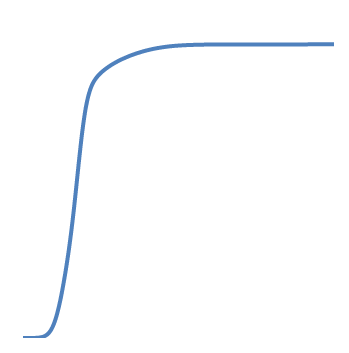
| Category | Series 0 |
|---|---|
| -2.6286 | 0 |
| -2.62704 | 0 |
| -2.62549 | 0 |
| -2.62393 | 0 |
| -2.62238 | 0 |
| -2.62082 | 0 |
| -2.61926 | 0 |
| -2.61771 | 0 |
| -2.61615 | 0 |
| -2.6146 | 0 |
| -2.61304 | 0 |
| -2.61148 | 0 |
| -2.60993 | 0 |
| -2.60837 | 0 |
| -2.60681 | 0 |
| -2.60526 | 0 |
| -2.6037 | 0 |
| -2.60215 | 0 |
| -2.60059 | 0 |
| -2.59903 | 0 |
| -2.59748 | 0 |
| -2.59592 | 0 |
| -2.59437 | 0 |
| -2.59281 | 0 |
| -2.59125 | 0 |
| -2.5897 | 0 |
| -2.58814 | 0 |
| -2.58658 | 0 |
| -2.58503 | 0 |
| -2.58347 | 0 |
| -2.58192 | 0 |
| -2.58036 | 0 |
| -2.5788 | 0 |
| -2.57725 | 0 |
| -2.57569 | 0 |
| -2.57414 | 0 |
| -2.57258 | 0 |
| -2.57102 | 0 |
| -2.56947 | 0 |
| -2.56791 | 0 |
| -2.56635 | 0 |
| -2.5648 | 0 |
| -2.56324 | 0 |
| -2.56169 | 0 |
| -2.56013 | 0 |
| -2.55857 | 0 |
| -2.55702 | 0 |
| -2.55546 | 0 |
| -2.55391 | 0 |
| -2.55235 | 0 |
| -2.55079 | 0 |
| -2.54924 | 0 |
| -2.54768 | 0 |
| -2.54612 | 0 |
| -2.54457 | 0 |
| -2.54301 | 0 |
| -2.54146 | 0 |
| -2.5399 | 0 |
| -2.53834 | 0 |
| -2.53679 | 0 |
| -2.53523 | 0 |
| -2.53368 | 0 |
| -2.53212 | 0 |
| -2.53056 | 0 |
| -2.52901 | 0 |
| -2.52745 | 0 |
| -2.52589 | 0 |
| -2.52434 | 0 |
| -2.52278 | 0 |
| -2.52123 | 0 |
| -2.51967 | 0 |
| -2.51811 | 0 |
| -2.51656 | 0 |
| -2.515 | 0 |
| -2.51345 | 0 |
| -2.51189 | 0 |
| -2.51033 | 0 |
| -2.50878 | 0 |
| -2.50722 | 0 |
| -2.50566 | 0 |
| -2.50411 | 0 |
| -2.50255 | 0 |
| -2.501 | 0 |
| -2.49944 | 0 |
| -2.49788 | 0 |
| -2.49633 | 0 |
| -2.49477 | 0 |
| -2.49322 | 0 |
| -2.49166 | 0 |
| -2.4901 | 0 |
| -2.48855 | 0 |
| -2.48699 | 0 |
| -2.48543 | 0 |
| -2.48388 | 0 |
| -2.48232 | 0 |
| -2.48077 | 0 |
| -2.47921 | 0 |
| -2.47765 | 0 |
| -2.4761 | 0 |
| -2.47454 | 0 |
| -2.47299 | 0 |
| -2.47143 | 0 |
| -2.46987 | 0 |
| -2.46832 | 0 |
| -2.46676 | 0 |
| -2.4652 | 0 |
| -2.46365 | 0 |
| -2.46209 | 0 |
| -2.46054 | 0 |
| -2.45898 | 0 |
| -2.45742 | 0 |
| -2.45587 | 0 |
| -2.45431 | 0 |
| -2.45276 | 0 |
| -2.4512 | 0 |
| -2.44964 | 0 |
| -2.44809 | 0 |
| -2.44653 | 0 |
| -2.44497 | 0 |
| -2.44342 | 0 |
| -2.44186 | 0 |
| -2.44031 | 0 |
| -2.43875 | 0 |
| -2.43719 | 0 |
| -2.43564 | 0 |
| -2.43408 | 0 |
| -2.43253 | 0 |
| -2.43097 | 0 |
| -2.42941 | 0 |
| -2.42786 | 0 |
| -2.4263 | 0 |
| -2.42474 | 0 |
| -2.42319 | 0 |
| -2.42163 | 0 |
| -2.42008 | 0 |
| -2.41852 | 0 |
| -2.41696 | 0 |
| -2.41541 | 0 |
| -2.41385 | 0 |
| -2.4123 | 0 |
| -2.41074 | 0 |
| -2.40918 | 0 |
| -2.40763 | 0 |
| -2.40607 | 0 |
| -2.40451 | 0 |
| -2.40296 | 0 |
| -2.4014 | 0 |
| -2.39985 | 0 |
| -2.39829 | 0 |
| -2.39673 | 0 |
| -2.39518 | 0 |
| -2.39362 | 0 |
| -2.39207 | 0 |
| -2.39051 | 0 |
| -2.38895 | 0 |
| -2.3874 | 0 |
| -2.38584 | 0 |
| -2.38428 | 0 |
| -2.38273 | 0 |
| -2.38117 | 0 |
| -2.37962 | 0 |
| -2.37806 | 0 |
| -2.3765 | 0 |
| -2.37495 | 0 |
| -2.37339 | 0 |
| -2.37184 | 0 |
| -2.37028 | 0 |
| -2.36872 | 0 |
| -2.36717 | 0 |
| -2.36561 | 0 |
| -2.36405 | 0 |
| -2.3625 | 0 |
| -2.36094 | 0 |
| -2.35939 | 0 |
| -2.35783 | 0 |
| -2.35627 | 0 |
| -2.35472 | 0 |
| -2.35316 | 0 |
| -2.35161 | 0 |
| -2.35005 | 0 |
| -2.34849 | 0 |
| -2.34694 | 0 |
| -2.34538 | 0 |
| -2.34382 | 0 |
| -2.34227 | 0 |
| -2.34071 | 0 |
| -2.33916 | 0 |
| -2.3376 | 0 |
| -2.33604 | 0 |
| -2.33449 | 0 |
| -2.33293 | 0 |
| -2.33138 | 0 |
| -2.32982 | 0 |
| -2.32826 | 0 |
| -2.32671 | 0 |
| -2.32515 | 0 |
| -2.32359 | 0 |
| -2.32204 | 0 |
| -2.32048 | 0 |
| -2.31893 | 0 |
| -2.31737 | 0 |
| -2.31581 | 0 |
| -2.31426 | 0 |
| -2.3127 | 0 |
| -2.31115 | 0 |
| -2.30959 | 0 |
| -2.30803 | 0 |
| -2.30648 | 0 |
| -2.30492 | 0 |
| -2.30336 | 0 |
| -2.30181 | 0 |
| -2.30025 | 0 |
| -2.2987 | 0 |
| -2.29714 | 0 |
| -2.29558 | 0 |
| -2.29403 | 0 |
| -2.29247 | 0 |
| -2.29092 | 0 |
| -2.28936 | 0 |
| -2.2878 | 0 |
| -2.28625 | 0 |
| -2.28469 | 0 |
| -2.28313 | 0 |
| -2.28158 | 0 |
| -2.28002 | 0 |
| -2.27847 | 0 |
| -2.27691 | 0 |
| -2.27535 | 0 |
| -2.2738 | 0 |
| -2.27224 | 0 |
| -2.27069 | 0 |
| -2.26913 | 0 |
| -2.26757 | 0 |
| -2.26602 | 0 |
| -2.26446 | 0 |
| -2.2629 | 0 |
| -2.26135 | 0 |
| -2.25979 | 0 |
| -2.25824 | 0 |
| -2.25668 | 0 |
| -2.25512 | 0 |
| -2.25357 | 0 |
| -2.25201 | 0 |
| -2.25046 | 0 |
| -2.2489 | 0 |
| -2.24734 | 0 |
| -2.24579 | 0 |
| -2.24423 | 0 |
| -2.24267 | 0 |
| -2.24112 | 0 |
| -2.23956 | 0 |
| -2.23801 | 0 |
| -2.23645 | 0 |
| -2.23489 | 0 |
| -2.23334 | 0 |
| -2.23178 | 0 |
| -2.23022 | 0 |
| -2.22867 | 0 |
| -2.22711 | 0 |
| -2.22556 | 0 |
| -2.224 | 0 |
| -2.22244 | 0 |
| -2.22089 | 0 |
| -2.21933 | 0 |
| -2.21778 | 0 |
| -2.21622 | 0 |
| -2.21466 | 0 |
| -2.21311 | 0 |
| -2.21155 | 0 |
| -2.20999 | 0 |
| -2.20844 | 0 |
| -2.20688 | 0 |
| -2.20533 | 0 |
| -2.20377 | 0 |
| -2.20221 | 0 |
| -2.20066 | 0 |
| -2.1991 | 0 |
| -2.19755 | 0 |
| -2.19599 | 0 |
| -2.19443 | 0 |
| -2.19288 | 0 |
| -2.19132 | 0 |
| -2.18976 | 0 |
| -2.18821 | 0 |
| -2.18665 | 0 |
| -2.1851 | 0 |
| -2.18354 | 0 |
| -2.18198 | 0 |
| -2.18043 | 0 |
| -2.17887 | 0 |
| -2.17732 | 0 |
| -2.17576 | 0 |
| -2.1742 | 0 |
| -2.17265 | 0 |
| -2.17109 | 0 |
| -2.16953 | 0 |
| -2.16798 | 0 |
| -2.16642 | 0 |
| -2.16487 | 0 |
| -2.16331 | 0 |
| -2.16175 | 0 |
| -2.1602 | 0 |
| -2.15864 | 0 |
| -2.15709 | 0 |
| -2.15553 | 0 |
| -2.15397 | 0 |
| -2.15242 | 0 |
| -2.15086 | 0 |
| -2.1493 | 0 |
| -2.14775 | 0 |
| -2.14619 | 0 |
| -2.14464 | 0 |
| -2.14308 | 0 |
| -2.14152 | 0 |
| -2.13997 | 0 |
| -2.13841 | 0 |
| -2.13686 | 0 |
| -2.1353 | 0 |
| -2.13374 | 0 |
| -2.13219 | 0 |
| -2.13063 | 0 |
| -2.12907 | 0 |
| -2.12752 | 0 |
| -2.12596 | 0 |
| -2.12441 | 0 |
| -2.12285 | 0 |
| -2.12129 | 0 |
| -2.11974 | 0 |
| -2.11818 | 0 |
| -2.11663 | 0 |
| -2.11507 | 0 |
| -2.11351 | 0 |
| -2.11196 | 0 |
| -2.1104 | 0 |
| -2.10884 | 0 |
| -2.10729 | 0 |
| -2.10573 | 0 |
| -2.10418 | 0 |
| -2.10262 | 0 |
| -2.10106 | 0 |
| -2.09951 | 0 |
| -2.09795 | 0 |
| -2.0964 | 0 |
| -2.09484 | 0 |
| -2.09328 | 0 |
| -2.09173 | 0 |
| -2.09017 | 0 |
| -2.08861 | 0 |
| -2.08706 | 0 |
| -2.0855 | 0 |
| -2.08395 | 0 |
| -2.08239 | 0 |
| -2.08083 | 0 |
| -2.07928 | 0 |
| -2.07772 | 0 |
| -2.07617 | 0 |
| -2.07461 | 0 |
| -2.07305 | 0 |
| -2.0715 | 0 |
| -2.06994 | 0 |
| -2.06838 | 0 |
| -2.06683 | 0 |
| -2.06527 | 0 |
| -2.06372 | 0 |
| -2.06216 | 0 |
| -2.0606 | 0 |
| -2.05905 | 0 |
| -2.05749 | 0 |
| -2.05594 | 0 |
| -2.05438 | 0 |
| -2.05282 | 0 |
| -2.05127 | 0 |
| -2.04971 | 0 |
| -2.04815 | 0 |
| -2.0466 | 0 |
| -2.04504 | 0 |
| -2.04349 | 0 |
| -2.04193 | 0 |
| -2.04037 | 0 |
| -2.03882 | 0 |
| -2.03726 | 0 |
| -2.03571 | 0 |
| -2.03415 | 0 |
| -2.03259 | 0 |
| -2.03104 | 0 |
| -2.02948 | 0 |
| -2.02792 | 0 |
| -2.02637 | 0 |
| -2.02481 | 0 |
| -2.02326 | 0 |
| -2.0217 | 0 |
| -2.02014 | 0 |
| -2.01859 | 0 |
| -2.01703 | 0.001 |
| -2.01548 | 0.001 |
| -2.01392 | 0.001 |
| -2.01236 | 0.001 |
| -2.01081 | 0.001 |
| -2.00925 | 0.001 |
| -2.00769 | 0.001 |
| -2.00614 | 0.001 |
| -2.00458 | 0.001 |
| -2.00303 | 0.001 |
| -2.00147 | 0.001 |
| -1.99991 | 0.001 |
| -1.99836 | 0.001 |
| -1.9968 | 0.001 |
| -1.99525 | 0.001 |
| -1.99369 | 0.001 |
| -1.99213 | 0.001 |
| -1.99058 | 0.001 |
| -1.98902 | 0.001 |
| -1.98746 | 0.001 |
| -1.98591 | 0.001 |
| -1.98435 | 0.001 |
| -1.9828 | 0.001 |
| -1.98124 | 0.001 |
| -1.97968 | 0.001 |
| -1.97813 | 0.001 |
| -1.97657 | 0.001 |
| -1.97502 | 0.001 |
| -1.97346 | 0.001 |
| -1.9719 | 0.001 |
| -1.97035 | 0.001 |
| -1.96879 | 0.001 |
| -1.96723 | 0.001 |
| -1.96568 | 0.001 |
| -1.96412 | 0.001 |
| -1.96257 | 0.001 |
| -1.96101 | 0.001 |
| -1.95945 | 0.001 |
| -1.9579 | 0.001 |
| -1.95634 | 0.001 |
| -1.95479 | 0.001 |
| -1.95323 | 0.001 |
| -1.95167 | 0.001 |
| -1.95012 | 0.001 |
| -1.94856 | 0.001 |
| -1.947 | 0.001 |
| -1.94545 | 0.001 |
| -1.94389 | 0.001 |
| -1.94234 | 0.001 |
| -1.94078 | 0.001 |
| -1.93922 | 0.001 |
| -1.93767 | 0.001 |
| -1.93611 | 0.001 |
| -1.93456 | 0.001 |
| -1.933 | 0.001 |
| -1.93144 | 0.001 |
| -1.92989 | 0.001 |
| -1.92833 | 0.001 |
| -1.92677 | 0.001 |
| -1.92522 | 0.001 |
| -1.92366 | 0.001 |
| -1.92211 | 0.001 |
| -1.92055 | 0.001 |
| -1.91899 | 0.001 |
| -1.91744 | 0.001 |
| -1.91588 | 0.001 |
| -1.91433 | 0.001 |
| -1.91277 | 0.001 |
| -1.91121 | 0.001 |
| -1.90966 | 0.001 |
| -1.9081 | 0.001 |
| -1.90654 | 0.001 |
| -1.90499 | 0.001 |
| -1.90343 | 0.001 |
| -1.90188 | 0.001 |
| -1.90032 | 0.001 |
| -1.89876 | 0.001 |
| -1.89721 | 0.001 |
| -1.89565 | 0.001 |
| -1.8941 | 0.001 |
| -1.89254 | 0.001 |
| -1.89098 | 0.001 |
| -1.88943 | 0.001 |
| -1.88787 | 0.001 |
| -1.88631 | 0.001 |
| -1.88476 | 0.001 |
| -1.8832 | 0.001 |
| -1.88165 | 0.001 |
| -1.88009 | 0.001 |
| -1.87853 | 0.001 |
| -1.87698 | 0.001 |
| -1.87542 | 0.001 |
| -1.87387 | 0.001 |
| -1.87231 | 0.001 |
| -1.87075 | 0.001 |
| -1.8692 | 0.001 |
| -1.86764 | 0.001 |
| -1.86608 | 0.001 |
| -1.86453 | 0.001 |
| -1.86297 | 0.001 |
| -1.86142 | 0.001 |
| -1.85986 | 0.001 |
| -1.8583 | 0.001 |
| -1.85675 | 0.001 |
| -1.85519 | 0.001 |
| -1.85364 | 0.002 |
| -1.85208 | 0.002 |
| -1.85052 | 0.002 |
| -1.84897 | 0.002 |
| -1.84741 | 0.002 |
| -1.84585 | 0.002 |
| -1.8443 | 0.002 |
| -1.84274 | 0.002 |
| -1.84119 | 0.002 |
| -1.83963 | 0.002 |
| -1.83807 | 0.002 |
| -1.83652 | 0.002 |
| -1.83496 | 0.002 |
| -1.83341 | 0.002 |
| -1.83185 | 0.002 |
| -1.83029 | 0.002 |
| -1.82874 | 0.002 |
| -1.82718 | 0.002 |
| -1.82562 | 0.002 |
| -1.82407 | 0.002 |
| -1.82251 | 0.002 |
| -1.82096 | 0.002 |
| -1.8194 | 0.002 |
| -1.81784 | 0.002 |
| -1.81629 | 0.002 |
| -1.81473 | 0.002 |
| -1.81317 | 0.002 |
| -1.81162 | 0.002 |
| -1.81006 | 0.002 |
| -1.80851 | 0.002 |
| -1.80695 | 0.002 |
| -1.80539 | 0.002 |
| -1.80384 | 0.002 |
| -1.80228 | 0.002 |
| -1.80073 | 0.002 |
| -1.79917 | 0.002 |
| -1.79761 | 0.002 |
| -1.79606 | 0.002 |
| -1.7945 | 0.002 |
| -1.79294 | 0.002 |
| -1.79139 | 0.002 |
| -1.78983 | 0.002 |
| -1.78828 | 0.002 |
| -1.78672 | 0.002 |
| -1.78516 | 0.002 |
| -1.78361 | 0.002 |
| -1.78205 | 0.002 |
| -1.7805 | 0.002 |
| -1.77894 | 0.002 |
| -1.77738 | 0.002 |
| -1.77583 | 0.002 |
| -1.77427 | 0.002 |
| -1.77271 | 0.002 |
| -1.77116 | 0.003 |
| -1.7696 | 0.003 |
| -1.76805 | 0.003 |
| -1.76649 | 0.003 |
| -1.76493 | 0.003 |
| -1.76338 | 0.003 |
| -1.76182 | 0.003 |
| -1.76027 | 0.003 |
| -1.75871 | 0.003 |
| -1.75715 | 0.003 |
| -1.7556 | 0.003 |
| -1.75404 | 0.003 |
| -1.75248 | 0.003 |
| -1.75093 | 0.003 |
| -1.74937 | 0.003 |
| -1.74782 | 0.003 |
| -1.74626 | 0.003 |
| -1.7447 | 0.003 |
| -1.74315 | 0.003 |
| -1.74159 | 0.003 |
| -1.74004 | 0.003 |
| -1.73848 | 0.003 |
| -1.73692 | 0.003 |
| -1.73537 | 0.003 |
| -1.73381 | 0.003 |
| -1.73225 | 0.003 |
| -1.7307 | 0.003 |
| -1.72914 | 0.003 |
| -1.72759 | 0.003 |
| -1.72603 | 0.003 |
| -1.72447 | 0.003 |
| -1.72292 | 0.003 |
| -1.72136 | 0.003 |
| -1.71981 | 0.003 |
| -1.71825 | 0.003 |
| -1.71669 | 0.003 |
| -1.71514 | 0.004 |
| -1.71358 | 0.004 |
| -1.71202 | 0.004 |
| -1.71047 | 0.004 |
| -1.70891 | 0.004 |
| -1.70736 | 0.004 |
| -1.7058 | 0.004 |
| -1.70424 | 0.004 |
| -1.70269 | 0.004 |
| -1.70113 | 0.004 |
| -1.69958 | 0.004 |
| -1.69802 | 0.004 |
| -1.69646 | 0.004 |
| -1.69491 | 0.004 |
| -1.69335 | 0.004 |
| -1.69179 | 0.004 |
| -1.69024 | 0.004 |
| -1.68868 | 0.004 |
| -1.68713 | 0.004 |
| -1.68557 | 0.004 |
| -1.68401 | 0.004 |
| -1.68246 | 0.004 |
| -1.6809 | 0.004 |
| -1.67935 | 0.004 |
| -1.67779 | 0.004 |
| -1.67623 | 0.004 |
| -1.67468 | 0.004 |
| -1.67312 | 0.004 |
| -1.67156 | 0.004 |
| -1.67001 | 0.004 |
| -1.66845 | 0.005 |
| -1.6669 | 0.005 |
| -1.66534 | 0.005 |
| -1.66378 | 0.005 |
| -1.66223 | 0.005 |
| -1.66067 | 0.005 |
| -1.65912 | 0.005 |
| -1.65756 | 0.005 |
| -1.656 | 0.005 |
| -1.65445 | 0.005 |
| -1.65289 | 0.005 |
| -1.65133 | 0.005 |
| -1.64978 | 0.005 |
| -1.64822 | 0.005 |
| -1.64667 | 0.005 |
| -1.64511 | 0.005 |
| -1.64355 | 0.005 |
| -1.642 | 0.005 |
| -1.64044 | 0.005 |
| -1.63889 | 0.005 |
| -1.63733 | 0.005 |
| -1.63577 | 0.005 |
| -1.63422 | 0.005 |
| -1.63266 | 0.006 |
| -1.6311 | 0.006 |
| -1.62955 | 0.006 |
| -1.62799 | 0.006 |
| -1.62644 | 0.006 |
| -1.62488 | 0.006 |
| -1.62332 | 0.006 |
| -1.62177 | 0.006 |
| -1.62021 | 0.006 |
| -1.61866 | 0.006 |
| -1.6171 | 0.006 |
| -1.61554 | 0.006 |
| -1.61399 | 0.006 |
| -1.61243 | 0.006 |
| -1.61087 | 0.006 |
| -1.60932 | 0.006 |
| -1.60776 | 0.006 |
| -1.60621 | 0.006 |
| -1.60465 | 0.006 |
| -1.60309 | 0.007 |
| -1.60154 | 0.007 |
| -1.59998 | 0.007 |
| -1.59843 | 0.007 |
| -1.59687 | 0.007 |
| -1.59531 | 0.007 |
| -1.59376 | 0.007 |
| -1.5922 | 0.007 |
| -1.59064 | 0.007 |
| -1.58909 | 0.007 |
| -1.58753 | 0.007 |
| -1.58598 | 0.007 |
| -1.58442 | 0.007 |
| -1.58286 | 0.007 |
| -1.58131 | 0.007 |
| -1.57975 | 0.007 |
| -1.5782 | 0.007 |
| -1.57664 | 0.007 |
| -1.57508 | 0.008 |
| -1.57353 | 0.008 |
| -1.57197 | 0.008 |
| -1.57041 | 0.008 |
| -1.56886 | 0.008 |
| -1.5673 | 0.008 |
| -1.56575 | 0.008 |
| -1.56419 | 0.008 |
| -1.56263 | 0.008 |
| -1.56108 | 0.008 |
| -1.55952 | 0.008 |
| -1.55797 | 0.008 |
| -1.55641 | 0.008 |
| -1.55485 | 0.008 |
| -1.5533 | 0.008 |
| -1.55174 | 0.009 |
| -1.55018 | 0.009 |
| -1.54863 | 0.009 |
| -1.54707 | 0.009 |
| -1.54552 | 0.009 |
| -1.54396 | 0.009 |
| -1.5424 | 0.009 |
| -1.54085 | 0.009 |
| -1.53929 | 0.009 |
| -1.53774 | 0.009 |
| -1.53618 | 0.009 |
| -1.53462 | 0.009 |
| -1.53307 | 0.009 |
| -1.53151 | 0.009 |
| -1.52995 | 0.01 |
| -1.5284 | 0.01 |
| -1.52684 | 0.01 |
| -1.52529 | 0.01 |
| -1.52373 | 0.01 |
| -1.52217 | 0.01 |
| -1.52062 | 0.01 |
| -1.51906 | 0.01 |
| -1.51751 | 0.01 |
| -1.51595 | 0.01 |
| -1.51439 | 0.01 |
| -1.51284 | 0.01 |
| -1.51128 | 0.011 |
| -1.50972 | 0.011 |
| -1.50817 | 0.011 |
| -1.50661 | 0.011 |
| -1.50506 | 0.011 |
| -1.5035 | 0.011 |
| -1.50194 | 0.011 |
| -1.50039 | 0.011 |
| -1.49883 | 0.011 |
| -1.49728 | 0.011 |
| -1.49572 | 0.011 |
| -1.49416 | 0.011 |
| -1.49261 | 0.011 |
| -1.49105 | 0.012 |
| -1.48949 | 0.012 |
| -1.48794 | 0.012 |
| -1.48638 | 0.012 |
| -1.48483 | 0.012 |
| -1.48327 | 0.012 |
| -1.48171 | 0.012 |
| -1.48016 | 0.012 |
| -1.4786 | 0.012 |
| -1.47705 | 0.012 |
| -1.47549 | 0.012 |
| -1.47393 | 0.013 |
| -1.47238 | 0.013 |
| -1.47082 | 0.013 |
| -1.46926 | 0.013 |
| -1.46771 | 0.013 |
| -1.46615 | 0.013 |
| -1.4646 | 0.013 |
| -1.46304 | 0.013 |
| -1.46148 | 0.013 |
| -1.45993 | 0.014 |
| -1.45837 | 0.014 |
| -1.45682 | 0.014 |
| -1.45526 | 0.014 |
| -1.4537 | 0.014 |
| -1.45215 | 0.014 |
| -1.45059 | 0.014 |
| -1.44903 | 0.014 |
| -1.44748 | 0.014 |
| -1.44592 | 0.014 |
| -1.44437 | 0.015 |
| -1.44281 | 0.015 |
| -1.44125 | 0.015 |
| -1.4397 | 0.015 |
| -1.43814 | 0.015 |
| -1.43659 | 0.015 |
| -1.43503 | 0.015 |
| -1.43347 | 0.015 |
| -1.43192 | 0.015 |
| -1.43036 | 0.016 |
| -1.4288 | 0.016 |
| -1.42725 | 0.016 |
| -1.42569 | 0.016 |
| -1.42414 | 0.016 |
| -1.42258 | 0.016 |
| -1.42102 | 0.016 |
| -1.41947 | 0.016 |
| -1.41791 | 0.017 |
| -1.41636 | 0.017 |
| -1.4148 | 0.017 |
| -1.41324 | 0.017 |
| -1.41169 | 0.017 |
| -1.41013 | 0.017 |
| -1.40857 | 0.017 |
| -1.40702 | 0.017 |
| -1.40546 | 0.018 |
| -1.40391 | 0.018 |
| -1.40235 | 0.018 |
| -1.40079 | 0.018 |
| -1.39924 | 0.018 |
| -1.39768 | 0.018 |
| -1.39613 | 0.018 |
| -1.39457 | 0.019 |
| -1.39301 | 0.019 |
| -1.39146 | 0.019 |
| -1.3899 | 0.019 |
| -1.38834 | 0.019 |
| -1.38679 | 0.019 |
| -1.38523 | 0.019 |
| -1.38368 | 0.02 |
| -1.38212 | 0.02 |
| -1.38056 | 0.02 |
| -1.37901 | 0.02 |
| -1.37745 | 0.02 |
| -1.37589 | 0.02 |
| -1.37434 | 0.02 |
| -1.37278 | 0.02 |
| -1.37123 | 0.021 |
| -1.36967 | 0.021 |
| -1.36811 | 0.021 |
| -1.36656 | 0.021 |
| -1.365 | 0.021 |
| -1.36345 | 0.021 |
| -1.36189 | 0.022 |
| -1.36033 | 0.022 |
| -1.35878 | 0.022 |
| -1.35722 | 0.022 |
| -1.35566 | 0.022 |
| -1.35411 | 0.022 |
| -1.35255 | 0.022 |
| -1.351 | 0.023 |
| -1.34944 | 0.023 |
| -1.34788 | 0.023 |
| -1.34633 | 0.023 |
| -1.34477 | 0.023 |
| -1.34322 | 0.023 |
| -1.34166 | 0.024 |
| -1.3401 | 0.024 |
| -1.33855 | 0.024 |
| -1.33699 | 0.024 |
| -1.33543 | 0.024 |
| -1.33388 | 0.024 |
| -1.33232 | 0.025 |
| -1.33077 | 0.025 |
| -1.32921 | 0.025 |
| -1.32765 | 0.025 |
| -1.3261 | 0.025 |
| -1.32454 | 0.025 |
| -1.32299 | 0.026 |
| -1.32143 | 0.026 |
| -1.31987 | 0.026 |
| -1.31832 | 0.026 |
| -1.31676 | 0.026 |
| -1.3152 | 0.026 |
| -1.31365 | 0.027 |
| -1.31209 | 0.027 |
| -1.31054 | 0.027 |
| -1.30898 | 0.027 |
| -1.30742 | 0.027 |
| -1.30587 | 0.028 |
| -1.30431 | 0.028 |
| -1.30276 | 0.028 |
| -1.3012 | 0.028 |
| -1.29964 | 0.028 |
| -1.29809 | 0.029 |
| -1.29653 | 0.029 |
| -1.29497 | 0.029 |
| -1.29342 | 0.029 |
| -1.29186 | 0.029 |
| -1.29031 | 0.03 |
| -1.28875 | 0.03 |
| -1.28719 | 0.03 |
| -1.28564 | 0.03 |
| -1.28408 | 0.03 |
| -1.28253 | 0.031 |
| -1.28097 | 0.031 |
| -1.27941 | 0.031 |
| -1.27786 | 0.031 |
| -1.2763 | 0.032 |
| -1.27474 | 0.032 |
| -1.27319 | 0.032 |
| -1.27163 | 0.032 |
| -1.27008 | 0.032 |
| -1.26852 | 0.033 |
| -1.26696 | 0.033 |
| -1.26541 | 0.033 |
| -1.26385 | 0.033 |
| -1.2623 | 0.033 |
| -1.26074 | 0.034 |
| -1.25918 | 0.034 |
| -1.25763 | 0.034 |
| -1.25607 | 0.034 |
| -1.25451 | 0.034 |
| -1.25296 | 0.035 |
| -1.2514 | 0.035 |
| -1.24985 | 0.035 |
| -1.24829 | 0.035 |
| -1.24673 | 0.036 |
| -1.24518 | 0.036 |
| -1.24362 | 0.036 |
| -1.24207 | 0.036 |
| -1.24051 | 0.037 |
| -1.23895 | 0.037 |
| -1.2374 | 0.037 |
| -1.23584 | 0.037 |
| -1.23428 | 0.037 |
| -1.23273 | 0.038 |
| -1.23117 | 0.038 |
| -1.22962 | 0.038 |
| -1.22806 | 0.038 |
| -1.2265 | 0.039 |
| -1.22495 | 0.039 |
| -1.22339 | 0.039 |
| -1.22184 | 0.039 |
| -1.22028 | 0.04 |
| -1.21872 | 0.04 |
| -1.21717 | 0.04 |
| -1.21561 | 0.04 |
| -1.21405 | 0.041 |
| -1.2125 | 0.041 |
| -1.21094 | 0.041 |
| -1.20939 | 0.041 |
| -1.20783 | 0.042 |
| -1.20627 | 0.042 |
| -1.20472 | 0.042 |
| -1.20316 | 0.043 |
| -1.20161 | 0.043 |
| -1.20005 | 0.043 |
| -1.19849 | 0.043 |
| -1.19694 | 0.044 |
| -1.19538 | 0.044 |
| -1.19382 | 0.044 |
| -1.19227 | 0.044 |
| -1.19071 | 0.045 |
| -1.18916 | 0.045 |
| -1.1876 | 0.045 |
| -1.18604 | 0.046 |
| -1.18449 | 0.046 |
| -1.18293 | 0.046 |
| -1.18138 | 0.046 |
| -1.17982 | 0.047 |
| -1.17826 | 0.047 |
| -1.17671 | 0.047 |
| -1.17515 | 0.048 |
| -1.17359 | 0.048 |
| -1.17204 | 0.048 |
| -1.17048 | 0.048 |
| -1.16893 | 0.049 |
| -1.16737 | 0.049 |
| -1.16581 | 0.049 |
| -1.16426 | 0.05 |
| -1.1627 | 0.05 |
| -1.16115 | 0.05 |
| -1.15959 | 0.05 |
| -1.15803 | 0.051 |
| -1.15648 | 0.051 |
| -1.15492 | 0.051 |
| -1.15336 | 0.052 |
| -1.15181 | 0.052 |
| -1.15025 | 0.052 |
| -1.1487 | 0.053 |
| -1.14714 | 0.053 |
| -1.14558 | 0.053 |
| -1.14403 | 0.054 |
| -1.14247 | 0.054 |
| -1.14092 | 0.054 |
| -1.13936 | 0.055 |
| -1.1378 | 0.055 |
| -1.13625 | 0.055 |
| -1.13469 | 0.056 |
| -1.13313 | 0.056 |
| -1.13158 | 0.056 |
| -1.13002 | 0.057 |
| -1.12847 | 0.057 |
| -1.12691 | 0.057 |
| -1.12535 | 0.058 |
| -1.1238 | 0.058 |
| -1.12224 | 0.058 |
| -1.12069 | 0.058 |
| -1.11913 | 0.059 |
| -1.11757 | 0.059 |
| -1.11602 | 0.059 |
| -1.11446 | 0.06 |
| -1.1129 | 0.06 |
| -1.11135 | 0.06 |
| -1.10979 | 0.061 |
| -1.10824 | 0.061 |
| -1.10668 | 0.061 |
| -1.10512 | 0.062 |
| -1.10357 | 0.062 |
| -1.10201 | 0.062 |
| -1.10046 | 0.063 |
| -1.0989 | 0.063 |
| -1.09734 | 0.064 |
| -1.09579 | 0.064 |
| -1.09423 | 0.064 |
| -1.09267 | 0.065 |
| -1.09112 | 0.065 |
| -1.08956 | 0.065 |
| -1.08801 | 0.066 |
| -1.08645 | 0.066 |
| -1.08489 | 0.066 |
| -1.08334 | 0.067 |
| -1.08178 | 0.067 |
| -1.08023 | 0.067 |
| -1.07867 | 0.068 |
| -1.07711 | 0.068 |
| -1.07556 | 0.069 |
| -1.074 | 0.069 |
| -1.07244 | 0.069 |
| -1.07089 | 0.07 |
| -1.06933 | 0.07 |
| -1.06778 | 0.07 |
| -1.06622 | 0.071 |
| -1.06466 | 0.071 |
| -1.06311 | 0.072 |
| -1.06155 | 0.072 |
| -1.06 | 0.072 |
| -1.05844 | 0.073 |
| -1.05688 | 0.073 |
| -1.05533 | 0.073 |
| -1.05377 | 0.074 |
| -1.05221 | 0.074 |
| -1.05066 | 0.075 |
| -1.0491 | 0.075 |
| -1.04755 | 0.075 |
| -1.04599 | 0.076 |
| -1.04443 | 0.076 |
| -1.04288 | 0.077 |
| -1.04132 | 0.077 |
| -1.03977 | 0.077 |
| -1.03821 | 0.078 |
| -1.03665 | 0.078 |
| -1.0351 | 0.078 |
| -1.03354 | 0.079 |
| -1.03198 | 0.079 |
| -1.03043 | 0.08 |
| -1.02887 | 0.08 |
| -1.02732 | 0.08 |
| -1.02576 | 0.081 |
| -1.0242 | 0.081 |
| -1.02265 | 0.082 |
| -1.02109 | 0.082 |
| -1.01954 | 0.082 |
| -1.01798 | 0.083 |
| -1.01642 | 0.083 |
| -1.01487 | 0.084 |
| -1.01331 | 0.084 |
| -1.01175 | 0.085 |
| -1.0102 | 0.085 |
| -1.00864 | 0.085 |
| -1.00709 | 0.086 |
| -1.00553 | 0.086 |
| -1.00397 | 0.087 |
| -1.00242 | 0.087 |
| -1.00086 | 0.088 |
| -0.99931 | 0.088 |
| -0.99775 | 0.088 |
| -0.99619 | 0.089 |
| -0.99464 | 0.089 |
| -0.99308 | 0.09 |
| -0.99152 | 0.09 |
| -0.98997 | 0.091 |
| -0.98841 | 0.091 |
| -0.98686 | 0.092 |
| -0.9853 | 0.092 |
| -0.98374 | 0.092 |
| -0.98219 | 0.093 |
| -0.98063 | 0.093 |
| -0.97908 | 0.094 |
| -0.97752 | 0.094 |
| -0.97596 | 0.095 |
| -0.97441 | 0.095 |
| -0.97285 | 0.096 |
| -0.97129 | 0.096 |
| -0.96974 | 0.097 |
| -0.96818 | 0.097 |
| -0.96663 | 0.098 |
| -0.96507 | 0.098 |
| -0.96351 | 0.099 |
| -0.96196 | 0.099 |
| -0.9604 | 0.099 |
| -0.95885 | 0.1 |
| -0.95729 | 0.1 |
| -0.95573 | 0.101 |
| -0.95418 | 0.101 |
| -0.95262 | 0.102 |
| -0.95106 | 0.102 |
| -0.94951 | 0.103 |
| -0.94795 | 0.103 |
| -0.9464 | 0.104 |
| -0.94484 | 0.104 |
| -0.94328 | 0.105 |
| -0.94173 | 0.105 |
| -0.94017 | 0.106 |
| -0.93861 | 0.106 |
| -0.93706 | 0.107 |
| -0.9355 | 0.107 |
| -0.93395 | 0.108 |
| -0.93239 | 0.108 |
| -0.93083 | 0.109 |
| -0.92928 | 0.109 |
| -0.92772 | 0.109 |
| -0.92617 | 0.11 |
| -0.92461 | 0.11 |
| -0.92305 | 0.111 |
| -0.9215 | 0.111 |
| -0.91994 | 0.112 |
| -0.91838 | 0.112 |
| -0.91683 | 0.113 |
| -0.91527 | 0.113 |
| -0.91372 | 0.114 |
| -0.91216 | 0.114 |
| -0.9106 | 0.115 |
| -0.90905 | 0.115 |
| -0.90749 | 0.116 |
| -0.90594 | 0.116 |
| -0.90438 | 0.117 |
| -0.90282 | 0.117 |
| -0.90127 | 0.118 |
| -0.89971 | 0.118 |
| -0.89815 | 0.119 |
| -0.8966 | 0.119 |
| -0.89504 | 0.12 |
| -0.89349 | 0.12 |
| -0.89193 | 0.121 |
| -0.89037 | 0.122 |
| -0.88882 | 0.122 |
| -0.88726 | 0.123 |
| -0.88571 | 0.123 |
| -0.88415 | 0.124 |
| -0.88259 | 0.124 |
| -0.88104 | 0.125 |
| -0.87948 | 0.125 |
| -0.87792 | 0.126 |
| -0.87637 | 0.126 |
| -0.87481 | 0.127 |
| -0.87326 | 0.127 |
| -0.8717 | 0.128 |
| -0.87014 | 0.128 |
| -0.86859 | 0.129 |
| -0.86703 | 0.129 |
| -0.86548 | 0.13 |
| -0.86392 | 0.13 |
| -0.86236 | 0.131 |
| -0.86081 | 0.131 |
| -0.85925 | 0.132 |
| -0.85769 | 0.133 |
| -0.85614 | 0.133 |
| -0.85458 | 0.134 |
| -0.85303 | 0.134 |
| -0.85147 | 0.135 |
| -0.84991 | 0.135 |
| -0.84836 | 0.136 |
| -0.8468 | 0.136 |
| -0.84525 | 0.137 |
| -0.84369 | 0.138 |
| -0.84213 | 0.138 |
| -0.84058 | 0.139 |
| -0.83902 | 0.139 |
| -0.83746 | 0.14 |
| -0.83591 | 0.14 |
| -0.83435 | 0.141 |
| -0.8328 | 0.142 |
| -0.83124 | 0.142 |
| -0.82968 | 0.143 |
| -0.82813 | 0.143 |
| -0.82657 | 0.144 |
| -0.82502 | 0.144 |
| -0.82346 | 0.145 |
| -0.8219 | 0.145 |
| -0.82035 | 0.146 |
| -0.81879 | 0.147 |
| -0.81723 | 0.147 |
| -0.81568 | 0.148 |
| -0.81412 | 0.148 |
| -0.81257 | 0.149 |
| -0.81101 | 0.149 |
| -0.80945 | 0.15 |
| -0.8079 | 0.151 |
| -0.80634 | 0.151 |
| -0.80479 | 0.152 |
| -0.80323 | 0.152 |
| -0.80167 | 0.153 |
| -0.80012 | 0.154 |
| -0.79856 | 0.154 |
| -0.797 | 0.155 |
| -0.79545 | 0.155 |
| -0.79389 | 0.156 |
| -0.79234 | 0.157 |
| -0.79078 | 0.157 |
| -0.78922 | 0.158 |
| -0.78767 | 0.158 |
| -0.78611 | 0.159 |
| -0.78456 | 0.16 |
| -0.783 | 0.16 |
| -0.78144 | 0.161 |
| -0.77989 | 0.161 |
| -0.77833 | 0.162 |
| -0.77677 | 0.162 |
| -0.77522 | 0.163 |
| -0.77366 | 0.164 |
| -0.77211 | 0.164 |
| -0.77055 | 0.165 |
| -0.76899 | 0.166 |
| -0.76744 | 0.166 |
| -0.76588 | 0.167 |
| -0.76433 | 0.167 |
| -0.76277 | 0.168 |
| -0.76121 | 0.169 |
| -0.75966 | 0.169 |
| -0.7581 | 0.17 |
| -0.75654 | 0.171 |
| -0.75499 | 0.171 |
| -0.75343 | 0.172 |
| -0.75188 | 0.172 |
| -0.75032 | 0.173 |
| -0.74876 | 0.174 |
| -0.74721 | 0.174 |
| -0.74565 | 0.175 |
| -0.7441 | 0.176 |
| -0.74254 | 0.176 |
| -0.74098 | 0.177 |
| -0.73943 | 0.177 |
| -0.73787 | 0.178 |
| -0.73631 | 0.179 |
| -0.73476 | 0.179 |
| -0.7332 | 0.18 |
| -0.73165 | 0.181 |
| -0.73009 | 0.181 |
| -0.72853 | 0.182 |
| -0.72698 | 0.182 |
| -0.72542 | 0.183 |
| -0.72387 | 0.184 |
| -0.72231 | 0.184 |
| -0.72075 | 0.185 |
| -0.7192 | 0.186 |
| -0.71764 | 0.186 |
| -0.71608 | 0.187 |
| -0.71453 | 0.188 |
| -0.71297 | 0.188 |
| -0.71142 | 0.189 |
| -0.70986 | 0.189 |
| -0.7083 | 0.19 |
| -0.70675 | 0.191 |
| -0.70519 | 0.191 |
| -0.70364 | 0.192 |
| -0.70208 | 0.193 |
| -0.70052 | 0.193 |
| -0.69897 | 0.194 |
| -0.69741 | 0.195 |
| -0.69585 | 0.195 |
| -0.6943 | 0.196 |
| -0.69274 | 0.196 |
| -0.69119 | 0.197 |
| -0.68963 | 0.198 |
| -0.68807 | 0.198 |
| -0.68652 | 0.199 |
| -0.68496 | 0.2 |
| -0.68341 | 0.201 |
| -0.68185 | 0.201 |
| -0.68029 | 0.202 |
| -0.67874 | 0.202 |
| -0.67718 | 0.203 |
| -0.67562 | 0.204 |
| -0.67407 | 0.204 |
| -0.67251 | 0.205 |
| -0.67096 | 0.206 |
| -0.6694 | 0.206 |
| -0.66784 | 0.207 |
| -0.66629 | 0.208 |
| -0.66473 | 0.208 |
| -0.66318 | 0.209 |
| -0.66162 | 0.21 |
| -0.66006 | 0.21 |
| -0.65851 | 0.211 |
| -0.65695 | 0.212 |
| -0.65539 | 0.212 |
| -0.65384 | 0.213 |
| -0.65228 | 0.214 |
| -0.65073 | 0.214 |
| -0.64917 | 0.215 |
| -0.64761 | 0.216 |
| -0.64606 | 0.216 |
| -0.6445 | 0.217 |
| -0.64295 | 0.218 |
| -0.64139 | 0.218 |
| -0.63983 | 0.219 |
| -0.63828 | 0.22 |
| -0.63672 | 0.22 |
| -0.63516 | 0.221 |
| -0.63361 | 0.222 |
| -0.63205 | 0.223 |
| -0.6305 | 0.223 |
| -0.62894 | 0.224 |
| -0.62738 | 0.225 |
| -0.62583 | 0.225 |
| -0.62427 | 0.226 |
| -0.62272 | 0.227 |
| -0.62116 | 0.227 |
| -0.6196 | 0.228 |
| -0.61805 | 0.229 |
| -0.61649 | 0.229 |
| -0.61493 | 0.23 |
| -0.61338 | 0.231 |
| -0.61182 | 0.231 |
| -0.61027 | 0.232 |
| -0.60871 | 0.233 |
| -0.60715 | 0.234 |
| -0.6056 | 0.234 |
| -0.60404 | 0.235 |
| -0.60249 | 0.236 |
| -0.60093 | 0.236 |
| -0.59937 | 0.237 |
| -0.59782 | 0.238 |
| -0.59626 | 0.239 |
| -0.5947 | 0.239 |
| -0.59315 | 0.24 |
| -0.59159 | 0.241 |
| -0.59004 | 0.241 |
| -0.58848 | 0.242 |
| -0.58692 | 0.243 |
| -0.58537 | 0.243 |
| -0.58381 | 0.244 |
| -0.58226 | 0.245 |
| -0.5807 | 0.246 |
| -0.57914 | 0.246 |
| -0.57759 | 0.247 |
| -0.57603 | 0.248 |
| -0.57447 | 0.248 |
| -0.57292 | 0.249 |
| -0.57136 | 0.25 |
| -0.56981 | 0.251 |
| -0.56825 | 0.251 |
| -0.56669 | 0.252 |
| -0.56514 | 0.253 |
| -0.56358 | 0.253 |
| -0.56203 | 0.254 |
| -0.56047 | 0.255 |
| -0.55891 | 0.256 |
| -0.55736 | 0.256 |
| -0.5558 | 0.257 |
| -0.55424 | 0.258 |
| -0.55269 | 0.259 |
| -0.55113 | 0.259 |
| -0.54958 | 0.26 |
| -0.54802 | 0.261 |
| -0.54646 | 0.262 |
| -0.54491 | 0.262 |
| -0.54335 | 0.263 |
| -0.5418 | 0.264 |
| -0.54024 | 0.265 |
| -0.53868 | 0.265 |
| -0.53713 | 0.266 |
| -0.53557 | 0.267 |
| -0.53401 | 0.267 |
| -0.53246 | 0.268 |
| -0.5309 | 0.269 |
| -0.52935 | 0.27 |
| -0.52779 | 0.271 |
| -0.52623 | 0.271 |
| -0.52468 | 0.272 |
| -0.52312 | 0.273 |
| -0.52156 | 0.274 |
| -0.52001 | 0.274 |
| -0.51845 | 0.275 |
| -0.5169 | 0.276 |
| -0.51534 | 0.277 |
| -0.51378 | 0.277 |
| -0.51223 | 0.278 |
| -0.51067 | 0.279 |
| -0.50912 | 0.28 |
| -0.50756 | 0.28 |
| -0.506 | 0.281 |
| -0.50445 | 0.282 |
| -0.50289 | 0.283 |
| -0.50133 | 0.284 |
| -0.49978 | 0.284 |
| -0.49822 | 0.285 |
| -0.49667 | 0.286 |
| -0.49511 | 0.287 |
| -0.49355 | 0.287 |
| -0.492 | 0.288 |
| -0.49044 | 0.289 |
| -0.48889 | 0.29 |
| -0.48733 | 0.291 |
| -0.48577 | 0.292 |
| -0.48422 | 0.292 |
| -0.48266 | 0.293 |
| -0.4811 | 0.294 |
| -0.47955 | 0.294 |
| -0.47799 | 0.295 |
| -0.47644 | 0.296 |
| -0.47488 | 0.297 |
| -0.47332 | 0.298 |
| -0.47177 | 0.298 |
| -0.47021 | 0.299 |
| -0.46866 | 0.3 |
| -0.4671 | 0.301 |
| -0.46554 | 0.302 |
| -0.46399 | 0.302 |
| -0.46243 | 0.303 |
| -0.46087 | 0.304 |
| -0.45932 | 0.305 |
| -0.45776 | 0.306 |
| -0.45621 | 0.307 |
| -0.45465 | 0.307 |
| -0.45309 | 0.308 |
| -0.45154 | 0.309 |
| -0.44998 | 0.31 |
| -0.44843 | 0.311 |
| -0.44687 | 0.311 |
| -0.44531 | 0.312 |
| -0.44376 | 0.313 |
| -0.4422 | 0.314 |
| -0.44064 | 0.315 |
| -0.43909 | 0.316 |
| -0.43753 | 0.317 |
| -0.43598 | 0.317 |
| -0.43442 | 0.318 |
| -0.43286 | 0.319 |
| -0.43131 | 0.32 |
| -0.42975 | 0.321 |
| -0.4282 | 0.322 |
| -0.42664 | 0.322 |
| -0.42508 | 0.323 |
| -0.42353 | 0.324 |
| -0.42197 | 0.325 |
| -0.42041 | 0.326 |
| -0.41886 | 0.327 |
| -0.4173 | 0.327 |
| -0.41575 | 0.328 |
| -0.41419 | 0.329 |
| -0.41263 | 0.33 |
| -0.41108 | 0.331 |
| -0.40952 | 0.332 |
| -0.40797 | 0.333 |
| -0.40641 | 0.334 |
| -0.40485 | 0.334 |
| -0.4033 | 0.335 |
| -0.40174 | 0.336 |
| -0.40018 | 0.337 |
| -0.39863 | 0.338 |
| -0.39707 | 0.339 |
| -0.39552 | 0.339 |
| -0.39396 | 0.34 |
| -0.3924 | 0.341 |
| -0.39085 | 0.342 |
| -0.38929 | 0.343 |
| -0.38774 | 0.344 |
| -0.38618 | 0.345 |
| -0.38462 | 0.346 |
| -0.38307 | 0.346 |
| -0.38151 | 0.347 |
| -0.37995 | 0.348 |
| -0.3784 | 0.349 |
| -0.37684 | 0.35 |
| -0.37529 | 0.351 |
| -0.37373 | 0.352 |
| -0.37217 | 0.353 |
| -0.37062 | 0.354 |
| -0.36906 | 0.354 |
| -0.36751 | 0.355 |
| -0.36595 | 0.356 |
| -0.36439 | 0.357 |
| -0.36284 | 0.358 |
| -0.36128 | 0.359 |
| -0.35972 | 0.36 |
| -0.35817 | 0.361 |
| -0.35661 | 0.362 |
| -0.35506 | 0.362 |
| -0.3535 | 0.363 |
| -0.35194 | 0.364 |
| -0.35039 | 0.365 |
| -0.34883 | 0.366 |
| -0.34728 | 0.367 |
| -0.34572 | 0.368 |
| -0.34416 | 0.369 |
| -0.34261 | 0.37 |
| -0.34105 | 0.371 |
| -0.33949 | 0.372 |
| -0.33794 | 0.372 |
| -0.33638 | 0.373 |
| -0.33483 | 0.374 |
| -0.33327 | 0.375 |
| -0.33171 | 0.376 |
| -0.33016 | 0.377 |
| -0.3286 | 0.378 |
| -0.32705 | 0.379 |
| -0.32549 | 0.38 |
| -0.32393 | 0.381 |
| -0.32238 | 0.382 |
| -0.32082 | 0.383 |
| -0.31926 | 0.383 |
| -0.31771 | 0.384 |
| -0.31615 | 0.385 |
| -0.3146 | 0.386 |
| -0.31304 | 0.387 |
| -0.31148 | 0.388 |
| -0.30993 | 0.389 |
| -0.30837 | 0.39 |
| -0.30682 | 0.391 |
| -0.30526 | 0.392 |
| -0.3037 | 0.393 |
| -0.30215 | 0.394 |
| -0.30059 | 0.395 |
| -0.29903 | 0.396 |
| -0.29748 | 0.397 |
| -0.29592 | 0.398 |
| -0.29437 | 0.399 |
| -0.29281 | 0.399 |
| -0.29125 | 0.4 |
| -0.2897 | 0.401 |
| -0.28814 | 0.402 |
| -0.28659 | 0.403 |
| -0.28503 | 0.404 |
| -0.28347 | 0.405 |
| -0.28192 | 0.406 |
| -0.28036 | 0.407 |
| -0.2788 | 0.408 |
| -0.27725 | 0.409 |
| -0.27569 | 0.41 |
| -0.27414 | 0.411 |
| -0.27258 | 0.412 |
| -0.27102 | 0.413 |
| -0.26947 | 0.414 |
| -0.26791 | 0.415 |
| -0.26636 | 0.416 |
| -0.2648 | 0.417 |
| -0.26324 | 0.418 |
| -0.26169 | 0.419 |
| -0.26013 | 0.42 |
| -0.25857 | 0.421 |
| -0.25702 | 0.422 |
| -0.25546 | 0.423 |
| -0.25391 | 0.424 |
| -0.25235 | 0.425 |
| -0.25079 | 0.426 |
| -0.24924 | 0.427 |
| -0.24768 | 0.428 |
| -0.24613 | 0.429 |
| -0.24457 | 0.43 |
| -0.24301 | 0.431 |
| -0.24146 | 0.432 |
| -0.2399 | 0.433 |
| -0.23834 | 0.434 |
| -0.23679 | 0.435 |
| -0.23523 | 0.436 |
| -0.23368 | 0.437 |
| -0.23212 | 0.438 |
| -0.23056 | 0.439 |
| -0.22901 | 0.44 |
| -0.22745 | 0.441 |
| -0.2259 | 0.442 |
| -0.22434 | 0.443 |
| -0.22278 | 0.444 |
| -0.22123 | 0.445 |
| -0.21967 | 0.446 |
| -0.21811 | 0.447 |
| -0.21656 | 0.448 |
| -0.215 | 0.449 |
| -0.21345 | 0.45 |
| -0.21189 | 0.451 |
| -0.21033 | 0.452 |
| -0.20878 | 0.453 |
| -0.20722 | 0.454 |
| -0.20567 | 0.455 |
| -0.20411 | 0.456 |
| -0.20255 | 0.457 |
| -0.201 | 0.459 |
| -0.19944 | 0.46 |
| -0.19788 | 0.461 |
| -0.19633 | 0.462 |
| -0.19477 | 0.463 |
| -0.19322 | 0.464 |
| -0.19166 | 0.465 |
| -0.1901 | 0.466 |
| -0.18855 | 0.467 |
| -0.18699 | 0.468 |
| -0.18544 | 0.469 |
| -0.18388 | 0.47 |
| -0.18232 | 0.471 |
| -0.18077 | 0.472 |
| -0.17921 | 0.473 |
| -0.17765 | 0.474 |
| -0.1761 | 0.475 |
| -0.17454 | 0.476 |
| -0.17299 | 0.477 |
| -0.17143 | 0.478 |
| -0.16987 | 0.479 |
| -0.16832 | 0.48 |
| -0.16676 | 0.482 |
| -0.16521 | 0.483 |
| -0.16365 | 0.484 |
| -0.16209 | 0.485 |
| -0.16054 | 0.486 |
| -0.15898 | 0.487 |
| -0.15742 | 0.488 |
| -0.15587 | 0.489 |
| -0.15431 | 0.49 |
| -0.15276 | 0.491 |
| -0.1512 | 0.492 |
| -0.14964 | 0.493 |
| -0.14809 | 0.494 |
| -0.14653 | 0.495 |
| -0.14498 | 0.496 |
| -0.14342 | 0.498 |
| -0.14186 | 0.499 |
| -0.14031 | 0.5 |
| -0.13875 | 0.501 |
| -0.13719 | 0.502 |
| -0.13564 | 0.503 |
| -0.13408 | 0.504 |
| -0.13253 | 0.505 |
| -0.13097 | 0.506 |
| -0.12941 | 0.507 |
| -0.12786 | 0.508 |
| -0.1263 | 0.509 |
| -0.12475 | 0.511 |
| -0.12319 | 0.512 |
| -0.12163 | 0.513 |
| -0.12008 | 0.514 |
| -0.11852 | 0.515 |
| -0.11696 | 0.516 |
| -0.11541 | 0.517 |
| -0.11385 | 0.518 |
| -0.1123 | 0.519 |
| -0.11074 | 0.52 |
| -0.10918 | 0.521 |
| -0.10763 | 0.522 |
| -0.10607 | 0.523 |
| -0.10452 | 0.524 |
| -0.10296 | 0.525 |
| -0.1014 | 0.527 |
| -0.09985 | 0.528 |
| -0.09829 | 0.529 |
| -0.09673 | 0.53 |
| -0.09518 | 0.531 |
| -0.09362 | 0.532 |
| -0.09207 | 0.533 |
| -0.09051 | 0.534 |
| -0.08895 | 0.536 |
| -0.0874 | 0.537 |
| -0.08584 | 0.538 |
| -0.08428 | 0.539 |
| -0.08273 | 0.54 |
| -0.08117 | 0.541 |
| -0.07962 | 0.542 |
| -0.07806 | 0.543 |
| -0.0765 | 0.544 |
| -0.07495 | 0.545 |
| -0.07339 | 0.546 |
| -0.07184 | 0.547 |
| -0.07028 | 0.548 |
| -0.06872 | 0.55 |
| -0.06717 | 0.551 |
| -0.06561 | 0.552 |
| -0.06405 | 0.553 |
| -0.0625 | 0.554 |
| -0.06094 | 0.555 |
| -0.05939 | 0.556 |
| -0.05783 | 0.557 |
| -0.05627 | 0.558 |
| -0.05472 | 0.559 |
| -0.05316 | 0.561 |
| -0.05161 | 0.562 |
| -0.05005 | 0.563 |
| -0.04849 | 0.564 |
| -0.04694 | 0.565 |
| -0.04538 | 0.566 |
| -0.04382 | 0.567 |
| -0.04227 | 0.568 |
| -0.04071 | 0.569 |
| -0.03916 | 0.57 |
| -0.0376 | 0.571 |
| -0.03604 | 0.572 |
| -0.03449 | 0.573 |
| -0.03293 | 0.575 |
| -0.03138 | 0.576 |
| -0.02982 | 0.577 |
| -0.02826 | 0.578 |
| -0.02671 | 0.579 |
| -0.02515 | 0.58 |
| -0.02359 | 0.581 |
| -0.02204 | 0.582 |
| -0.02048 | 0.583 |
| -0.01893 | 0.584 |
| -0.01737 | 0.585 |
| -0.01581 | 0.587 |
| -0.01426 | 0.588 |
| -0.0127 | 0.589 |
| -0.01115 | 0.59 |
| -0.00959 | 0.591 |
| -0.00803 | 0.592 |
| -0.00648 | 0.593 |
| -0.00492 | 0.594 |
| -0.00336 | 0.595 |
| -0.00181 | 0.596 |
| -0.00025 | 0.597 |
| 0.0013 | 0.598 |
| 0.00286 | 0.599 |
| 0.00442 | 0.6 |
| 0.00597 | 0.601 |
| 0.00753 | 0.602 |
| 0.00908 | 0.603 |
| 0.01064 | 0.605 |
| 0.0122 | 0.606 |
| 0.01375 | 0.607 |
| 0.01531 | 0.608 |
| 0.01687 | 0.609 |
| 0.01842 | 0.61 |
| 0.01998 | 0.611 |
| 0.02153 | 0.612 |
| 0.02309 | 0.613 |
| 0.02465 | 0.614 |
| 0.0262 | 0.615 |
| 0.02776 | 0.616 |
| 0.02931 | 0.617 |
| 0.03087 | 0.618 |
| 0.03243 | 0.619 |
| 0.03398 | 0.62 |
| 0.03554 | 0.622 |
| 0.0371 | 0.623 |
| 0.03865 | 0.624 |
| 0.04021 | 0.625 |
| 0.04176 | 0.626 |
| 0.04332 | 0.627 |
| 0.04488 | 0.628 |
| 0.04643 | 0.629 |
| 0.04799 | 0.63 |
| 0.04954 | 0.631 |
| 0.0511 | 0.632 |
| 0.05266 | 0.633 |
| 0.05421 | 0.634 |
| 0.05577 | 0.635 |
| 0.05733 | 0.636 |
| 0.05888 | 0.637 |
| 0.06044 | 0.638 |
| 0.06199 | 0.639 |
| 0.06355 | 0.64 |
| 0.06511 | 0.641 |
| 0.06666 | 0.642 |
| 0.06822 | 0.643 |
| 0.06977 | 0.644 |
| 0.07133 | 0.645 |
| 0.07289 | 0.646 |
| 0.07444 | 0.647 |
| 0.076 | 0.648 |
| 0.07756 | 0.649 |
| 0.07911 | 0.65 |
| 0.08067 | 0.651 |
| 0.08222 | 0.652 |
| 0.08378 | 0.653 |
| 0.08534 | 0.654 |
| 0.08689 | 0.655 |
| 0.08845 | 0.656 |
| 0.09 | 0.657 |
| 0.09156 | 0.658 |
| 0.09312 | 0.659 |
| 0.09467 | 0.66 |
| 0.09623 | 0.661 |
| 0.09779 | 0.662 |
| 0.09934 | 0.663 |
| 0.1009 | 0.664 |
| 0.10245 | 0.665 |
| 0.10401 | 0.666 |
| 0.10557 | 0.667 |
| 0.10712 | 0.668 |
| 0.10868 | 0.669 |
| 0.11023 | 0.67 |
| 0.11179 | 0.671 |
| 0.11335 | 0.672 |
| 0.1149 | 0.673 |
| 0.11646 | 0.674 |
| 0.11802 | 0.675 |
| 0.11957 | 0.676 |
| 0.12113 | 0.677 |
| 0.12268 | 0.678 |
| 0.12424 | 0.679 |
| 0.1258 | 0.68 |
| 0.12735 | 0.681 |
| 0.12891 | 0.682 |
| 0.13046 | 0.683 |
| 0.13202 | 0.684 |
| 0.13358 | 0.685 |
| 0.13513 | 0.686 |
| 0.13669 | 0.687 |
| 0.13825 | 0.688 |
| 0.1398 | 0.689 |
| 0.14136 | 0.69 |
| 0.14291 | 0.691 |
| 0.14447 | 0.691 |
| 0.14603 | 0.692 |
| 0.14758 | 0.693 |
| 0.14914 | 0.694 |
| 0.15069 | 0.695 |
| 0.15225 | 0.696 |
| 0.15381 | 0.697 |
| 0.15536 | 0.698 |
| 0.15692 | 0.699 |
| 0.15848 | 0.7 |
| 0.16003 | 0.7 |
| 0.16159 | 0.701 |
| 0.16314 | 0.702 |
| 0.1647 | 0.703 |
| 0.16626 | 0.704 |
| 0.16781 | 0.705 |
| 0.16937 | 0.706 |
| 0.17092 | 0.707 |
| 0.17248 | 0.707 |
| 0.17404 | 0.708 |
| 0.17559 | 0.709 |
| 0.17715 | 0.71 |
| 0.17871 | 0.711 |
| 0.18026 | 0.712 |
| 0.18182 | 0.713 |
| 0.18337 | 0.714 |
| 0.18493 | 0.714 |
| 0.18649 | 0.715 |
| 0.18804 | 0.716 |
| 0.1896 | 0.717 |
| 0.19115 | 0.718 |
| 0.19271 | 0.719 |
| 0.19427 | 0.72 |
| 0.19582 | 0.721 |
| 0.19738 | 0.721 |
| 0.19894 | 0.722 |
| 0.20049 | 0.723 |
| 0.20205 | 0.724 |
| 0.2036 | 0.725 |
| 0.20516 | 0.726 |
| 0.20672 | 0.726 |
| 0.20827 | 0.727 |
| 0.20983 | 0.728 |
| 0.21138 | 0.729 |
| 0.21294 | 0.73 |
| 0.2145 | 0.731 |
| 0.21605 | 0.731 |
| 0.21761 | 0.732 |
| 0.21917 | 0.733 |
| 0.22072 | 0.734 |
| 0.22228 | 0.735 |
| 0.22383 | 0.735 |
| 0.22539 | 0.736 |
| 0.22695 | 0.737 |
| 0.2285 | 0.738 |
| 0.23006 | 0.738 |
| 0.23161 | 0.739 |
| 0.23317 | 0.74 |
| 0.23473 | 0.741 |
| 0.23628 | 0.742 |
| 0.23784 | 0.743 |
| 0.2394 | 0.743 |
| 0.24095 | 0.744 |
| 0.24251 | 0.745 |
| 0.24406 | 0.746 |
| 0.24562 | 0.746 |
| 0.24718 | 0.747 |
| 0.24873 | 0.748 |
| 0.25029 | 0.749 |
| 0.25184 | 0.749 |
| 0.2534 | 0.75 |
| 0.25496 | 0.751 |
| 0.25651 | 0.752 |
| 0.25807 | 0.753 |
| 0.25963 | 0.753 |
| 0.26118 | 0.754 |
| 0.26274 | 0.755 |
| 0.26429 | 0.756 |
| 0.26585 | 0.756 |
| 0.26741 | 0.757 |
| 0.26896 | 0.758 |
| 0.27052 | 0.758 |
| 0.27207 | 0.759 |
| 0.27363 | 0.76 |
| 0.27519 | 0.761 |
| 0.27674 | 0.761 |
| 0.2783 | 0.762 |
| 0.27986 | 0.763 |
| 0.28141 | 0.764 |
| 0.28297 | 0.764 |
| 0.28452 | 0.765 |
| 0.28608 | 0.766 |
| 0.28764 | 0.767 |
| 0.28919 | 0.767 |
| 0.29075 | 0.768 |
| 0.2923 | 0.769 |
| 0.29386 | 0.769 |
| 0.29542 | 0.77 |
| 0.29697 | 0.771 |
| 0.29853 | 0.771 |
| 0.30009 | 0.772 |
| 0.30164 | 0.773 |
| 0.3032 | 0.773 |
| 0.30475 | 0.774 |
| 0.30631 | 0.775 |
| 0.30787 | 0.775 |
| 0.30942 | 0.776 |
| 0.31098 | 0.777 |
| 0.31253 | 0.778 |
| 0.31409 | 0.778 |
| 0.31565 | 0.779 |
| 0.3172 | 0.779 |
| 0.31876 | 0.78 |
| 0.32032 | 0.781 |
| 0.32187 | 0.781 |
| 0.32343 | 0.782 |
| 0.32498 | 0.783 |
| 0.32654 | 0.783 |
| 0.3281 | 0.784 |
| 0.32965 | 0.784 |
| 0.33121 | 0.785 |
| 0.33277 | 0.786 |
| 0.33432 | 0.786 |
| 0.33588 | 0.787 |
| 0.33743 | 0.787 |
| 0.33899 | 0.788 |
| 0.34055 | 0.789 |
| 0.3421 | 0.789 |
| 0.34366 | 0.79 |
| 0.34521 | 0.79 |
| 0.34677 | 0.791 |
| 0.34833 | 0.792 |
| 0.34988 | 0.792 |
| 0.35144 | 0.793 |
| 0.353 | 0.793 |
| 0.35455 | 0.794 |
| 0.35611 | 0.794 |
| 0.35766 | 0.795 |
| 0.35922 | 0.795 |
| 0.36078 | 0.796 |
| 0.36233 | 0.797 |
| 0.36389 | 0.797 |
| 0.36544 | 0.798 |
| 0.367 | 0.798 |
| 0.36856 | 0.799 |
| 0.37011 | 0.799 |
| 0.37167 | 0.8 |
| 0.37323 | 0.8 |
| 0.37478 | 0.801 |
| 0.37634 | 0.801 |
| 0.37789 | 0.802 |
| 0.37945 | 0.803 |
| 0.38101 | 0.803 |
| 0.38256 | 0.804 |
| 0.38412 | 0.804 |
| 0.38567 | 0.805 |
| 0.38723 | 0.805 |
| 0.38879 | 0.806 |
| 0.39034 | 0.806 |
| 0.3919 | 0.807 |
| 0.39346 | 0.807 |
| 0.39501 | 0.808 |
| 0.39657 | 0.808 |
| 0.39812 | 0.809 |
| 0.39968 | 0.809 |
| 0.40124 | 0.81 |
| 0.40279 | 0.81 |
| 0.40435 | 0.811 |
| 0.4059 | 0.811 |
| 0.40746 | 0.812 |
| 0.40902 | 0.812 |
| 0.41057 | 0.813 |
| 0.41213 | 0.813 |
| 0.41369 | 0.814 |
| 0.41524 | 0.814 |
| 0.4168 | 0.815 |
| 0.41835 | 0.815 |
| 0.41991 | 0.816 |
| 0.42147 | 0.816 |
| 0.42302 | 0.817 |
| 0.42458 | 0.817 |
| 0.42613 | 0.818 |
| 0.42769 | 0.818 |
| 0.42925 | 0.819 |
| 0.4308 | 0.819 |
| 0.43236 | 0.82 |
| 0.43392 | 0.82 |
| 0.43547 | 0.82 |
| 0.43703 | 0.821 |
| 0.43858 | 0.821 |
| 0.44014 | 0.822 |
| 0.4417 | 0.822 |
| 0.44325 | 0.823 |
| 0.44481 | 0.823 |
| 0.44636 | 0.824 |
| 0.44792 | 0.824 |
| 0.44948 | 0.825 |
| 0.45103 | 0.825 |
| 0.45259 | 0.825 |
| 0.45415 | 0.826 |
| 0.4557 | 0.826 |
| 0.45726 | 0.827 |
| 0.45881 | 0.827 |
| 0.46037 | 0.827 |
| 0.46193 | 0.828 |
| 0.46348 | 0.828 |
| 0.46504 | 0.829 |
| 0.46659 | 0.829 |
| 0.46815 | 0.83 |
| 0.46971 | 0.83 |
| 0.47126 | 0.83 |
| 0.47282 | 0.831 |
| 0.47438 | 0.831 |
| 0.47593 | 0.832 |
| 0.47749 | 0.832 |
| 0.47904 | 0.832 |
| 0.4806 | 0.833 |
| 0.48216 | 0.833 |
| 0.48371 | 0.834 |
| 0.48527 | 0.834 |
| 0.48682 | 0.834 |
| 0.48838 | 0.835 |
| 0.48994 | 0.835 |
| 0.49149 | 0.835 |
| 0.49305 | 0.836 |
| 0.49461 | 0.836 |
| 0.49616 | 0.836 |
| 0.49772 | 0.837 |
| 0.49927 | 0.837 |
| 0.50083 | 0.838 |
| 0.50239 | 0.838 |
| 0.50394 | 0.838 |
| 0.5055 | 0.839 |
| 0.50705 | 0.839 |
| 0.50861 | 0.839 |
| 0.51017 | 0.84 |
| 0.51172 | 0.84 |
| 0.51328 | 0.841 |
| 0.51484 | 0.841 |
| 0.51639 | 0.841 |
| 0.51795 | 0.842 |
| 0.5195 | 0.842 |
| 0.52106 | 0.842 |
| 0.52262 | 0.843 |
| 0.52417 | 0.843 |
| 0.52573 | 0.843 |
| 0.52728 | 0.844 |
| 0.52884 | 0.844 |
| 0.5304 | 0.844 |
| 0.53195 | 0.845 |
| 0.53351 | 0.845 |
| 0.53507 | 0.845 |
| 0.53662 | 0.846 |
| 0.53818 | 0.846 |
| 0.53973 | 0.846 |
| 0.54129 | 0.847 |
| 0.54285 | 0.847 |
| 0.5444 | 0.847 |
| 0.54596 | 0.848 |
| 0.54751 | 0.848 |
| 0.54907 | 0.848 |
| 0.55063 | 0.849 |
| 0.55218 | 0.849 |
| 0.55374 | 0.849 |
| 0.5553 | 0.85 |
| 0.55685 | 0.85 |
| 0.55841 | 0.85 |
| 0.55996 | 0.851 |
| 0.56152 | 0.851 |
| 0.56308 | 0.851 |
| 0.56463 | 0.852 |
| 0.56619 | 0.852 |
| 0.56774 | 0.852 |
| 0.5693 | 0.852 |
| 0.57086 | 0.853 |
| 0.57241 | 0.853 |
| 0.57397 | 0.853 |
| 0.57553 | 0.854 |
| 0.57708 | 0.854 |
| 0.57864 | 0.854 |
| 0.58019 | 0.854 |
| 0.58175 | 0.855 |
| 0.58331 | 0.855 |
| 0.58486 | 0.855 |
| 0.58642 | 0.855 |
| 0.58797 | 0.856 |
| 0.58953 | 0.856 |
| 0.59109 | 0.856 |
| 0.59264 | 0.857 |
| 0.5942 | 0.857 |
| 0.59576 | 0.857 |
| 0.59731 | 0.857 |
| 0.59887 | 0.858 |
| 0.60042 | 0.858 |
| 0.60198 | 0.858 |
| 0.60354 | 0.858 |
| 0.60509 | 0.859 |
| 0.60665 | 0.859 |
| 0.6082 | 0.859 |
| 0.60976 | 0.859 |
| 0.61132 | 0.86 |
| 0.61287 | 0.86 |
| 0.61443 | 0.86 |
| 0.61599 | 0.861 |
| 0.61754 | 0.861 |
| 0.6191 | 0.861 |
| 0.62065 | 0.861 |
| 0.62221 | 0.862 |
| 0.62377 | 0.862 |
| 0.62532 | 0.862 |
| 0.62688 | 0.862 |
| 0.62843 | 0.863 |
| 0.62999 | 0.863 |
| 0.63155 | 0.863 |
| 0.6331 | 0.863 |
| 0.63466 | 0.863 |
| 0.63622 | 0.864 |
| 0.63777 | 0.864 |
| 0.63933 | 0.864 |
| 0.64088 | 0.864 |
| 0.64244 | 0.865 |
| 0.644 | 0.865 |
| 0.64555 | 0.865 |
| 0.64711 | 0.865 |
| 0.64866 | 0.866 |
| 0.65022 | 0.866 |
| 0.65178 | 0.866 |
| 0.65333 | 0.866 |
| 0.65489 | 0.866 |
| 0.65645 | 0.867 |
| 0.658 | 0.867 |
| 0.65956 | 0.867 |
| 0.66111 | 0.867 |
| 0.66267 | 0.867 |
| 0.66423 | 0.868 |
| 0.66578 | 0.868 |
| 0.66734 | 0.868 |
| 0.66889 | 0.868 |
| 0.67045 | 0.869 |
| 0.67201 | 0.869 |
| 0.67356 | 0.869 |
| 0.67512 | 0.869 |
| 0.67668 | 0.869 |
| 0.67823 | 0.87 |
| 0.67979 | 0.87 |
| 0.68134 | 0.87 |
| 0.6829 | 0.87 |
| 0.68446 | 0.87 |
| 0.68601 | 0.871 |
| 0.68757 | 0.871 |
| 0.68912 | 0.871 |
| 0.69068 | 0.871 |
| 0.69224 | 0.872 |
| 0.69379 | 0.872 |
| 0.69535 | 0.872 |
| 0.69691 | 0.872 |
| 0.69846 | 0.872 |
| 0.70002 | 0.873 |
| 0.70157 | 0.873 |
| 0.70313 | 0.873 |
| 0.70469 | 0.873 |
| 0.70624 | 0.873 |
| 0.7078 | 0.874 |
| 0.70935 | 0.874 |
| 0.71091 | 0.874 |
| 0.71247 | 0.874 |
| 0.71402 | 0.874 |
| 0.71558 | 0.875 |
| 0.71714 | 0.875 |
| 0.71869 | 0.875 |
| 0.72025 | 0.875 |
| 0.7218 | 0.875 |
| 0.72336 | 0.875 |
| 0.72492 | 0.876 |
| 0.72647 | 0.876 |
| 0.72803 | 0.876 |
| 0.72958 | 0.876 |
| 0.73114 | 0.876 |
| 0.7327 | 0.876 |
| 0.73425 | 0.877 |
| 0.73581 | 0.877 |
| 0.73737 | 0.877 |
| 0.73892 | 0.877 |
| 0.74048 | 0.877 |
| 0.74203 | 0.878 |
| 0.74359 | 0.878 |
| 0.74515 | 0.878 |
| 0.7467 | 0.878 |
| 0.74826 | 0.878 |
| 0.74981 | 0.878 |
| 0.75137 | 0.879 |
| 0.75293 | 0.879 |
| 0.75448 | 0.879 |
| 0.75604 | 0.879 |
| 0.7576 | 0.879 |
| 0.75915 | 0.879 |
| 0.76071 | 0.88 |
| 0.76226 | 0.88 |
| 0.76382 | 0.88 |
| 0.76538 | 0.88 |
| 0.76693 | 0.88 |
| 0.76849 | 0.88 |
| 0.77005 | 0.881 |
| 0.7716 | 0.881 |
| 0.77316 | 0.881 |
| 0.77471 | 0.881 |
| 0.77627 | 0.881 |
| 0.77783 | 0.881 |
| 0.77938 | 0.882 |
| 0.78094 | 0.882 |
| 0.78249 | 0.882 |
| 0.78405 | 0.882 |
| 0.78561 | 0.882 |
| 0.78716 | 0.882 |
| 0.78872 | 0.882 |
| 0.79028 | 0.883 |
| 0.79183 | 0.883 |
| 0.79339 | 0.883 |
| 0.79494 | 0.883 |
| 0.7965 | 0.883 |
| 0.79806 | 0.883 |
| 0.79961 | 0.884 |
| 0.80117 | 0.884 |
| 0.80272 | 0.884 |
| 0.80428 | 0.884 |
| 0.80584 | 0.884 |
| 0.80739 | 0.884 |
| 0.80895 | 0.884 |
| 0.81051 | 0.885 |
| 0.81206 | 0.885 |
| 0.81362 | 0.885 |
| 0.81517 | 0.885 |
| 0.81673 | 0.885 |
| 0.81829 | 0.885 |
| 0.81984 | 0.886 |
| 0.8214 | 0.886 |
| 0.82295 | 0.886 |
| 0.82451 | 0.886 |
| 0.82607 | 0.886 |
| 0.82762 | 0.886 |
| 0.82918 | 0.886 |
| 0.83074 | 0.887 |
| 0.83229 | 0.887 |
| 0.83385 | 0.887 |
| 0.8354 | 0.887 |
| 0.83696 | 0.887 |
| 0.83852 | 0.887 |
| 0.84007 | 0.888 |
| 0.84163 | 0.888 |
| 0.84318 | 0.888 |
| 0.84474 | 0.888 |
| 0.8463 | 0.888 |
| 0.84785 | 0.888 |
| 0.84941 | 0.888 |
| 0.85097 | 0.888 |
| 0.85252 | 0.889 |
| 0.85408 | 0.889 |
| 0.85563 | 0.889 |
| 0.85719 | 0.889 |
| 0.85875 | 0.889 |
| 0.8603 | 0.889 |
| 0.86186 | 0.889 |
| 0.86341 | 0.89 |
| 0.86497 | 0.89 |
| 0.86653 | 0.89 |
| 0.86808 | 0.89 |
| 0.86964 | 0.89 |
| 0.8712 | 0.89 |
| 0.87275 | 0.89 |
| 0.87431 | 0.89 |
| 0.87586 | 0.891 |
| 0.87742 | 0.891 |
| 0.87898 | 0.891 |
| 0.88053 | 0.891 |
| 0.88209 | 0.891 |
| 0.88364 | 0.891 |
| 0.8852 | 0.891 |
| 0.88676 | 0.892 |
| 0.88831 | 0.892 |
| 0.88987 | 0.892 |
| 0.89143 | 0.892 |
| 0.89298 | 0.892 |
| 0.89454 | 0.892 |
| 0.89609 | 0.892 |
| 0.89765 | 0.893 |
| 0.89921 | 0.893 |
| 0.90076 | 0.893 |
| 0.90232 | 0.893 |
| 0.90387 | 0.893 |
| 0.90543 | 0.893 |
| 0.90699 | 0.893 |
| 0.90854 | 0.894 |
| 0.9101 | 0.894 |
| 0.91166 | 0.894 |
| 0.91321 | 0.894 |
| 0.91477 | 0.894 |
| 0.91632 | 0.894 |
| 0.91788 | 0.894 |
| 0.91944 | 0.894 |
| 0.92099 | 0.894 |
| 0.92255 | 0.895 |
| 0.9241 | 0.895 |
| 0.92566 | 0.895 |
| 0.92722 | 0.895 |
| 0.92877 | 0.895 |
| 0.93033 | 0.895 |
| 0.93189 | 0.895 |
| 0.93344 | 0.895 |
| 0.935 | 0.896 |
| 0.93655 | 0.896 |
| 0.93811 | 0.896 |
| 0.93967 | 0.896 |
| 0.94122 | 0.896 |
| 0.94278 | 0.896 |
| 0.94433 | 0.896 |
| 0.94589 | 0.896 |
| 0.94745 | 0.896 |
| 0.949 | 0.897 |
| 0.95056 | 0.897 |
| 0.95212 | 0.897 |
| 0.95367 | 0.897 |
| 0.95523 | 0.897 |
| 0.95678 | 0.897 |
| 0.95834 | 0.897 |
| 0.9599 | 0.897 |
| 0.96145 | 0.898 |
| 0.96301 | 0.898 |
| 0.96456 | 0.898 |
| 0.96612 | 0.898 |
| 0.96768 | 0.898 |
| 0.96923 | 0.898 |
| 0.97079 | 0.898 |
| 0.97235 | 0.898 |
| 0.9739 | 0.898 |
| 0.97546 | 0.899 |
| 0.97701 | 0.899 |
| 0.97857 | 0.899 |
| 0.98013 | 0.899 |
| 0.98168 | 0.899 |
| 0.98324 | 0.899 |
| 0.98479 | 0.899 |
| 0.98635 | 0.899 |
| 0.98791 | 0.9 |
| 0.98946 | 0.9 |
| 0.99102 | 0.9 |
| 0.99258 | 0.9 |
| 0.99413 | 0.9 |
| 0.99569 | 0.9 |
| 0.99724 | 0.9 |
| 0.9988 | 0.9 |
| 1.00036 | 0.9 |
| 1.00191 | 0.9 |
| 1.00347 | 0.901 |
| 1.00502 | 0.901 |
| 1.00658 | 0.901 |
| 1.00814 | 0.901 |
| 1.00969 | 0.901 |
| 1.01125 | 0.901 |
| 1.01281 | 0.901 |
| 1.01436 | 0.901 |
| 1.01592 | 0.901 |
| 1.01747 | 0.902 |
| 1.01903 | 0.902 |
| 1.02059 | 0.902 |
| 1.02214 | 0.902 |
| 1.0237 | 0.902 |
| 1.02525 | 0.902 |
| 1.02681 | 0.902 |
| 1.02837 | 0.902 |
| 1.02992 | 0.902 |
| 1.03148 | 0.902 |
| 1.03304 | 0.903 |
| 1.03459 | 0.903 |
| 1.03615 | 0.903 |
| 1.0377 | 0.903 |
| 1.03926 | 0.903 |
| 1.04082 | 0.903 |
| 1.04237 | 0.903 |
| 1.04393 | 0.903 |
| 1.04548 | 0.903 |
| 1.04704 | 0.904 |
| 1.0486 | 0.904 |
| 1.05015 | 0.904 |
| 1.05171 | 0.904 |
| 1.05327 | 0.904 |
| 1.05482 | 0.904 |
| 1.05638 | 0.904 |
| 1.05793 | 0.904 |
| 1.05949 | 0.904 |
| 1.06105 | 0.904 |
| 1.0626 | 0.905 |
| 1.06416 | 0.905 |
| 1.06571 | 0.905 |
| 1.06727 | 0.905 |
| 1.06883 | 0.905 |
| 1.07038 | 0.905 |
| 1.07194 | 0.905 |
| 1.0735 | 0.905 |
| 1.07505 | 0.905 |
| 1.07661 | 0.905 |
| 1.07816 | 0.906 |
| 1.07972 | 0.906 |
| 1.08128 | 0.906 |
| 1.08283 | 0.906 |
| 1.08439 | 0.906 |
| 1.08594 | 0.906 |
| 1.0875 | 0.906 |
| 1.08906 | 0.906 |
| 1.09061 | 0.906 |
| 1.09217 | 0.906 |
| 1.09373 | 0.907 |
| 1.09528 | 0.907 |
| 1.09684 | 0.907 |
| 1.09839 | 0.907 |
| 1.09995 | 0.907 |
| 1.10151 | 0.907 |
| 1.10306 | 0.907 |
| 1.10462 | 0.907 |
| 1.10617 | 0.907 |
| 1.10773 | 0.907 |
| 1.10929 | 0.908 |
| 1.11084 | 0.908 |
| 1.1124 | 0.908 |
| 1.11396 | 0.908 |
| 1.11551 | 0.908 |
| 1.11707 | 0.908 |
| 1.11862 | 0.908 |
| 1.12018 | 0.908 |
| 1.12174 | 0.908 |
| 1.12329 | 0.908 |
| 1.12485 | 0.908 |
| 1.1264 | 0.909 |
| 1.12796 | 0.909 |
| 1.12952 | 0.909 |
| 1.13107 | 0.909 |
| 1.13263 | 0.909 |
| 1.13419 | 0.909 |
| 1.13574 | 0.909 |
| 1.1373 | 0.909 |
| 1.13885 | 0.909 |
| 1.14041 | 0.909 |
| 1.14197 | 0.91 |
| 1.14352 | 0.91 |
| 1.14508 | 0.91 |
| 1.14663 | 0.91 |
| 1.14819 | 0.91 |
| 1.14975 | 0.91 |
| 1.1513 | 0.91 |
| 1.15286 | 0.91 |
| 1.15442 | 0.91 |
| 1.15597 | 0.91 |
| 1.15753 | 0.91 |
| 1.15908 | 0.911 |
| 1.16064 | 0.911 |
| 1.1622 | 0.911 |
| 1.16375 | 0.911 |
| 1.16531 | 0.911 |
| 1.16686 | 0.911 |
| 1.16842 | 0.911 |
| 1.16998 | 0.911 |
| 1.17153 | 0.911 |
| 1.17309 | 0.911 |
| 1.17465 | 0.912 |
| 1.1762 | 0.912 |
| 1.17776 | 0.912 |
| 1.17931 | 0.912 |
| 1.18087 | 0.912 |
| 1.18243 | 0.912 |
| 1.18398 | 0.912 |
| 1.18554 | 0.912 |
| 1.18709 | 0.912 |
| 1.18865 | 0.912 |
| 1.19021 | 0.912 |
| 1.19176 | 0.912 |
| 1.19332 | 0.913 |
| 1.19488 | 0.913 |
| 1.19643 | 0.913 |
| 1.19799 | 0.913 |
| 1.19954 | 0.913 |
| 1.2011 | 0.913 |
| 1.20266 | 0.913 |
| 1.20421 | 0.913 |
| 1.20577 | 0.913 |
| 1.20733 | 0.913 |
| 1.20888 | 0.913 |
| 1.21044 | 0.914 |
| 1.21199 | 0.914 |
| 1.21355 | 0.914 |
| 1.21511 | 0.914 |
| 1.21666 | 0.914 |
| 1.21822 | 0.914 |
| 1.21977 | 0.914 |
| 1.22133 | 0.914 |
| 1.22289 | 0.914 |
| 1.22444 | 0.914 |
| 1.226 | 0.914 |
| 1.22756 | 0.914 |
| 1.22911 | 0.915 |
| 1.23067 | 0.915 |
| 1.23222 | 0.915 |
| 1.23378 | 0.915 |
| 1.23534 | 0.915 |
| 1.23689 | 0.915 |
| 1.23845 | 0.915 |
| 1.24 | 0.915 |
| 1.24156 | 0.915 |
| 1.24312 | 0.915 |
| 1.24467 | 0.915 |
| 1.24623 | 0.916 |
| 1.24779 | 0.916 |
| 1.24934 | 0.916 |
| 1.2509 | 0.916 |
| 1.25245 | 0.916 |
| 1.25401 | 0.916 |
| 1.25557 | 0.916 |
| 1.25712 | 0.916 |
| 1.25868 | 0.916 |
| 1.26023 | 0.916 |
| 1.26179 | 0.916 |
| 1.26335 | 0.916 |
| 1.2649 | 0.916 |
| 1.26646 | 0.917 |
| 1.26802 | 0.917 |
| 1.26957 | 0.917 |
| 1.27113 | 0.917 |
| 1.27268 | 0.917 |
| 1.27424 | 0.917 |
| 1.2758 | 0.917 |
| 1.27735 | 0.917 |
| 1.27891 | 0.917 |
| 1.28046 | 0.917 |
| 1.28202 | 0.917 |
| 1.28358 | 0.918 |
| 1.28513 | 0.918 |
| 1.28669 | 0.918 |
| 1.28825 | 0.918 |
| 1.2898 | 0.918 |
| 1.29136 | 0.918 |
| 1.29291 | 0.918 |
| 1.29447 | 0.918 |
| 1.29603 | 0.918 |
| 1.29758 | 0.918 |
| 1.29914 | 0.918 |
| 1.30069 | 0.919 |
| 1.30225 | 0.919 |
| 1.30381 | 0.919 |
| 1.30536 | 0.919 |
| 1.30692 | 0.919 |
| 1.30848 | 0.919 |
| 1.31003 | 0.919 |
| 1.31159 | 0.919 |
| 1.31314 | 0.919 |
| 1.3147 | 0.919 |
| 1.31626 | 0.919 |
| 1.31781 | 0.919 |
| 1.31937 | 0.919 |
| 1.32092 | 0.92 |
| 1.32248 | 0.92 |
| 1.32404 | 0.92 |
| 1.32559 | 0.92 |
| 1.32715 | 0.92 |
| 1.32871 | 0.92 |
| 1.33026 | 0.92 |
| 1.33182 | 0.92 |
| 1.33337 | 0.92 |
| 1.33493 | 0.92 |
| 1.33649 | 0.92 |
| 1.33804 | 0.92 |
| 1.3396 | 0.921 |
| 1.34115 | 0.921 |
| 1.34271 | 0.921 |
| 1.34427 | 0.921 |
| 1.34582 | 0.921 |
| 1.34738 | 0.921 |
| 1.34894 | 0.921 |
| 1.35049 | 0.921 |
| 1.35205 | 0.921 |
| 1.3536 | 0.921 |
| 1.35516 | 0.921 |
| 1.35672 | 0.921 |
| 1.35827 | 0.922 |
| 1.35983 | 0.922 |
| 1.36138 | 0.922 |
| 1.36294 | 0.922 |
| 1.3645 | 0.922 |
| 1.36605 | 0.922 |
| 1.36761 | 0.922 |
| 1.36917 | 0.922 |
| 1.37072 | 0.922 |
| 1.37228 | 0.922 |
| 1.37383 | 0.922 |
| 1.37539 | 0.922 |
| 1.37695 | 0.922 |
| 1.3785 | 0.923 |
| 1.38006 | 0.923 |
| 1.38161 | 0.923 |
| 1.38317 | 0.923 |
| 1.38473 | 0.923 |
| 1.38628 | 0.923 |
| 1.38784 | 0.923 |
| 1.3894 | 0.923 |
| 1.39095 | 0.923 |
| 1.39251 | 0.923 |
| 1.39406 | 0.923 |
| 1.39562 | 0.923 |
| 1.39718 | 0.923 |
| 1.39873 | 0.924 |
| 1.40029 | 0.924 |
| 1.40184 | 0.924 |
| 1.4034 | 0.924 |
| 1.40496 | 0.924 |
| 1.40651 | 0.924 |
| 1.40807 | 0.924 |
| 1.40963 | 0.924 |
| 1.41118 | 0.924 |
| 1.41274 | 0.924 |
| 1.41429 | 0.924 |
| 1.41585 | 0.924 |
| 1.41741 | 0.924 |
| 1.41896 | 0.925 |
| 1.42052 | 0.925 |
| 1.42207 | 0.925 |
| 1.42363 | 0.925 |
| 1.42519 | 0.925 |
| 1.42674 | 0.925 |
| 1.4283 | 0.925 |
| 1.42986 | 0.925 |
| 1.43141 | 0.925 |
| 1.43297 | 0.925 |
| 1.43452 | 0.925 |
| 1.43608 | 0.925 |
| 1.43764 | 0.925 |
| 1.43919 | 0.926 |
| 1.44075 | 0.926 |
| 1.4423 | 0.926 |
| 1.44386 | 0.926 |
| 1.44542 | 0.926 |
| 1.44697 | 0.926 |
| 1.44853 | 0.926 |
| 1.45009 | 0.926 |
| 1.45164 | 0.926 |
| 1.4532 | 0.926 |
| 1.45475 | 0.926 |
| 1.45631 | 0.926 |
| 1.45787 | 0.926 |
| 1.45942 | 0.927 |
| 1.46098 | 0.927 |
| 1.46253 | 0.927 |
| 1.46409 | 0.927 |
| 1.46565 | 0.927 |
| 1.4672 | 0.927 |
| 1.46876 | 0.927 |
| 1.47032 | 0.927 |
| 1.47187 | 0.927 |
| 1.47343 | 0.927 |
| 1.47498 | 0.927 |
| 1.47654 | 0.927 |
| 1.4781 | 0.927 |
| 1.47965 | 0.927 |
| 1.48121 | 0.928 |
| 1.48276 | 0.928 |
| 1.48432 | 0.928 |
| 1.48588 | 0.928 |
| 1.48743 | 0.928 |
| 1.48899 | 0.928 |
| 1.49055 | 0.928 |
| 1.4921 | 0.928 |
| 1.49366 | 0.928 |
| 1.49521 | 0.928 |
| 1.49677 | 0.928 |
| 1.49833 | 0.928 |
| 1.49988 | 0.928 |
| 1.50144 | 0.928 |
| 1.50299 | 0.929 |
| 1.50455 | 0.929 |
| 1.50611 | 0.929 |
| 1.50766 | 0.929 |
| 1.50922 | 0.929 |
| 1.51078 | 0.929 |
| 1.51233 | 0.929 |
| 1.51389 | 0.929 |
| 1.51544 | 0.929 |
| 1.517 | 0.929 |
| 1.51856 | 0.929 |
| 1.52011 | 0.929 |
| 1.52167 | 0.929 |
| 1.52322 | 0.93 |
| 1.52478 | 0.93 |
| 1.52634 | 0.93 |
| 1.52789 | 0.93 |
| 1.52945 | 0.93 |
| 1.53101 | 0.93 |
| 1.53256 | 0.93 |
| 1.53412 | 0.93 |
| 1.53567 | 0.93 |
| 1.53723 | 0.93 |
| 1.53879 | 0.93 |
| 1.54034 | 0.93 |
| 1.5419 | 0.93 |
| 1.54345 | 0.93 |
| 1.54501 | 0.93 |
| 1.54657 | 0.931 |
| 1.54812 | 0.931 |
| 1.54968 | 0.931 |
| 1.55124 | 0.931 |
| 1.55279 | 0.931 |
| 1.55435 | 0.931 |
| 1.5559 | 0.931 |
| 1.55746 | 0.931 |
| 1.55902 | 0.931 |
| 1.56057 | 0.931 |
| 1.56213 | 0.931 |
| 1.56368 | 0.931 |
| 1.56524 | 0.931 |
| 1.5668 | 0.932 |
| 1.56835 | 0.932 |
| 1.56991 | 0.932 |
| 1.57147 | 0.932 |
| 1.57302 | 0.932 |
| 1.57458 | 0.932 |
| 1.57613 | 0.932 |
| 1.57769 | 0.932 |
| 1.57925 | 0.932 |
| 1.5808 | 0.932 |
| 1.58236 | 0.932 |
| 1.58391 | 0.932 |
| 1.58547 | 0.932 |
| 1.58703 | 0.932 |
| 1.58858 | 0.932 |
| 1.59014 | 0.933 |
| 1.5917 | 0.933 |
| 1.59325 | 0.933 |
| 1.59481 | 0.933 |
| 1.59636 | 0.933 |
| 1.59792 | 0.933 |
| 1.59948 | 0.933 |
| 1.60103 | 0.933 |
| 1.60259 | 0.933 |
| 1.60414 | 0.933 |
| 1.6057 | 0.933 |
| 1.60726 | 0.933 |
| 1.60881 | 0.933 |
| 1.61037 | 0.933 |
| 1.61193 | 0.933 |
| 1.61348 | 0.934 |
| 1.61504 | 0.934 |
| 1.61659 | 0.934 |
| 1.61815 | 0.934 |
| 1.61971 | 0.934 |
| 1.62126 | 0.934 |
| 1.62282 | 0.934 |
| 1.62438 | 0.934 |
| 1.62593 | 0.934 |
| 1.62749 | 0.934 |
| 1.62904 | 0.934 |
| 1.6306 | 0.934 |
| 1.63216 | 0.934 |
| 1.63371 | 0.934 |
| 1.63527 | 0.934 |
| 1.63682 | 0.934 |
| 1.63838 | 0.935 |
| 1.63994 | 0.935 |
| 1.64149 | 0.935 |
| 1.64305 | 0.935 |
| 1.64461 | 0.935 |
| 1.64616 | 0.935 |
| 1.64772 | 0.935 |
| 1.64927 | 0.935 |
| 1.65083 | 0.935 |
| 1.65239 | 0.935 |
| 1.65394 | 0.935 |
| 1.6555 | 0.935 |
| 1.65705 | 0.935 |
| 1.65861 | 0.935 |
| 1.66017 | 0.935 |
| 1.66172 | 0.936 |
| 1.66328 | 0.936 |
| 1.66484 | 0.936 |
| 1.66639 | 0.936 |
| 1.66795 | 0.936 |
| 1.6695 | 0.936 |
| 1.67106 | 0.936 |
| 1.67262 | 0.936 |
| 1.67417 | 0.936 |
| 1.67573 | 0.936 |
| 1.67728 | 0.936 |
| 1.67884 | 0.936 |
| 1.6804 | 0.936 |
| 1.68195 | 0.936 |
| 1.68351 | 0.936 |
| 1.68507 | 0.936 |
| 1.68662 | 0.937 |
| 1.68818 | 0.937 |
| 1.68973 | 0.937 |
| 1.69129 | 0.937 |
| 1.69285 | 0.937 |
| 1.6944 | 0.937 |
| 1.69596 | 0.937 |
| 1.69751 | 0.937 |
| 1.69907 | 0.937 |
| 1.70063 | 0.937 |
| 1.70218 | 0.937 |
| 1.70374 | 0.937 |
| 1.7053 | 0.937 |
| 1.70685 | 0.937 |
| 1.70841 | 0.937 |
| 1.70996 | 0.938 |
| 1.71152 | 0.938 |
| 1.71308 | 0.938 |
| 1.71463 | 0.938 |
| 1.71619 | 0.938 |
| 1.71774 | 0.938 |
| 1.7193 | 0.938 |
| 1.72086 | 0.938 |
| 1.72241 | 0.938 |
| 1.72397 | 0.938 |
| 1.72553 | 0.938 |
| 1.72708 | 0.938 |
| 1.72864 | 0.938 |
| 1.73019 | 0.938 |
| 1.73175 | 0.938 |
| 1.73331 | 0.939 |
| 1.73486 | 0.939 |
| 1.73642 | 0.939 |
| 1.73797 | 0.939 |
| 1.73953 | 0.939 |
| 1.74109 | 0.939 |
| 1.74264 | 0.939 |
| 1.7442 | 0.939 |
| 1.74576 | 0.939 |
| 1.74731 | 0.939 |
| 1.74887 | 0.939 |
| 1.75042 | 0.939 |
| 1.75198 | 0.939 |
| 1.75354 | 0.939 |
| 1.75509 | 0.939 |
| 1.75665 | 0.939 |
| 1.7582 | 0.939 |
| 1.75976 | 0.94 |
| 1.76132 | 0.94 |
| 1.76287 | 0.94 |
| 1.76443 | 0.94 |
| 1.76599 | 0.94 |
| 1.76754 | 0.94 |
| 1.7691 | 0.94 |
| 1.77065 | 0.94 |
| 1.77221 | 0.94 |
| 1.77377 | 0.94 |
| 1.77532 | 0.94 |
| 1.77688 | 0.94 |
| 1.77843 | 0.94 |
| 1.77999 | 0.94 |
| 1.78155 | 0.94 |
| 1.7831 | 0.94 |
| 1.78466 | 0.941 |
| 1.78622 | 0.941 |
| 1.78777 | 0.941 |
| 1.78933 | 0.941 |
| 1.79088 | 0.941 |
| 1.79244 | 0.941 |
| 1.794 | 0.941 |
| 1.79555 | 0.941 |
| 1.79711 | 0.941 |
| 1.79866 | 0.941 |
| 1.80022 | 0.941 |
| 1.80178 | 0.941 |
| 1.80333 | 0.941 |
| 1.80489 | 0.941 |
| 1.80645 | 0.941 |
| 1.808 | 0.941 |
| 1.80956 | 0.941 |
| 1.81111 | 0.942 |
| 1.81267 | 0.942 |
| 1.81423 | 0.942 |
| 1.81578 | 0.942 |
| 1.81734 | 0.942 |
| 1.81889 | 0.942 |
| 1.82045 | 0.942 |
| 1.82201 | 0.942 |
| 1.82356 | 0.942 |
| 1.82512 | 0.942 |
| 1.82668 | 0.942 |
| 1.82823 | 0.942 |
| 1.82979 | 0.942 |
| 1.83134 | 0.942 |
| 1.8329 | 0.942 |
| 1.83446 | 0.942 |
| 1.83601 | 0.943 |
| 1.83757 | 0.943 |
| 1.83912 | 0.943 |
| 1.84068 | 0.943 |
| 1.84224 | 0.943 |
| 1.84379 | 0.943 |
| 1.84535 | 0.943 |
| 1.84691 | 0.943 |
| 1.84846 | 0.943 |
| 1.85002 | 0.943 |
| 1.85157 | 0.943 |
| 1.85313 | 0.943 |
| 1.85469 | 0.943 |
| 1.85624 | 0.943 |
| 1.8578 | 0.943 |
| 1.85935 | 0.943 |
| 1.86091 | 0.944 |
| 1.86247 | 0.944 |
| 1.86402 | 0.944 |
| 1.86558 | 0.944 |
| 1.86714 | 0.944 |
| 1.86869 | 0.944 |
| 1.87025 | 0.944 |
| 1.8718 | 0.944 |
| 1.87336 | 0.944 |
| 1.87492 | 0.944 |
| 1.87647 | 0.944 |
| 1.87803 | 0.944 |
| 1.87958 | 0.944 |
| 1.88114 | 0.944 |
| 1.8827 | 0.944 |
| 1.88425 | 0.944 |
| 1.88581 | 0.944 |
| 1.88737 | 0.944 |
| 1.88892 | 0.945 |
| 1.89048 | 0.945 |
| 1.89203 | 0.945 |
| 1.89359 | 0.945 |
| 1.89515 | 0.945 |
| 1.8967 | 0.945 |
| 1.89826 | 0.945 |
| 1.89981 | 0.945 |
| 1.90137 | 0.945 |
| 1.90293 | 0.945 |
| 1.90448 | 0.945 |
| 1.90604 | 0.945 |
| 1.9076 | 0.945 |
| 1.90915 | 0.945 |
| 1.91071 | 0.945 |
| 1.91226 | 0.945 |
| 1.91382 | 0.945 |
| 1.91538 | 0.945 |
| 1.91693 | 0.946 |
| 1.91849 | 0.946 |
| 1.92004 | 0.946 |
| 1.9216 | 0.946 |
| 1.92316 | 0.946 |
| 1.92471 | 0.946 |
| 1.92627 | 0.946 |
| 1.92783 | 0.946 |
| 1.92938 | 0.946 |
| 1.93094 | 0.946 |
| 1.93249 | 0.946 |
| 1.93405 | 0.946 |
| 1.93561 | 0.946 |
| 1.93716 | 0.946 |
| 1.93872 | 0.946 |
| 1.94027 | 0.946 |
| 1.94183 | 0.946 |
| 1.94339 | 0.946 |
| 1.94494 | 0.946 |
| 1.9465 | 0.947 |
| 1.94806 | 0.947 |
| 1.94961 | 0.947 |
| 1.95117 | 0.947 |
| 1.95272 | 0.947 |
| 1.95428 | 0.947 |
| 1.95584 | 0.947 |
| 1.95739 | 0.947 |
| 1.95895 | 0.947 |
| 1.9605 | 0.947 |
| 1.96206 | 0.947 |
| 1.96362 | 0.947 |
| 1.96517 | 0.947 |
| 1.96673 | 0.947 |
| 1.96829 | 0.947 |
| 1.96984 | 0.947 |
| 1.9714 | 0.947 |
| 1.97295 | 0.947 |
| 1.97451 | 0.948 |
| 1.97607 | 0.948 |
| 1.97762 | 0.948 |
| 1.97918 | 0.948 |
| 1.98073 | 0.948 |
| 1.98229 | 0.948 |
| 1.98385 | 0.948 |
| 1.9854 | 0.948 |
| 1.98696 | 0.948 |
| 1.98852 | 0.948 |
| 1.99007 | 0.948 |
| 1.99163 | 0.948 |
| 1.99318 | 0.948 |
| 1.99474 | 0.948 |
| 1.9963 | 0.948 |
| 1.99785 | 0.948 |
| 1.99941 | 0.948 |
| 2.00096 | 0.948 |
| 2.00252 | 0.949 |
| 2.00408 | 0.949 |
| 2.00563 | 0.949 |
| 2.00719 | 0.949 |
| 2.00875 | 0.949 |
| 2.0103 | 0.949 |
| 2.01186 | 0.949 |
| 2.01341 | 0.949 |
| 2.01497 | 0.949 |
| 2.01653 | 0.949 |
| 2.01808 | 0.949 |
| 2.01964 | 0.949 |
| 2.02119 | 0.949 |
| 2.02275 | 0.949 |
| 2.02431 | 0.949 |
| 2.02586 | 0.949 |
| 2.02742 | 0.949 |
| 2.02898 | 0.949 |
| 2.03053 | 0.95 |
| 2.03209 | 0.95 |
| 2.03364 | 0.95 |
| 2.0352 | 0.95 |
| 2.03676 | 0.95 |
| 2.03831 | 0.95 |
| 2.03987 | 0.95 |
| 2.04142 | 0.95 |
| 2.04298 | 0.95 |
| 2.04454 | 0.95 |
| 2.04609 | 0.95 |
| 2.04765 | 0.95 |
| 2.04921 | 0.95 |
| 2.05076 | 0.95 |
| 2.05232 | 0.95 |
| 2.05387 | 0.95 |
| 2.05543 | 0.95 |
| 2.05699 | 0.95 |
| 2.05854 | 0.95 |
| 2.0601 | 0.95 |
| 2.06166 | 0.951 |
| 2.06321 | 0.951 |
| 2.06477 | 0.951 |
| 2.06632 | 0.951 |
| 2.06788 | 0.951 |
| 2.06944 | 0.951 |
| 2.07099 | 0.951 |
| 2.07255 | 0.951 |
| 2.0741 | 0.951 |
| 2.07566 | 0.951 |
| 2.07722 | 0.951 |
| 2.07877 | 0.951 |
| 2.08033 | 0.951 |
| 2.08189 | 0.951 |
| 2.08344 | 0.951 |
| 2.085 | 0.951 |
| 2.08655 | 0.951 |
| 2.08811 | 0.951 |
| 2.08967 | 0.951 |
| 2.09122 | 0.951 |
| 2.09278 | 0.951 |
| 2.09433 | 0.952 |
| 2.09589 | 0.952 |
| 2.09745 | 0.952 |
| 2.099 | 0.952 |
| 2.10056 | 0.952 |
| 2.10212 | 0.952 |
| 2.10367 | 0.952 |
| 2.10523 | 0.952 |
| 2.10678 | 0.952 |
| 2.10834 | 0.952 |
| 2.1099 | 0.952 |
| 2.11145 | 0.952 |
| 2.11301 | 0.952 |
| 2.11456 | 0.952 |
| 2.11612 | 0.952 |
| 2.11768 | 0.952 |
| 2.11923 | 0.952 |
| 2.12079 | 0.952 |
| 2.12235 | 0.952 |
| 2.1239 | 0.952 |
| 2.12546 | 0.953 |
| 2.12701 | 0.953 |
| 2.12857 | 0.953 |
| 2.13013 | 0.953 |
| 2.13168 | 0.953 |
| 2.13324 | 0.953 |
| 2.13479 | 0.953 |
| 2.13635 | 0.953 |
| 2.13791 | 0.953 |
| 2.13946 | 0.953 |
| 2.14102 | 0.953 |
| 2.14258 | 0.953 |
| 2.14413 | 0.953 |
| 2.14569 | 0.953 |
| 2.14724 | 0.953 |
| 2.1488 | 0.953 |
| 2.15036 | 0.953 |
| 2.15191 | 0.953 |
| 2.15347 | 0.953 |
| 2.15502 | 0.953 |
| 2.15658 | 0.954 |
| 2.15814 | 0.954 |
| 2.15969 | 0.954 |
| 2.16125 | 0.954 |
| 2.16281 | 0.954 |
| 2.16436 | 0.954 |
| 2.16592 | 0.954 |
| 2.16747 | 0.954 |
| 2.16903 | 0.954 |
| 2.17059 | 0.954 |
| 2.17214 | 0.954 |
| 2.1737 | 0.954 |
| 2.17525 | 0.954 |
| 2.17681 | 0.954 |
| 2.17837 | 0.954 |
| 2.17992 | 0.954 |
| 2.18148 | 0.954 |
| 2.18304 | 0.954 |
| 2.18459 | 0.954 |
| 2.18615 | 0.954 |
| 2.1877 | 0.954 |
| 2.18926 | 0.955 |
| 2.19082 | 0.955 |
| 2.19237 | 0.955 |
| 2.19393 | 0.955 |
| 2.19548 | 0.955 |
| 2.19704 | 0.955 |
| 2.1986 | 0.955 |
| 2.20015 | 0.955 |
| 2.20171 | 0.955 |
| 2.20327 | 0.955 |
| 2.20482 | 0.955 |
| 2.20638 | 0.955 |
| 2.20793 | 0.955 |
| 2.20949 | 0.955 |
| 2.21105 | 0.955 |
| 2.2126 | 0.955 |
| 2.21416 | 0.955 |
| 2.21571 | 0.955 |
| 2.21727 | 0.955 |
| 2.21883 | 0.955 |
| 2.22038 | 0.956 |
| 2.22194 | 0.956 |
| 2.2235 | 0.956 |
| 2.22505 | 0.956 |
| 2.22661 | 0.956 |
| 2.22816 | 0.956 |
| 2.22972 | 0.956 |
| 2.23128 | 0.956 |
| 2.23283 | 0.956 |
| 2.23439 | 0.956 |
| 2.23594 | 0.956 |
| 2.2375 | 0.956 |
| 2.23906 | 0.956 |
| 2.24061 | 0.956 |
| 2.24217 | 0.956 |
| 2.24373 | 0.956 |
| 2.24528 | 0.956 |
| 2.24684 | 0.956 |
| 2.24839 | 0.956 |
| 2.24995 | 0.956 |
| 2.25151 | 0.956 |
| 2.25306 | 0.957 |
| 2.25462 | 0.957 |
| 2.25617 | 0.957 |
| 2.25773 | 0.957 |
| 2.25929 | 0.957 |
| 2.26084 | 0.957 |
| 2.2624 | 0.957 |
| 2.26396 | 0.957 |
| 2.26551 | 0.957 |
| 2.26707 | 0.957 |
| 2.26862 | 0.957 |
| 2.27018 | 0.957 |
| 2.27174 | 0.957 |
| 2.27329 | 0.957 |
| 2.27485 | 0.957 |
| 2.2764 | 0.957 |
| 2.27796 | 0.957 |
| 2.27952 | 0.957 |
| 2.28107 | 0.957 |
| 2.28263 | 0.957 |
| 2.28419 | 0.958 |
| 2.28574 | 0.958 |
| 2.2873 | 0.958 |
| 2.28885 | 0.958 |
| 2.29041 | 0.958 |
| 2.29197 | 0.958 |
| 2.29352 | 0.958 |
| 2.29508 | 0.958 |
| 2.29663 | 0.958 |
| 2.29819 | 0.958 |
| 2.29975 | 0.958 |
| 2.3013 | 0.958 |
| 2.30286 | 0.958 |
| 2.30442 | 0.958 |
| 2.30597 | 0.958 |
| 2.30753 | 0.958 |
| 2.30908 | 0.958 |
| 2.31064 | 0.958 |
| 2.3122 | 0.958 |
| 2.31375 | 0.958 |
| 2.31531 | 0.958 |
| 2.31686 | 0.958 |
| 2.31842 | 0.959 |
| 2.31998 | 0.959 |
| 2.32153 | 0.959 |
| 2.32309 | 0.959 |
| 2.32465 | 0.959 |
| 2.3262 | 0.959 |
| 2.32776 | 0.959 |
| 2.32931 | 0.959 |
| 2.33087 | 0.959 |
| 2.33243 | 0.959 |
| 2.33398 | 0.959 |
| 2.33554 | 0.959 |
| 2.33709 | 0.959 |
| 2.33865 | 0.959 |
| 2.34021 | 0.959 |
| 2.34176 | 0.959 |
| 2.34332 | 0.959 |
| 2.34488 | 0.959 |
| 2.34643 | 0.959 |
| 2.34799 | 0.959 |
| 2.34954 | 0.959 |
| 2.3511 | 0.96 |
| 2.35266 | 0.96 |
| 2.35421 | 0.96 |
| 2.35577 | 0.96 |
| 2.35732 | 0.96 |
| 2.35888 | 0.96 |
| 2.36044 | 0.96 |
| 2.36199 | 0.96 |
| 2.36355 | 0.96 |
| 2.36511 | 0.96 |
| 2.36666 | 0.96 |
| 2.36822 | 0.96 |
| 2.36977 | 0.96 |
| 2.37133 | 0.96 |
| 2.37289 | 0.96 |
| 2.37444 | 0.96 |
| 2.376 | 0.96 |
| 2.37755 | 0.96 |
| 2.37911 | 0.96 |
| 2.38067 | 0.96 |
| 2.38222 | 0.96 |
| 2.38378 | 0.96 |
| 2.38534 | 0.961 |
| 2.38689 | 0.961 |
| 2.38845 | 0.961 |
| 2.39 | 0.961 |
| 2.39156 | 0.961 |
| 2.39312 | 0.961 |
| 2.39467 | 0.961 |
| 2.39623 | 0.961 |
| 2.39778 | 0.961 |
| 2.39934 | 0.961 |
| 2.4009 | 0.961 |
| 2.40245 | 0.961 |
| 2.40401 | 0.961 |
| 2.40557 | 0.961 |
| 2.40712 | 0.961 |
| 2.40868 | 0.961 |
| 2.41023 | 0.961 |
| 2.41179 | 0.961 |
| 2.41335 | 0.961 |
| 2.4149 | 0.961 |
| 2.41646 | 0.961 |
| 2.41801 | 0.961 |
| 2.41957 | 0.962 |
| 2.42113 | 0.962 |
| 2.42268 | 0.962 |
| 2.42424 | 0.962 |
| 2.4258 | 0.962 |
| 2.42735 | 0.962 |
| 2.42891 | 0.962 |
| 2.43046 | 0.962 |
| 2.43202 | 0.962 |
| 2.43358 | 0.962 |
| 2.43513 | 0.962 |
| 2.43669 | 0.962 |
| 2.43824 | 0.962 |
| 2.4398 | 0.962 |
| 2.44136 | 0.962 |
| 2.44291 | 0.962 |
| 2.44447 | 0.962 |
| 2.44603 | 0.962 |
| 2.44758 | 0.962 |
| 2.44914 | 0.962 |
| 2.45069 | 0.962 |
| 2.45225 | 0.962 |
| 2.45381 | 0.962 |
| 2.45536 | 0.963 |
| 2.45692 | 0.963 |
| 2.45847 | 0.963 |
| 2.46003 | 0.963 |
| 2.46159 | 0.963 |
| 2.46314 | 0.963 |
| 2.4647 | 0.963 |
| 2.46626 | 0.963 |
| 2.46781 | 0.963 |
| 2.46937 | 0.963 |
| 2.47092 | 0.963 |
| 2.47248 | 0.963 |
| 2.47404 | 0.963 |
| 2.47559 | 0.963 |
| 2.47715 | 0.963 |
| 2.47871 | 0.963 |
| 2.48026 | 0.963 |
| 2.48182 | 0.963 |
| 2.48337 | 0.963 |
| 2.48493 | 0.963 |
| 2.48649 | 0.963 |
| 2.48804 | 0.963 |
| 2.4896 | 0.963 |
| 2.49115 | 0.963 |
| 2.49271 | 0.963 |
| 2.49427 | 0.964 |
| 2.49582 | 0.964 |
| 2.49738 | 0.964 |
| 2.49894 | 0.964 |
| 2.50049 | 0.964 |
| 2.50205 | 0.964 |
| 2.5036 | 0.964 |
| 2.50516 | 0.964 |
| 2.50672 | 0.964 |
| 2.50827 | 0.964 |
| 2.50983 | 0.964 |
| 2.51138 | 0.964 |
| 2.51294 | 0.964 |
| 2.5145 | 0.964 |
| 2.51605 | 0.964 |
| 2.51761 | 0.964 |
| 2.51917 | 0.964 |
| 2.52072 | 0.964 |
| 2.52228 | 0.964 |
| 2.52383 | 0.964 |
| 2.52539 | 0.964 |
| 2.52695 | 0.964 |
| 2.5285 | 0.964 |
| 2.53006 | 0.965 |
| 2.53161 | 0.965 |
| 2.53317 | 0.965 |
| 2.53473 | 0.965 |
| 2.53628 | 0.965 |
| 2.53784 | 0.965 |
| 2.5394 | 0.965 |
| 2.54095 | 0.965 |
| 2.54251 | 0.965 |
| 2.54406 | 0.965 |
| 2.54562 | 0.965 |
| 2.54718 | 0.965 |
| 2.54873 | 0.965 |
| 2.55029 | 0.965 |
| 2.55184 | 0.965 |
| 2.5534 | 0.965 |
| 2.55496 | 0.965 |
| 2.55651 | 0.965 |
| 2.55807 | 0.965 |
| 2.55963 | 0.965 |
| 2.56118 | 0.965 |
| 2.56274 | 0.965 |
| 2.56429 | 0.965 |
| 2.56585 | 0.965 |
| 2.56741 | 0.965 |
| 2.56896 | 0.965 |
| 2.57052 | 0.965 |
| 2.57207 | 0.966 |
| 2.57363 | 0.966 |
| 2.57519 | 0.966 |
| 2.57674 | 0.966 |
| 2.5783 | 0.966 |
| 2.57986 | 0.966 |
| 2.58141 | 0.966 |
| 2.58297 | 0.966 |
| 2.58452 | 0.966 |
| 2.58608 | 0.966 |
| 2.58764 | 0.966 |
| 2.58919 | 0.966 |
| 2.59075 | 0.966 |
| 2.5923 | 0.966 |
| 2.59386 | 0.966 |
| 2.59542 | 0.966 |
| 2.59697 | 0.966 |
| 2.59853 | 0.966 |
| 2.60009 | 0.966 |
| 2.60164 | 0.966 |
| 2.6032 | 0.966 |
| 2.60475 | 0.966 |
| 2.60631 | 0.966 |
| 2.60787 | 0.966 |
| 2.60942 | 0.966 |
| 2.61098 | 0.967 |
| 2.61253 | 0.967 |
| 2.61409 | 0.967 |
| 2.61565 | 0.967 |
| 2.6172 | 0.967 |
| 2.61876 | 0.967 |
| 2.62032 | 0.967 |
| 2.62187 | 0.967 |
| 2.62343 | 0.967 |
| 2.62498 | 0.967 |
| 2.62654 | 0.967 |
| 2.6281 | 0.967 |
| 2.62965 | 0.967 |
| 2.63121 | 0.967 |
| 2.63276 | 0.967 |
| 2.63432 | 0.967 |
| 2.63588 | 0.967 |
| 2.63743 | 0.967 |
| 2.63899 | 0.967 |
| 2.64055 | 0.967 |
| 2.6421 | 0.967 |
| 2.64366 | 0.967 |
| 2.64521 | 0.967 |
| 2.64677 | 0.967 |
| 2.64833 | 0.968 |
| 2.64988 | 0.968 |
| 2.65144 | 0.968 |
| 2.65299 | 0.968 |
| 2.65455 | 0.968 |
| 2.65611 | 0.968 |
| 2.65766 | 0.968 |
| 2.65922 | 0.968 |
| 2.66078 | 0.968 |
| 2.66233 | 0.968 |
| 2.66389 | 0.968 |
| 2.66544 | 0.968 |
| 2.667 | 0.968 |
| 2.66856 | 0.968 |
| 2.67011 | 0.968 |
| 2.67167 | 0.968 |
| 2.67322 | 0.968 |
| 2.67478 | 0.968 |
| 2.67634 | 0.968 |
| 2.67789 | 0.968 |
| 2.67945 | 0.968 |
| 2.68101 | 0.968 |
| 2.68256 | 0.968 |
| 2.68412 | 0.968 |
| 2.68567 | 0.968 |
| 2.68723 | 0.968 |
| 2.68879 | 0.968 |
| 2.69034 | 0.969 |
| 2.6919 | 0.969 |
| 2.69345 | 0.969 |
| 2.69501 | 0.969 |
| 2.69657 | 0.969 |
| 2.69812 | 0.969 |
| 2.69968 | 0.969 |
| 2.70124 | 0.969 |
| 2.70279 | 0.969 |
| 2.70435 | 0.969 |
| 2.7059 | 0.969 |
| 2.70746 | 0.969 |
| 2.70902 | 0.969 |
| 2.71057 | 0.969 |
| 2.71213 | 0.969 |
| 2.71368 | 0.969 |
| 2.71524 | 0.969 |
| 2.7168 | 0.969 |
| 2.71835 | 0.969 |
| 2.71991 | 0.969 |
| 2.72147 | 0.969 |
| 2.72302 | 0.969 |
| 2.72458 | 0.969 |
| 2.72613 | 0.969 |
| 2.72769 | 0.969 |
| 2.72925 | 0.969 |
| 2.7308 | 0.969 |
| 2.73236 | 0.97 |
| 2.73391 | 0.97 |
| 2.73547 | 0.97 |
| 2.73703 | 0.97 |
| 2.73858 | 0.97 |
| 2.74014 | 0.97 |
| 2.7417 | 0.97 |
| 2.74325 | 0.97 |
| 2.74481 | 0.97 |
| 2.74636 | 0.97 |
| 2.74792 | 0.97 |
| 2.74948 | 0.97 |
| 2.75103 | 0.97 |
| 2.75259 | 0.97 |
| 2.75414 | 0.97 |
| 2.7557 | 0.97 |
| 2.75726 | 0.97 |
| 2.75881 | 0.97 |
| 2.76037 | 0.97 |
| 2.76193 | 0.97 |
| 2.76348 | 0.97 |
| 2.76504 | 0.97 |
| 2.76659 | 0.97 |
| 2.76815 | 0.97 |
| 2.76971 | 0.97 |
| 2.77126 | 0.97 |
| 2.77282 | 0.971 |
| 2.77437 | 0.971 |
| 2.77593 | 0.971 |
| 2.77749 | 0.971 |
| 2.77904 | 0.971 |
| 2.7806 | 0.971 |
| 2.78216 | 0.971 |
| 2.78371 | 0.971 |
| 2.78527 | 0.971 |
| 2.78682 | 0.971 |
| 2.78838 | 0.971 |
| 2.78994 | 0.971 |
| 2.79149 | 0.971 |
| 2.79305 | 0.971 |
| 2.7946 | 0.971 |
| 2.79616 | 0.971 |
| 2.79772 | 0.971 |
| 2.79927 | 0.971 |
| 2.80083 | 0.971 |
| 2.80239 | 0.971 |
| 2.80394 | 0.971 |
| 2.8055 | 0.971 |
| 2.80705 | 0.971 |
| 2.80861 | 0.971 |
| 2.81017 | 0.971 |
| 2.81172 | 0.971 |
| 2.81328 | 0.971 |
| 2.81483 | 0.971 |
| 2.81639 | 0.971 |
| 2.81795 | 0.971 |
| 2.8195 | 0.972 |
| 2.82106 | 0.972 |
| 2.82262 | 0.972 |
| 2.82417 | 0.972 |
| 2.82573 | 0.972 |
| 2.82728 | 0.972 |
| 2.82884 | 0.972 |
| 2.8304 | 0.972 |
| 2.83195 | 0.972 |
| 2.83351 | 0.972 |
| 2.83506 | 0.972 |
| 2.83662 | 0.972 |
| 2.83818 | 0.972 |
| 2.83973 | 0.972 |
| 2.84129 | 0.972 |
| 2.84285 | 0.972 |
| 2.8444 | 0.972 |
| 2.84596 | 0.972 |
| 2.84751 | 0.972 |
| 2.84907 | 0.972 |
| 2.85063 | 0.972 |
| 2.85218 | 0.972 |
| 2.85374 | 0.972 |
| 2.85529 | 0.972 |
| 2.85685 | 0.972 |
| 2.85841 | 0.972 |
| 2.85996 | 0.972 |
| 2.86152 | 0.973 |
| 2.86308 | 0.973 |
| 2.86463 | 0.973 |
| 2.86619 | 0.973 |
| 2.86774 | 0.973 |
| 2.8693 | 0.973 |
| 2.87086 | 0.973 |
| 2.87241 | 0.973 |
| 2.87397 | 0.973 |
| 2.87552 | 0.973 |
| 2.87708 | 0.973 |
| 2.87864 | 0.973 |
| 2.88019 | 0.973 |
| 2.88175 | 0.973 |
| 2.88331 | 0.973 |
| 2.88486 | 0.973 |
| 2.88642 | 0.973 |
| 2.88797 | 0.973 |
| 2.88953 | 0.973 |
| 2.89109 | 0.973 |
| 2.89264 | 0.973 |
| 2.8942 | 0.973 |
| 2.89575 | 0.973 |
| 2.89731 | 0.973 |
| 2.89887 | 0.973 |
| 2.90042 | 0.973 |
| 2.90198 | 0.973 |
| 2.90354 | 0.974 |
| 2.90509 | 0.974 |
| 2.90665 | 0.974 |
| 2.9082 | 0.974 |
| 2.90976 | 0.974 |
| 2.91132 | 0.974 |
| 2.91287 | 0.974 |
| 2.91443 | 0.974 |
| 2.91599 | 0.974 |
| 2.91754 | 0.974 |
| 2.9191 | 0.974 |
| 2.92065 | 0.974 |
| 2.92221 | 0.974 |
| 2.92377 | 0.974 |
| 2.92532 | 0.974 |
| 2.92688 | 0.974 |
| 2.92843 | 0.974 |
| 2.92999 | 0.974 |
| 2.93155 | 0.974 |
| 2.9331 | 0.974 |
| 2.93466 | 0.974 |
| 2.93622 | 0.974 |
| 2.93777 | 0.974 |
| 2.93933 | 0.974 |
| 2.94088 | 0.974 |
| 2.94244 | 0.974 |
| 2.944 | 0.974 |
| 2.94555 | 0.974 |
| 2.94711 | 0.974 |
| 2.94866 | 0.974 |
| 2.95022 | 0.975 |
| 2.95178 | 0.975 |
| 2.95333 | 0.975 |
| 2.95489 | 0.975 |
| 2.95645 | 0.975 |
| 2.958 | 0.975 |
| 2.95956 | 0.975 |
| 2.96111 | 0.975 |
| 2.96267 | 0.975 |
| 2.96423 | 0.975 |
| 2.96578 | 0.975 |
| 2.96734 | 0.975 |
| 2.96889 | 0.975 |
| 2.97045 | 0.975 |
| 2.97201 | 0.975 |
| 2.97356 | 0.975 |
| 2.97512 | 0.975 |
| 2.97668 | 0.975 |
| 2.97823 | 0.975 |
| 2.97979 | 0.975 |
| 2.98134 | 0.975 |
| 2.9829 | 0.975 |
| 2.98446 | 0.975 |
| 2.98601 | 0.975 |
| 2.98757 | 0.975 |
| 2.98912 | 0.975 |
| 2.99068 | 0.975 |
| 2.99224 | 0.975 |
| 2.99379 | 0.975 |
| 2.99535 | 0.975 |
| 2.99691 | 0.976 |
| 2.99846 | 0.976 |
| 3.00002 | 0.976 |
| 3.00157 | 0.976 |
| 3.00313 | 0.976 |
| 3.00469 | 0.976 |
| 3.00624 | 0.976 |
| 3.0078 | 0.976 |
| 3.00935 | 0.976 |
| 3.01091 | 0.976 |
| 3.01247 | 0.976 |
| 3.01402 | 0.976 |
| 3.01558 | 0.976 |
| 3.01714 | 0.976 |
| 3.01869 | 0.976 |
| 3.02025 | 0.976 |
| 3.0218 | 0.976 |
| 3.02336 | 0.976 |
| 3.02492 | 0.976 |
| 3.02647 | 0.976 |
| 3.02803 | 0.976 |
| 3.02958 | 0.976 |
| 3.03114 | 0.976 |
| 3.0327 | 0.976 |
| 3.03425 | 0.976 |
| 3.03581 | 0.976 |
| 3.03737 | 0.976 |
| 3.03892 | 0.976 |
| 3.04048 | 0.976 |
| 3.04203 | 0.976 |
| 3.04359 | 0.976 |
| 3.04515 | 0.977 |
| 3.0467 | 0.977 |
| 3.04826 | 0.977 |
| 3.04981 | 0.977 |
| 3.05137 | 0.977 |
| 3.05293 | 0.977 |
| 3.05448 | 0.977 |
| 3.05604 | 0.977 |
| 3.0576 | 0.977 |
| 3.05915 | 0.977 |
| 3.06071 | 0.977 |
| 3.06226 | 0.977 |
| 3.06382 | 0.977 |
| 3.06538 | 0.977 |
| 3.06693 | 0.977 |
| 3.06849 | 0.977 |
| 3.07004 | 0.977 |
| 3.0716 | 0.977 |
| 3.07316 | 0.977 |
| 3.07471 | 0.977 |
| 3.07627 | 0.977 |
| 3.07783 | 0.977 |
| 3.07938 | 0.977 |
| 3.08094 | 0.977 |
| 3.08249 | 0.977 |
| 3.08405 | 0.977 |
| 3.08561 | 0.977 |
| 3.08716 | 0.977 |
| 3.08872 | 0.977 |
| 3.09027 | 0.977 |
| 3.09183 | 0.977 |
| 3.09339 | 0.977 |
| 3.09494 | 0.978 |
| 3.0965 | 0.978 |
| 3.09806 | 0.978 |
| 3.09961 | 0.978 |
| 3.10117 | 0.978 |
| 3.10272 | 0.978 |
| 3.10428 | 0.978 |
| 3.10584 | 0.978 |
| 3.10739 | 0.978 |
| 3.10895 | 0.978 |
| 3.1105 | 0.978 |
| 3.11206 | 0.978 |
| 3.11362 | 0.978 |
| 3.11517 | 0.978 |
| 3.11673 | 0.978 |
| 3.11829 | 0.978 |
| 3.11984 | 0.978 |
| 3.1214 | 0.978 |
| 3.12295 | 0.978 |
| 3.12451 | 0.978 |
| 3.12607 | 0.978 |
| 3.12762 | 0.978 |
| 3.12918 | 0.978 |
| 3.13073 | 0.978 |
| 3.13229 | 0.978 |
| 3.13385 | 0.978 |
| 3.1354 | 0.978 |
| 3.13696 | 0.978 |
| 3.13852 | 0.978 |
| 3.14007 | 0.978 |
| 3.14163 | 0.978 |
| 3.14318 | 0.978 |
| 3.14474 | 0.978 |
| 3.1463 | 0.979 |
| 3.14785 | 0.979 |
| 3.14941 | 0.979 |
| 3.15096 | 0.979 |
| 3.15252 | 0.979 |
| 3.15408 | 0.979 |
| 3.15563 | 0.979 |
| 3.15719 | 0.979 |
| 3.15875 | 0.979 |
| 3.1603 | 0.979 |
| 3.16186 | 0.979 |
| 3.16341 | 0.979 |
| 3.16497 | 0.979 |
| 3.16653 | 0.979 |
| 3.16808 | 0.979 |
| 3.16964 | 0.979 |
| 3.17119 | 0.979 |
| 3.17275 | 0.979 |
| 3.17431 | 0.979 |
| 3.17586 | 0.979 |
| 3.17742 | 0.979 |
| 3.17898 | 0.979 |
| 3.18053 | 0.979 |
| 3.18209 | 0.979 |
| 3.18364 | 0.979 |
| 3.1852 | 0.979 |
| 3.18676 | 0.979 |
| 3.18831 | 0.979 |
| 3.18987 | 0.979 |
| 3.19142 | 0.979 |
| 3.19298 | 0.979 |
| 3.19454 | 0.979 |
| 3.19609 | 0.979 |
| 3.19765 | 0.979 |
| 3.19921 | 0.979 |
| 3.20076 | 0.979 |
| 3.20232 | 0.98 |
| 3.20387 | 0.98 |
| 3.20543 | 0.98 |
| 3.20699 | 0.98 |
| 3.20854 | 0.98 |
| 3.2101 | 0.98 |
| 3.21165 | 0.98 |
| 3.21321 | 0.98 |
| 3.21477 | 0.98 |
| 3.21632 | 0.98 |
| 3.21788 | 0.98 |
| 3.21944 | 0.98 |
| 3.22099 | 0.98 |
| 3.22255 | 0.98 |
| 3.2241 | 0.98 |
| 3.22566 | 0.98 |
| 3.22722 | 0.98 |
| 3.22877 | 0.98 |
| 3.23033 | 0.98 |
| 3.23188 | 0.98 |
| 3.23344 | 0.98 |
| 3.235 | 0.98 |
| 3.23655 | 0.98 |
| 3.23811 | 0.98 |
| 3.23967 | 0.98 |
| 3.24122 | 0.98 |
| 3.24278 | 0.98 |
| 3.24433 | 0.98 |
| 3.24589 | 0.98 |
| 3.24745 | 0.98 |
| 3.249 | 0.98 |
| 3.25056 | 0.98 |
| 3.25211 | 0.98 |
| 3.25367 | 0.98 |
| 3.25523 | 0.98 |
| 3.25678 | 0.98 |
| 3.25834 | 0.98 |
| 3.2599 | 0.981 |
| 3.26145 | 0.981 |
| 3.26301 | 0.981 |
| 3.26456 | 0.981 |
| 3.26612 | 0.981 |
| 3.26768 | 0.981 |
| 3.26923 | 0.981 |
| 3.27079 | 0.981 |
| 3.27234 | 0.981 |
| 3.2739 | 0.981 |
| 3.27546 | 0.981 |
| 3.27701 | 0.981 |
| 3.27857 | 0.981 |
| 3.28013 | 0.981 |
| 3.28168 | 0.981 |
| 3.28324 | 0.981 |
| 3.28479 | 0.981 |
| 3.28635 | 0.981 |
| 3.28791 | 0.981 |
| 3.28946 | 0.981 |
| 3.29102 | 0.981 |
| 3.29257 | 0.981 |
| 3.29413 | 0.981 |
| 3.29569 | 0.981 |
| 3.29724 | 0.981 |
| 3.2988 | 0.981 |
| 3.30036 | 0.981 |
| 3.30191 | 0.981 |
| 3.30347 | 0.981 |
| 3.30502 | 0.981 |
| 3.30658 | 0.981 |
| 3.30814 | 0.981 |
| 3.30969 | 0.981 |
| 3.31125 | 0.981 |
| 3.3128 | 0.981 |
| 3.31436 | 0.981 |
| 3.31592 | 0.981 |
| 3.31747 | 0.982 |
| 3.31903 | 0.982 |
| 3.32059 | 0.982 |
| 3.32214 | 0.982 |
| 3.3237 | 0.982 |
| 3.32525 | 0.982 |
| 3.32681 | 0.982 |
| 3.32837 | 0.982 |
| 3.32992 | 0.982 |
| 3.33148 | 0.982 |
| 3.33303 | 0.982 |
| 3.33459 | 0.982 |
| 3.33615 | 0.982 |
| 3.3377 | 0.982 |
| 3.33926 | 0.982 |
| 3.34082 | 0.982 |
| 3.34237 | 0.982 |
| 3.34393 | 0.982 |
| 3.34548 | 0.982 |
| 3.34704 | 0.982 |
| 3.3486 | 0.982 |
| 3.35015 | 0.982 |
| 3.35171 | 0.982 |
| 3.35327 | 0.982 |
| 3.35482 | 0.982 |
| 3.35638 | 0.982 |
| 3.35793 | 0.982 |
| 3.35949 | 0.982 |
| 3.36105 | 0.982 |
| 3.3626 | 0.982 |
| 3.36416 | 0.982 |
| 3.36571 | 0.982 |
| 3.36727 | 0.982 |
| 3.36883 | 0.982 |
| 3.37038 | 0.982 |
| 3.37194 | 0.982 |
| 3.3735 | 0.982 |
| 3.37505 | 0.982 |
| 3.37661 | 0.983 |
| 3.37816 | 0.983 |
| 3.37972 | 0.983 |
| 3.38128 | 0.983 |
| 3.38283 | 0.983 |
| 3.38439 | 0.983 |
| 3.38594 | 0.983 |
| 3.3875 | 0.983 |
| 3.38906 | 0.983 |
| 3.39061 | 0.983 |
| 3.39217 | 0.983 |
| 3.39373 | 0.983 |
| 3.39528 | 0.983 |
| 3.39684 | 0.983 |
| 3.39839 | 0.983 |
| 3.39995 | 0.983 |
| 3.40151 | 0.983 |
| 3.40306 | 0.983 |
| 3.40462 | 0.983 |
| 3.40617 | 0.983 |
| 3.40773 | 0.983 |
| 3.40929 | 0.983 |
| 3.41084 | 0.983 |
| 3.4124 | 0.983 |
| 3.41396 | 0.983 |
| 3.41551 | 0.983 |
| 3.41707 | 0.983 |
| 3.41862 | 0.983 |
| 3.42018 | 0.983 |
| 3.42174 | 0.983 |
| 3.42329 | 0.983 |
| 3.42485 | 0.983 |
| 3.4264 | 0.983 |
| 3.42796 | 0.983 |
| 3.42952 | 0.983 |
| 3.43107 | 0.983 |
| 3.43263 | 0.983 |
| 3.43419 | 0.984 |
| 3.43574 | 0.984 |
| 3.4373 | 0.984 |
| 3.43885 | 0.984 |
| 3.44041 | 0.984 |
| 3.44197 | 0.984 |
| 3.44352 | 0.984 |
| 3.44508 | 0.984 |
| 3.44663 | 0.984 |
| 3.44819 | 0.984 |
| 3.44975 | 0.984 |
| 3.4513 | 0.984 |
| 3.45286 | 0.984 |
| 3.45442 | 0.984 |
| 3.45597 | 0.984 |
| 3.45753 | 0.984 |
| 3.45908 | 0.984 |
| 3.46064 | 0.984 |
| 3.4622 | 0.984 |
| 3.46375 | 0.984 |
| 3.46531 | 0.984 |
| 3.46686 | 0.984 |
| 3.46842 | 0.984 |
| 3.46998 | 0.984 |
| 3.47153 | 0.984 |
| 3.47309 | 0.984 |
| 3.47465 | 0.984 |
| 3.4762 | 0.984 |
| 3.47776 | 0.984 |
| 3.47931 | 0.984 |
| 3.48087 | 0.984 |
| 3.48243 | 0.984 |
| 3.48398 | 0.984 |
| 3.48554 | 0.984 |
| 3.48709 | 0.984 |
| 3.48865 | 0.984 |
| 3.49021 | 0.984 |
| 3.49176 | 0.984 |
| 3.49332 | 0.984 |
| 3.49488 | 0.984 |
| 3.49643 | 0.984 |
| 3.49799 | 0.984 |
| 3.49954 | 0.985 |
| 3.5011 | 0.985 |
| 3.50266 | 0.985 |
| 3.50421 | 0.985 |
| 3.50577 | 0.985 |
| 3.50732 | 0.985 |
| 3.50888 | 0.985 |
| 3.51044 | 0.985 |
| 3.51199 | 0.985 |
| 3.51355 | 0.985 |
| 3.51511 | 0.985 |
| 3.51666 | 0.985 |
| 3.51822 | 0.985 |
| 3.51977 | 0.985 |
| 3.52133 | 0.985 |
| 3.52289 | 0.985 |
| 3.52444 | 0.985 |
| 3.526 | 0.985 |
| 3.52755 | 0.985 |
| 3.52911 | 0.985 |
| 3.53067 | 0.985 |
| 3.53222 | 0.985 |
| 3.53378 | 0.985 |
| 3.53534 | 0.985 |
| 3.53689 | 0.985 |
| 3.53845 | 0.985 |
| 3.54 | 0.985 |
| 3.54156 | 0.985 |
| 3.54312 | 0.985 |
| 3.54467 | 0.985 |
| 3.54623 | 0.985 |
| 3.54778 | 0.985 |
| 3.54934 | 0.985 |
| 3.5509 | 0.985 |
| 3.55245 | 0.985 |
| 3.55401 | 0.985 |
| 3.55557 | 0.985 |
| 3.55712 | 0.985 |
| 3.55868 | 0.985 |
| 3.56023 | 0.985 |
| 3.56179 | 0.985 |
| 3.56335 | 0.985 |
| 3.5649 | 0.985 |
| 3.56646 | 0.986 |
| 3.56801 | 0.986 |
| 3.56957 | 0.986 |
| 3.57113 | 0.986 |
| 3.57268 | 0.986 |
| 3.57424 | 0.986 |
| 3.5758 | 0.986 |
| 3.57735 | 0.986 |
| 3.57891 | 0.986 |
| 3.58046 | 0.986 |
| 3.58202 | 0.986 |
| 3.58358 | 0.986 |
| 3.58513 | 0.986 |
| 3.58669 | 0.986 |
| 3.58824 | 0.986 |
| 3.5898 | 0.986 |
| 3.59136 | 0.986 |
| 3.59291 | 0.986 |
| 3.59447 | 0.986 |
| 3.59603 | 0.986 |
| 3.59758 | 0.986 |
| 3.59914 | 0.986 |
| 3.60069 | 0.986 |
| 3.60225 | 0.986 |
| 3.60381 | 0.986 |
| 3.60536 | 0.986 |
| 3.60692 | 0.986 |
| 3.60847 | 0.986 |
| 3.61003 | 0.986 |
| 3.61159 | 0.986 |
| 3.61314 | 0.986 |
| 3.6147 | 0.986 |
| 3.61626 | 0.986 |
| 3.61781 | 0.986 |
| 3.61937 | 0.986 |
| 3.62092 | 0.986 |
| 3.62248 | 0.986 |
| 3.62404 | 0.986 |
| 3.62559 | 0.986 |
| 3.62715 | 0.986 |
| 3.6287 | 0.986 |
| 3.63026 | 0.986 |
| 3.63182 | 0.986 |
| 3.63337 | 0.986 |
| 3.63493 | 0.986 |
| 3.63649 | 0.986 |
| 3.63804 | 0.986 |
| 3.6396 | 0.986 |
| 3.64115 | 0.986 |
| 3.64271 | 0.986 |
| 3.64427 | 0.987 |
| 3.64582 | 0.987 |
| 3.64738 | 0.987 |
| 3.64893 | 0.987 |
| 3.65049 | 0.987 |
| 3.65205 | 0.987 |
| 3.6536 | 0.987 |
| 3.65516 | 0.987 |
| 3.65672 | 0.987 |
| 3.65827 | 0.987 |
| 3.65983 | 0.987 |
| 3.66138 | 0.987 |
| 3.66294 | 0.987 |
| 3.6645 | 0.987 |
| 3.66605 | 0.987 |
| 3.66761 | 0.987 |
| 3.66916 | 0.987 |
| 3.67072 | 0.987 |
| 3.67228 | 0.987 |
| 3.67383 | 0.987 |
| 3.67539 | 0.987 |
| 3.67695 | 0.987 |
| 3.6785 | 0.987 |
| 3.68006 | 0.987 |
| 3.68161 | 0.987 |
| 3.68317 | 0.987 |
| 3.68473 | 0.987 |
| 3.68628 | 0.987 |
| 3.68784 | 0.987 |
| 3.68939 | 0.987 |
| 3.69095 | 0.987 |
| 3.69251 | 0.987 |
| 3.69406 | 0.987 |
| 3.69562 | 0.987 |
| 3.69718 | 0.987 |
| 3.69873 | 0.987 |
| 3.70029 | 0.987 |
| 3.70184 | 0.987 |
| 3.7034 | 0.987 |
| 3.70496 | 0.987 |
| 3.70651 | 0.987 |
| 3.70807 | 0.987 |
| 3.70962 | 0.987 |
| 3.71118 | 0.987 |
| 3.71274 | 0.987 |
| 3.71429 | 0.987 |
| 3.71585 | 0.987 |
| 3.71741 | 0.987 |
| 3.71896 | 0.988 |
| 3.72052 | 0.988 |
| 3.72207 | 0.988 |
| 3.72363 | 0.988 |
| 3.72519 | 0.988 |
| 3.72674 | 0.988 |
| 3.7283 | 0.988 |
| 3.72985 | 0.988 |
| 3.73141 | 0.988 |
| 3.73297 | 0.988 |
| 3.73452 | 0.988 |
| 3.73608 | 0.988 |
| 3.73764 | 0.988 |
| 3.73919 | 0.988 |
| 3.74075 | 0.988 |
| 3.7423 | 0.988 |
| 3.74386 | 0.988 |
| 3.74542 | 0.988 |
| 3.74697 | 0.988 |
| 3.74853 | 0.988 |
| 3.75008 | 0.988 |
| 3.75164 | 0.988 |
| 3.7532 | 0.988 |
| 3.75475 | 0.988 |
| 3.75631 | 0.988 |
| 3.75787 | 0.988 |
| 3.75942 | 0.988 |
| 3.76098 | 0.988 |
| 3.76253 | 0.988 |
| 3.76409 | 0.988 |
| 3.76565 | 0.988 |
| 3.7672 | 0.988 |
| 3.76876 | 0.988 |
| 3.77032 | 0.988 |
| 3.77187 | 0.988 |
| 3.77343 | 0.988 |
| 3.77498 | 0.988 |
| 3.77654 | 0.988 |
| 3.7781 | 0.988 |
| 3.77965 | 0.988 |
| 3.78121 | 0.988 |
| 3.78276 | 0.988 |
| 3.78432 | 0.988 |
| 3.78588 | 0.988 |
| 3.78743 | 0.988 |
| 3.78899 | 0.988 |
| 3.79055 | 0.988 |
| 3.7921 | 0.988 |
| 3.79366 | 0.988 |
| 3.79521 | 0.988 |
| 3.79677 | 0.988 |
| 3.79833 | 0.988 |
| 3.79988 | 0.988 |
| 3.80144 | 0.988 |
| 3.80299 | 0.988 |
| 3.80455 | 0.989 |
| 3.80611 | 0.989 |
| 3.80766 | 0.989 |
| 3.80922 | 0.989 |
| 3.81078 | 0.989 |
| 3.81233 | 0.989 |
| 3.81389 | 0.989 |
| 3.81544 | 0.989 |
| 3.817 | 0.989 |
| 3.81856 | 0.989 |
| 3.82011 | 0.989 |
| 3.82167 | 0.989 |
| 3.82322 | 0.989 |
| 3.82478 | 0.989 |
| 3.82634 | 0.989 |
| 3.82789 | 0.989 |
| 3.82945 | 0.989 |
| 3.83101 | 0.989 |
| 3.83256 | 0.989 |
| 3.83412 | 0.989 |
| 3.83567 | 0.989 |
| 3.83723 | 0.989 |
| 3.83879 | 0.989 |
| 3.84034 | 0.989 |
| 3.8419 | 0.989 |
| 3.84345 | 0.989 |
| 3.84501 | 0.989 |
| 3.84657 | 0.989 |
| 3.84812 | 0.989 |
| 3.84968 | 0.989 |
| 3.85124 | 0.989 |
| 3.85279 | 0.989 |
| 3.85435 | 0.989 |
| 3.8559 | 0.989 |
| 3.85746 | 0.989 |
| 3.85902 | 0.989 |
| 3.86057 | 0.989 |
| 3.86213 | 0.989 |
| 3.86368 | 0.989 |
| 3.86524 | 0.989 |
| 3.8668 | 0.989 |
| 3.86835 | 0.989 |
| 3.86991 | 0.989 |
| 3.87147 | 0.989 |
| 3.87302 | 0.989 |
| 3.87458 | 0.989 |
| 3.87613 | 0.989 |
| 3.87769 | 0.989 |
| 3.87925 | 0.989 |
| 3.8808 | 0.989 |
| 3.88236 | 0.989 |
| 3.88391 | 0.989 |
| 3.88547 | 0.989 |
| 3.88703 | 0.989 |
| 3.88858 | 0.99 |
| 3.89014 | 0.99 |
| 3.8917 | 0.99 |
| 3.89325 | 0.99 |
| 3.89481 | 0.99 |
| 3.89636 | 0.99 |
| 3.89792 | 0.99 |
| 3.89948 | 0.99 |
| 3.90103 | 0.99 |
| 3.90259 | 0.99 |
| 3.90414 | 0.99 |
| 3.9057 | 0.99 |
| 3.90726 | 0.99 |
| 3.90881 | 0.99 |
| 3.91037 | 0.99 |
| 3.91193 | 0.99 |
| 3.91348 | 0.99 |
| 3.91504 | 0.99 |
| 3.91659 | 0.99 |
| 3.91815 | 0.99 |
| 3.91971 | 0.99 |
| 3.92126 | 0.99 |
| 3.92282 | 0.99 |
| 3.92437 | 0.99 |
| 3.92593 | 0.99 |
| 3.92749 | 0.99 |
| 3.92904 | 0.99 |
| 3.9306 | 0.99 |
| 3.93216 | 0.99 |
| 3.93371 | 0.99 |
| 3.93527 | 0.99 |
| 3.93682 | 0.99 |
| 3.93838 | 0.99 |
| 3.93994 | 0.99 |
| 3.94149 | 0.99 |
| 3.94305 | 0.99 |
| 3.9446 | 0.99 |
| 3.94616 | 0.99 |
| 3.94772 | 0.99 |
| 3.94927 | 0.99 |
| 3.95083 | 0.99 |
| 3.95239 | 0.99 |
| 3.95394 | 0.99 |
| 3.9555 | 0.99 |
| 3.95705 | 0.99 |
| 3.95861 | 0.99 |
| 3.96017 | 0.99 |
| 3.96172 | 0.99 |
| 3.96328 | 0.99 |
| 3.96483 | 0.99 |
| 3.96639 | 0.99 |
| 3.96795 | 0.99 |
| 3.9695 | 0.99 |
| 3.97106 | 0.99 |
| 3.97262 | 0.99 |
| 3.97417 | 0.99 |
| 3.97573 | 0.99 |
| 3.97728 | 0.99 |
| 3.97884 | 0.99 |
| 3.9804 | 0.99 |
| 3.98195 | 0.99 |
| 3.98351 | 0.99 |
| 3.98506 | 0.991 |
| 3.98662 | 0.991 |
| 3.98818 | 0.991 |
| 3.98973 | 0.991 |
| 3.99129 | 0.991 |
| 3.99285 | 0.991 |
| 3.9944 | 0.991 |
| 3.99596 | 0.991 |
| 3.99751 | 0.991 |
| 3.99907 | 0.991 |
| 4.00063 | 0.991 |
| 4.00218 | 0.991 |
| 4.00374 | 0.991 |
| 4.00529 | 0.991 |
| 4.00685 | 0.991 |
| 4.00841 | 0.991 |
| 4.00996 | 0.991 |
| 4.01152 | 0.991 |
| 4.01308 | 0.991 |
| 4.01463 | 0.991 |
| 4.01619 | 0.991 |
| 4.01774 | 0.991 |
| 4.0193 | 0.991 |
| 4.02086 | 0.991 |
| 4.02241 | 0.991 |
| 4.02397 | 0.991 |
| 4.02552 | 0.991 |
| 4.02708 | 0.991 |
| 4.02864 | 0.991 |
| 4.03019 | 0.991 |
| 4.03175 | 0.991 |
| 4.03331 | 0.991 |
| 4.03486 | 0.991 |
| 4.03642 | 0.991 |
| 4.03797 | 0.991 |
| 4.03953 | 0.991 |
| 4.04109 | 0.991 |
| 4.04264 | 0.991 |
| 4.0442 | 0.991 |
| 4.04575 | 0.991 |
| 4.04731 | 0.991 |
| 4.04887 | 0.991 |
| 4.05042 | 0.991 |
| 4.05198 | 0.991 |
| 4.05354 | 0.991 |
| 4.05509 | 0.991 |
| 4.05665 | 0.991 |
| 4.0582 | 0.991 |
| 4.05976 | 0.991 |
| 4.06132 | 0.991 |
| 4.06287 | 0.991 |
| 4.06443 | 0.991 |
| 4.06598 | 0.991 |
| 4.06754 | 0.991 |
| 4.0691 | 0.991 |
| 4.07065 | 0.991 |
| 4.07221 | 0.991 |
| 4.07377 | 0.991 |
| 4.07532 | 0.991 |
| 4.07688 | 0.991 |
| 4.07843 | 0.991 |
| 4.07999 | 0.992 |
| 4.08155 | 0.992 |
| 4.0831 | 0.992 |
| 4.08466 | 0.992 |
| 4.08621 | 0.992 |
| 4.08777 | 0.992 |
| 4.08933 | 0.992 |
| 4.09088 | 0.992 |
| 4.09244 | 0.992 |
| 4.094 | 0.992 |
| 4.09555 | 0.992 |
| 4.09711 | 0.992 |
| 4.09866 | 0.992 |
| 4.10022 | 0.992 |
| 4.10178 | 0.992 |
| 4.10333 | 0.992 |
| 4.10489 | 0.992 |
| 4.10644 | 0.992 |
| 4.108 | 0.992 |
| 4.10956 | 0.992 |
| 4.11111 | 0.992 |
| 4.11267 | 0.992 |
| 4.11423 | 0.992 |
| 4.11578 | 0.992 |
| 4.11734 | 0.992 |
| 4.11889 | 0.992 |
| 4.12045 | 0.992 |
| 4.12201 | 0.992 |
| 4.12356 | 0.992 |
| 4.12512 | 0.992 |
| 4.12667 | 0.992 |
| 4.12823 | 0.992 |
| 4.12979 | 0.992 |
| 4.13134 | 0.992 |
| 4.1329 | 0.992 |
| 4.13446 | 0.992 |
| 4.13601 | 0.992 |
| 4.13757 | 0.992 |
| 4.13912 | 0.992 |
| 4.14068 | 0.992 |
| 4.14224 | 0.992 |
| 4.14379 | 0.992 |
| 4.14535 | 0.992 |
| 4.1469 | 0.992 |
| 4.14846 | 0.992 |
| 4.15002 | 0.992 |
| 4.15157 | 0.992 |
| 4.15313 | 0.992 |
| 4.15469 | 0.992 |
| 4.15624 | 0.992 |
| 4.1578 | 0.992 |
| 4.15935 | 0.992 |
| 4.16091 | 0.992 |
| 4.16247 | 0.992 |
| 4.16402 | 0.992 |
| 4.16558 | 0.992 |
| 4.16713 | 0.992 |
| 4.16869 | 0.992 |
| 4.17025 | 0.992 |
| 4.1718 | 0.992 |
| 4.17336 | 0.992 |
| 4.17492 | 0.992 |
| 4.17647 | 0.992 |
| 4.17803 | 0.992 |
| 4.17958 | 0.992 |
| 4.18114 | 0.992 |
| 4.1827 | 0.992 |
| 4.18425 | 0.992 |
| 4.18581 | 0.992 |
| 4.18736 | 0.992 |
| 4.18892 | 0.992 |
| 4.19048 | 0.992 |
| 4.19203 | 0.993 |
| 4.19359 | 0.993 |
| 4.19515 | 0.993 |
| 4.1967 | 0.993 |
| 4.19826 | 0.993 |
| 4.19981 | 0.993 |
| 4.20137 | 0.993 |
| 4.20293 | 0.993 |
| 4.20448 | 0.993 |
| 4.20604 | 0.993 |
| 4.2076 | 0.993 |
| 4.20915 | 0.993 |
| 4.21071 | 0.993 |
| 4.21226 | 0.993 |
| 4.21382 | 0.993 |
| 4.21538 | 0.993 |
| 4.21693 | 0.993 |
| 4.21849 | 0.993 |
| 4.22004 | 0.993 |
| 4.2216 | 0.993 |
| 4.22316 | 0.993 |
| 4.22471 | 0.993 |
| 4.22627 | 0.993 |
| 4.22783 | 0.993 |
| 4.22938 | 0.993 |
| 4.23094 | 0.993 |
| 4.23249 | 0.993 |
| 4.23405 | 0.993 |
| 4.23561 | 0.993 |
| 4.23716 | 0.993 |
| 4.23872 | 0.993 |
| 4.24027 | 0.993 |
| 4.24183 | 0.993 |
| 4.24339 | 0.993 |
| 4.24494 | 0.993 |
| 4.2465 | 0.993 |
| 4.24806 | 0.993 |
| 4.24961 | 0.993 |
| 4.25117 | 0.993 |
| 4.25272 | 0.993 |
| 4.25428 | 0.993 |
| 4.25584 | 0.993 |
| 4.25739 | 0.993 |
| 4.25895 | 0.993 |
| 4.2605 | 0.993 |
| 4.26206 | 0.993 |
| 4.26362 | 0.993 |
| 4.26517 | 0.993 |
| 4.26673 | 0.993 |
| 4.26829 | 0.993 |
| 4.26984 | 0.993 |
| 4.2714 | 0.993 |
| 4.27295 | 0.993 |
| 4.27451 | 0.993 |
| 4.27607 | 0.993 |
| 4.27762 | 0.993 |
| 4.27918 | 0.993 |
| 4.28073 | 0.993 |
| 4.28229 | 0.993 |
| 4.28385 | 0.993 |
| 4.2854 | 0.993 |
| 4.28696 | 0.993 |
| 4.28852 | 0.993 |
| 4.29007 | 0.993 |
| 4.29163 | 0.993 |
| 4.29318 | 0.993 |
| 4.29474 | 0.993 |
| 4.2963 | 0.993 |
| 4.29785 | 0.993 |
| 4.29941 | 0.993 |
| 4.30096 | 0.993 |
| 4.30252 | 0.993 |
| 4.30408 | 0.993 |
| 4.30563 | 0.993 |
| 4.30719 | 0.994 |
| 4.30875 | 0.994 |
| 4.3103 | 0.994 |
| 4.31186 | 0.994 |
| 4.31341 | 0.994 |
| 4.31497 | 0.994 |
| 4.31653 | 0.994 |
| 4.31808 | 0.994 |
| 4.31964 | 0.994 |
| 4.32119 | 0.994 |
| 4.32275 | 0.994 |
| 4.32431 | 0.994 |
| 4.32586 | 0.994 |
| 4.32742 | 0.994 |
| 4.32898 | 0.994 |
| 4.33053 | 0.994 |
| 4.33209 | 0.994 |
| 4.33364 | 0.994 |
| 4.3352 | 0.994 |
| 4.33676 | 0.994 |
| 4.33831 | 0.994 |
| 4.33987 | 0.994 |
| 4.34142 | 0.994 |
| 4.34298 | 0.994 |
| 4.34454 | 0.994 |
| 4.34609 | 0.994 |
| 4.34765 | 0.994 |
| 4.34921 | 0.994 |
| 4.35076 | 0.994 |
| 4.35232 | 0.994 |
| 4.35387 | 0.994 |
| 4.35543 | 0.994 |
| 4.35699 | 0.994 |
| 4.35854 | 0.994 |
| 4.3601 | 0.994 |
| 4.36165 | 0.994 |
| 4.36321 | 0.994 |
| 4.36477 | 0.994 |
| 4.36632 | 0.994 |
| 4.36788 | 0.994 |
| 4.36944 | 0.994 |
| 4.37099 | 0.994 |
| 4.37255 | 0.994 |
| 4.3741 | 0.994 |
| 4.37566 | 0.994 |
| 4.37722 | 0.994 |
| 4.37877 | 0.994 |
| 4.38033 | 0.994 |
| 4.38188 | 0.994 |
| 4.38344 | 0.994 |
| 4.385 | 0.994 |
| 4.38655 | 0.994 |
| 4.38811 | 0.994 |
| 4.38967 | 0.994 |
| 4.39122 | 0.994 |
| 4.39278 | 0.994 |
| 4.39433 | 0.994 |
| 4.39589 | 0.994 |
| 4.39745 | 0.994 |
| 4.399 | 0.994 |
| 4.40056 | 0.994 |
| 4.40211 | 0.994 |
| 4.40367 | 0.994 |
| 4.40523 | 0.994 |
| 4.40678 | 0.994 |
| 4.40834 | 0.994 |
| 4.4099 | 0.994 |
| 4.41145 | 0.994 |
| 4.41301 | 0.994 |
| 4.41456 | 0.994 |
| 4.41612 | 0.994 |
| 4.41768 | 0.994 |
| 4.41923 | 0.994 |
| 4.42079 | 0.994 |
| 4.42234 | 0.994 |
| 4.4239 | 0.994 |
| 4.42546 | 0.994 |
| 4.42701 | 0.994 |
| 4.42857 | 0.994 |
| 4.43013 | 0.994 |
| 4.43168 | 0.994 |
| 4.43324 | 0.994 |
| 4.43479 | 0.994 |
| 4.43635 | 0.994 |
| 4.43791 | 0.994 |
| 4.43946 | 0.994 |
| 4.44102 | 0.994 |
| 4.44257 | 0.994 |
| 4.44413 | 0.994 |
| 4.44569 | 0.994 |
| 4.44724 | 0.994 |
| 4.4488 | 0.994 |
| 4.45036 | 0.994 |
| 4.45191 | 0.995 |
| 4.45347 | 0.995 |
| 4.45502 | 0.995 |
| 4.45658 | 0.995 |
| 4.45814 | 0.995 |
| 4.45969 | 0.995 |
| 4.46125 | 0.995 |
| 4.4628 | 0.995 |
| 4.46436 | 0.995 |
| 4.46592 | 0.995 |
| 4.46747 | 0.995 |
| 4.46903 | 0.995 |
| 4.47059 | 0.995 |
| 4.47214 | 0.995 |
| 4.4737 | 0.995 |
| 4.47525 | 0.995 |
| 4.47681 | 0.995 |
| 4.47837 | 0.995 |
| 4.47992 | 0.995 |
| 4.48148 | 0.995 |
| 4.48303 | 0.995 |
| 4.48459 | 0.995 |
| 4.48615 | 0.995 |
| 4.4877 | 0.995 |
| 4.48926 | 0.995 |
| 4.49082 | 0.995 |
| 4.49237 | 0.995 |
| 4.49393 | 0.995 |
| 4.49548 | 0.995 |
| 4.49704 | 0.995 |
| 4.4986 | 0.995 |
| 4.50015 | 0.995 |
| 4.50171 | 0.995 |
| 4.50326 | 0.995 |
| 4.50482 | 0.995 |
| 4.50638 | 0.995 |
| 4.50793 | 0.995 |
| 4.50949 | 0.995 |
| 4.51105 | 0.995 |
| 4.5126 | 0.995 |
| 4.51416 | 0.995 |
| 4.51571 | 0.995 |
| 4.51727 | 0.995 |
| 4.51883 | 0.995 |
| 4.52038 | 0.995 |
| 4.52194 | 0.995 |
| 4.52349 | 0.995 |
| 4.52505 | 0.995 |
| 4.52661 | 0.995 |
| 4.52816 | 0.995 |
| 4.52972 | 0.995 |
| 4.53128 | 0.995 |
| 4.53283 | 0.995 |
| 4.53439 | 0.995 |
| 4.53594 | 0.995 |
| 4.5375 | 0.995 |
| 4.53906 | 0.995 |
| 4.54061 | 0.995 |
| 4.54217 | 0.995 |
| 4.54372 | 0.995 |
| 4.54528 | 0.995 |
| 4.54684 | 0.995 |
| 4.54839 | 0.995 |
| 4.54995 | 0.995 |
| 4.55151 | 0.995 |
| 4.55306 | 0.995 |
| 4.55462 | 0.995 |
| 4.55617 | 0.995 |
| 4.55773 | 0.995 |
| 4.55929 | 0.995 |
| 4.56084 | 0.995 |
| 4.5624 | 0.995 |
| 4.56395 | 0.995 |
| 4.56551 | 0.995 |
| 4.56707 | 0.995 |
| 4.56862 | 0.995 |
| 4.57018 | 0.995 |
| 4.57174 | 0.995 |
| 4.57329 | 0.995 |
| 4.57485 | 0.995 |
| 4.5764 | 0.995 |
| 4.57796 | 0.995 |
| 4.57952 | 0.995 |
| 4.58107 | 0.995 |
| 4.58263 | 0.995 |
| 4.58418 | 0.995 |
| 4.58574 | 0.995 |
| 4.5873 | 0.995 |
| 4.58885 | 0.995 |
| 4.59041 | 0.995 |
| 4.59197 | 0.995 |
| 4.59352 | 0.995 |
| 4.59508 | 0.995 |
| 4.59663 | 0.995 |
| 4.59819 | 0.995 |
| 4.59975 | 0.995 |
| 4.6013 | 0.995 |
| 4.60286 | 0.995 |
| 4.60441 | 0.995 |
| 4.60597 | 0.995 |
| 4.60753 | 0.995 |
| 4.60908 | 0.995 |
| 4.61064 | 0.995 |
| 4.6122 | 0.995 |
| 4.613749999999999 | 0.995 |
| 4.61531 | 0.995 |
| 4.61686 | 0.995 |
| 4.61842 | 0.995 |
| 4.61998 | 0.996 |
| 4.62153 | 0.996 |
| 4.62309 | 0.996 |
| 4.62465 | 0.996 |
| 4.6262 | 0.996 |
| 4.62776 | 0.996 |
| 4.62931 | 0.996 |
| 4.63087 | 0.996 |
| 4.63243 | 0.996 |
| 4.63398 | 0.996 |
| 4.63554 | 0.996 |
| 4.63709 | 0.996 |
| 4.63865 | 0.996 |
| 4.64021 | 0.996 |
| 4.64176 | 0.996 |
| 4.64332 | 0.996 |
| 4.64488 | 0.996 |
| 4.64643 | 0.996 |
| 4.64799 | 0.996 |
| 4.64954 | 0.996 |
| 4.651099999999999 | 0.996 |
| 4.65266 | 0.996 |
| 4.65421 | 0.996 |
| 4.65577 | 0.996 |
| 4.65732 | 0.996 |
| 4.65888 | 0.996 |
| 4.66044 | 0.996 |
| 4.66199 | 0.996 |
| 4.66355 | 0.996 |
| 4.66511 | 0.996 |
| 4.66666 | 0.996 |
| 4.66822 | 0.996 |
| 4.66977 | 0.996 |
| 4.67133 | 0.996 |
| 4.67289 | 0.996 |
| 4.67444 | 0.996 |
| 4.676 | 0.996 |
| 4.67755 | 0.996 |
| 4.67911 | 0.996 |
| 4.68067 | 0.996 |
| 4.68222 | 0.996 |
| 4.68378 | 0.996 |
| 4.68534 | 0.996 |
| 4.68689 | 0.996 |
| 4.688449999999999 | 0.996 |
| 4.69 | 0.996 |
| 4.69156 | 0.996 |
| 4.69312 | 0.996 |
| 4.69467 | 0.996 |
| 4.69623 | 0.996 |
| 4.69778 | 0.996 |
| 4.69934 | 0.996 |
| 4.7009 | 0.996 |
| 4.70245 | 0.996 |
| 4.70401 | 0.996 |
| 4.70557 | 0.996 |
| 4.70712 | 0.996 |
| 4.70868 | 0.996 |
| 4.71023 | 0.996 |
| 4.71179 | 0.996 |
| 4.71335 | 0.996 |
| 4.7149 | 0.996 |
| 4.71646 | 0.996 |
| 4.71801 | 0.996 |
| 4.71957 | 0.996 |
| 4.72113 | 0.996 |
| 4.72268 | 0.996 |
| 4.72424 | 0.996 |
| 4.725799999999999 | 0.996 |
| 4.72735 | 0.996 |
| 4.72891 | 0.996 |
| 4.73046 | 0.996 |
| 4.73202 | 0.996 |
| 4.73358 | 0.996 |
| 4.73513 | 0.996 |
| 4.73669 | 0.996 |
| 4.73824 | 0.996 |
| 4.7398 | 0.996 |
| 4.74136 | 0.996 |
| 4.74291 | 0.996 |
| 4.74447 | 0.996 |
| 4.74603 | 0.996 |
| 4.74758 | 0.996 |
| 4.74914 | 0.996 |
| 4.75069 | 0.996 |
| 4.75225 | 0.996 |
| 4.75381 | 0.996 |
| 4.75536 | 0.996 |
| 4.75692 | 0.996 |
| 4.75847 | 0.996 |
| 4.76003 | 0.996 |
| 4.76159 | 0.996 |
| 4.76314 | 0.996 |
| 4.7647 | 0.996 |
| 4.76626 | 0.996 |
| 4.76781 | 0.996 |
| 4.76937 | 0.996 |
| 4.77092 | 0.996 |
| 4.77248 | 0.996 |
| 4.77404 | 0.996 |
| 4.77559 | 0.996 |
| 4.77715 | 0.996 |
| 4.7787 | 0.996 |
| 4.78026 | 0.996 |
| 4.78182 | 0.996 |
| 4.78337 | 0.996 |
| 4.78493 | 0.996 |
| 4.78649 | 0.996 |
| 4.78804 | 0.996 |
| 4.7896 | 0.996 |
| 4.79115 | 0.996 |
| 4.792709999999999 | 0.996 |
| 4.79427 | 0.996 |
| 4.79582 | 0.996 |
| 4.79738 | 0.996 |
| 4.79893 | 0.996 |
| 4.80049 | 0.996 |
| 4.80205 | 0.996 |
| 4.8036 | 0.996 |
| 4.80516 | 0.996 |
| 4.80672 | 0.996 |
| 4.80827 | 0.996 |
| 4.80983 | 0.996 |
| 4.81138 | 0.996 |
| 4.81294 | 0.996 |
| 4.8145 | 0.996 |
| 4.81605 | 0.996 |
| 4.81761 | 0.996 |
| 4.81916 | 0.996 |
| 4.82072 | 0.996 |
| 4.82228 | 0.996 |
| 4.82383 | 0.996 |
| 4.82539 | 0.996 |
| 4.82695 | 0.996 |
| 4.8285 | 0.996 |
| 4.83006 | 0.996 |
| 4.83161 | 0.997 |
| 4.83317 | 0.997 |
| 4.83473 | 0.997 |
| 4.83628 | 0.997 |
| 4.83784 | 0.997 |
| 4.83939 | 0.997 |
| 4.84095 | 0.997 |
| 4.84251 | 0.997 |
| 4.84406 | 0.997 |
| 4.84562 | 0.997 |
| 4.84718 | 0.997 |
| 4.84873 | 0.997 |
| 4.85029 | 0.997 |
| 4.85184 | 0.997 |
| 4.8534 | 0.997 |
| 4.85496 | 0.997 |
| 4.85651 | 0.997 |
| 4.85807 | 0.997 |
| 4.85962 | 0.997 |
| 4.86118 | 0.997 |
| 4.86274 | 0.997 |
| 4.86429 | 0.997 |
| 4.86585 | 0.997 |
| 4.86741 | 0.997 |
| 4.86896 | 0.997 |
| 4.87052 | 0.997 |
| 4.87207 | 0.997 |
| 4.87363 | 0.997 |
| 4.87519 | 0.997 |
| 4.87674 | 0.997 |
| 4.8783 | 0.997 |
| 4.87985 | 0.997 |
| 4.88141 | 0.997 |
| 4.88297 | 0.997 |
| 4.88452 | 0.997 |
| 4.88608 | 0.997 |
| 4.88764 | 0.997 |
| 4.88919 | 0.997 |
| 4.89075 | 0.997 |
| 4.8923 | 0.997 |
| 4.89386 | 0.997 |
| 4.89542 | 0.997 |
| 4.89697 | 0.997 |
| 4.89853 | 0.997 |
| 4.90008 | 0.997 |
| 4.90164 | 0.997 |
| 4.9032 | 0.997 |
| 4.90475 | 0.997 |
| 4.90631 | 0.997 |
| 4.90787 | 0.997 |
| 4.90942 | 0.997 |
| 4.91098 | 0.997 |
| 4.91253 | 0.997 |
| 4.91409 | 0.997 |
| 4.91565 | 0.997 |
| 4.9172 | 0.997 |
| 4.91876 | 0.997 |
| 4.92031 | 0.997 |
| 4.92187 | 0.997 |
| 4.92343 | 0.997 |
| 4.92498 | 0.997 |
| 4.92654 | 0.997 |
| 4.9281 | 0.997 |
| 4.92965 | 0.997 |
| 4.93121 | 0.997 |
| 4.93276 | 0.997 |
| 4.93432 | 0.997 |
| 4.93588 | 0.997 |
| 4.93743 | 0.997 |
| 4.93899 | 0.997 |
| 4.94054 | 0.997 |
| 4.9421 | 0.997 |
| 4.94366 | 0.997 |
| 4.94521 | 0.997 |
| 4.94677 | 0.997 |
| 4.94833 | 0.997 |
| 4.94988 | 0.997 |
| 4.95144 | 0.997 |
| 4.95299 | 0.997 |
| 4.95455 | 0.997 |
| 4.95611 | 0.997 |
| 4.95766 | 0.997 |
| 4.95922 | 0.997 |
| 4.96077 | 0.997 |
| 4.96233 | 0.997 |
| 4.96389 | 0.997 |
| 4.96544 | 0.997 |
| 4.967 | 0.997 |
| 4.96856 | 0.997 |
| 4.97011 | 0.997 |
| 4.97167 | 0.997 |
| 4.97322 | 0.997 |
| 4.97478 | 0.997 |
| 4.97634 | 0.997 |
| 4.97789 | 0.997 |
| 4.97945 | 0.997 |
| 4.981 | 0.997 |
| 4.98256 | 0.997 |
| 4.98412 | 0.997 |
| 4.98567 | 0.997 |
| 4.98723 | 0.997 |
| 4.98879 | 0.997 |
| 4.99034 | 0.997 |
| 4.9919 | 0.997 |
| 4.99345 | 0.997 |
| 4.99501 | 0.997 |
| 4.99657 | 0.997 |
| 4.99812 | 0.997 |
| 4.99968 | 0.997 |
| 5.00123 | 0.997 |
| 5.00279 | 0.997 |
| 5.00435 | 0.997 |
| 5.0059 | 0.997 |
| 5.00746 | 0.997 |
| 5.00902 | 0.997 |
| 5.01057 | 0.997 |
| 5.01213 | 0.997 |
| 5.01368 | 0.997 |
| 5.01524 | 0.997 |
| 5.0168 | 0.997 |
| 5.01835 | 0.997 |
| 5.01991 | 0.997 |
| 5.02146 | 0.997 |
| 5.02302 | 0.997 |
| 5.02458 | 0.997 |
| 5.02613 | 0.997 |
| 5.02769 | 0.997 |
| 5.02925 | 0.997 |
| 5.0308 | 0.997 |
| 5.03236 | 0.997 |
| 5.03391 | 0.997 |
| 5.03547 | 0.997 |
| 5.03703 | 0.997 |
| 5.03858 | 0.997 |
| 5.04014 | 0.997 |
| 5.04169 | 0.997 |
| 5.04325 | 0.997 |
| 5.04481 | 0.997 |
| 5.04636 | 0.997 |
| 5.04792 | 0.997 |
| 5.04948 | 0.997 |
| 5.05103 | 0.997 |
| 5.05259 | 0.997 |
| 5.05414 | 0.997 |
| 5.0557 | 0.997 |
| 5.05726 | 0.997 |
| 5.05881 | 0.997 |
| 5.06037 | 0.997 |
| 5.06193 | 0.997 |
| 5.06348 | 0.997 |
| 5.06504 | 0.997 |
| 5.06659 | 0.997 |
| 5.06815 | 0.997 |
| 5.06971 | 0.997 |
| 5.07126 | 0.997 |
| 5.07282 | 0.997 |
| 5.07437 | 0.997 |
| 5.07593 | 0.997 |
| 5.07749 | 0.997 |
| 5.07904 | 0.997 |
| 5.0806 | 0.997 |
| 5.08216 | 0.997 |
| 5.08371 | 0.997 |
| 5.08527 | 0.997 |
| 5.08682 | 0.997 |
| 5.08838 | 0.997 |
| 5.08994 | 0.997 |
| 5.09149 | 0.998 |
| 5.09305 | 0.998 |
| 5.0946 | 0.998 |
| 5.09616 | 0.998 |
| 5.09772 | 0.998 |
| 5.09927 | 0.998 |
| 5.10083 | 0.998 |
| 5.10239 | 0.998 |
| 5.10394 | 0.998 |
| 5.1055 | 0.998 |
| 5.10705 | 0.998 |
| 5.10861 | 0.998 |
| 5.11017 | 0.998 |
| 5.11172 | 0.998 |
| 5.11328 | 0.998 |
| 5.11483 | 0.998 |
| 5.11639 | 0.998 |
| 5.11795 | 0.998 |
| 5.1195 | 0.998 |
| 5.12106 | 0.998 |
| 5.12262 | 0.998 |
| 5.12417 | 0.998 |
| 5.12573 | 0.998 |
| 5.12728 | 0.998 |
| 5.12884 | 0.998 |
| 5.1304 | 0.998 |
| 5.13195 | 0.998 |
| 5.13351 | 0.998 |
| 5.13506 | 0.998 |
| 5.13662 | 0.998 |
| 5.13818 | 0.998 |
| 5.13973 | 0.998 |
| 5.14129 | 0.998 |
| 5.14285 | 0.998 |
| 5.1444 | 0.998 |
| 5.14596 | 0.998 |
| 5.14751 | 0.998 |
| 5.14907 | 0.998 |
| 5.15063 | 0.998 |
| 5.15218 | 0.998 |
| 5.15374 | 0.998 |
| 5.15529 | 0.998 |
| 5.15685 | 0.998 |
| 5.15841 | 0.998 |
| 5.15996 | 0.998 |
| 5.16152 | 0.998 |
| 5.16308 | 0.998 |
| 5.16463 | 0.998 |
| 5.16619 | 0.998 |
| 5.16774 | 0.998 |
| 5.1693 | 0.998 |
| 5.17086 | 0.998 |
| 5.17241 | 0.998 |
| 5.17397 | 0.998 |
| 5.17552 | 0.998 |
| 5.17708 | 0.998 |
| 5.17864 | 0.998 |
| 5.18019 | 0.998 |
| 5.18175 | 0.998 |
| 5.18331 | 0.998 |
| 5.18486 | 0.998 |
| 5.18642 | 0.998 |
| 5.18797 | 0.998 |
| 5.18953 | 0.998 |
| 5.19109 | 0.998 |
| 5.19264 | 0.998 |
| 5.1942 | 0.998 |
| 5.19575 | 0.998 |
| 5.19731 | 0.998 |
| 5.19887 | 0.998 |
| 5.20042 | 0.998 |
| 5.20198 | 0.998 |
| 5.20354 | 0.998 |
| 5.20509 | 0.998 |
| 5.20665 | 0.998 |
| 5.2082 | 0.998 |
| 5.20976 | 0.998 |
| 5.21132 | 0.998 |
| 5.21287 | 0.998 |
| 5.21443 | 0.998 |
| 5.21598 | 0.998 |
| 5.21754 | 0.998 |
| 5.2191 | 0.998 |
| 5.22065 | 0.998 |
| 5.22221 | 0.998 |
| 5.22377 | 0.998 |
| 5.22532 | 0.998 |
| 5.22688 | 0.998 |
| 5.22843 | 0.998 |
| 5.22999 | 0.998 |
| 5.23155 | 0.998 |
| 5.2331 | 0.998 |
| 5.23466 | 0.998 |
| 5.23621 | 0.998 |
| 5.23777 | 0.998 |
| 5.23933 | 0.998 |
| 5.24088 | 0.998 |
| 5.24244 | 0.998 |
| 5.244 | 0.998 |
| 5.24555 | 0.998 |
| 5.24711 | 0.998 |
| 5.24866 | 0.998 |
| 5.25022 | 0.998 |
| 5.25178 | 0.998 |
| 5.25333 | 0.998 |
| 5.25489 | 0.998 |
| 5.25644 | 0.998 |
| 5.258 | 0.998 |
| 5.25956 | 0.998 |
| 5.26111 | 0.998 |
| 5.26267 | 0.998 |
| 5.26423 | 0.998 |
| 5.26578 | 0.998 |
| 5.26734 | 0.998 |
| 5.26889 | 0.998 |
| 5.27045 | 0.998 |
| 5.27201 | 0.998 |
| 5.27356 | 0.998 |
| 5.27512 | 0.998 |
| 5.27667 | 0.998 |
| 5.27823 | 0.998 |
| 5.27979 | 0.998 |
| 5.28134 | 0.998 |
| 5.2829 | 0.998 |
| 5.28446 | 0.998 |
| 5.28601 | 0.998 |
| 5.28757 | 0.998 |
| 5.28912 | 0.998 |
| 5.29068 | 0.998 |
| 5.29224 | 0.998 |
| 5.29379 | 0.998 |
| 5.29535 | 0.998 |
| 5.2969 | 0.998 |
| 5.29846 | 0.998 |
| 5.30002 | 0.998 |
| 5.30157 | 0.998 |
| 5.30313 | 0.998 |
| 5.30469 | 0.998 |
| 5.30624 | 0.998 |
| 5.3078 | 0.998 |
| 5.30935 | 0.998 |
| 5.31091 | 0.998 |
| 5.31247 | 0.998 |
| 5.31402 | 0.998 |
| 5.31558 | 0.998 |
| 5.31713 | 0.998 |
| 5.31869 | 0.998 |
| 5.32025 | 0.998 |
| 5.3218 | 0.998 |
| 5.32336 | 0.998 |
| 5.32492 | 0.998 |
| 5.32647 | 0.998 |
| 5.32803 | 0.998 |
| 5.32958 | 0.998 |
| 5.33114 | 0.998 |
| 5.3327 | 0.998 |
| 5.33425 | 0.998 |
| 5.33581 | 0.998 |
| 5.33736 | 0.998 |
| 5.33892 | 0.998 |
| 5.34048 | 0.998 |
| 5.34203 | 0.998 |
| 5.34359 | 0.998 |
| 5.34515 | 0.998 |
| 5.3467 | 0.998 |
| 5.34826 | 0.998 |
| 5.34981 | 0.998 |
| 5.35137 | 0.998 |
| 5.35293 | 0.998 |
| 5.35448 | 0.998 |
| 5.35604 | 0.998 |
| 5.35759 | 0.998 |
| 5.35915 | 0.998 |
| 5.36071 | 0.998 |
| 5.36226 | 0.998 |
| 5.36382 | 0.998 |
| 5.36538 | 0.998 |
| 5.36693 | 0.998 |
| 5.36849 | 0.998 |
| 5.37004 | 0.998 |
| 5.3716 | 0.998 |
| 5.37316 | 0.998 |
| 5.37471 | 0.998 |
| 5.37627 | 0.998 |
| 5.37782 | 0.998 |
| 5.37938 | 0.998 |
| 5.38094 | 0.998 |
| 5.38249 | 0.998 |
| 5.38405 | 0.998 |
| 5.38561 | 0.998 |
| 5.38716 | 0.998 |
| 5.38872 | 0.998 |
| 5.39027 | 0.998 |
| 5.39183 | 0.998 |
| 5.39339 | 0.998 |
| 5.39494 | 0.998 |
| 5.3965 | 0.998 |
| 5.39805 | 0.998 |
| 5.39961 | 0.998 |
| 5.40117 | 0.998 |
| 5.40272 | 0.998 |
| 5.40428 | 0.998 |
| 5.40584 | 0.998 |
| 5.40739 | 0.998 |
| 5.40895 | 0.998 |
| 5.4105 | 0.998 |
| 5.41206 | 0.998 |
| 5.41362 | 0.998 |
| 5.41517 | 0.998 |
| 5.41673 | 0.998 |
| 5.41828 | 0.998 |
| 5.41984 | 0.998 |
| 5.4214 | 0.998 |
| 5.42295 | 0.998 |
| 5.42451 | 0.998 |
| 5.42607 | 0.998 |
| 5.42762 | 0.998 |
| 5.42918 | 0.998 |
| 5.43073 | 0.998 |
| 5.43229 | 0.998 |
| 5.43385 | 0.998 |
| 5.4354 | 0.998 |
| 5.43696 | 0.998 |
| 5.43851 | 0.998 |
| 5.44007 | 0.998 |
| 5.44163 | 0.998 |
| 5.44318 | 0.998 |
| 5.44474 | 0.998 |
| 5.4463 | 0.998 |
| 5.44785 | 0.998 |
| 5.44941 | 0.998 |
| 5.45096 | 0.998 |
| 5.45252 | 0.998 |
| 5.45408 | 0.998 |
| 5.45563 | 0.998 |
| 5.45719 | 0.998 |
| 5.45874 | 0.998 |
| 5.4603 | 0.998 |
| 5.46186 | 0.998 |
| 5.46341 | 0.998 |
| 5.46497 | 0.998 |
| 5.46653 | 0.998 |
| 5.46808 | 0.998 |
| 5.46964 | 0.998 |
| 5.47119 | 0.998 |
| 5.47275 | 0.998 |
| 5.47431 | 0.998 |
| 5.47586 | 0.998 |
| 5.47742 | 0.998 |
| 5.47897 | 0.998 |
| 5.48053 | 0.998 |
| 5.48209 | 0.998 |
| 5.48364 | 0.998 |
| 5.4852 | 0.998 |
| 5.48676 | 0.998 |
| 5.48831 | 0.998 |
| 5.48987 | 0.998 |
| 5.49142 | 0.998 |
| 5.49298 | 0.998 |
| 5.49454 | 0.998 |
| 5.49609 | 0.998 |
| 5.49765 | 0.998 |
| 5.49921 | 0.998 |
| 5.50076 | 0.998 |
| 5.50232 | 0.998 |
| 5.50387 | 0.998 |
| 5.50543 | 0.998 |
| 5.50699 | 0.998 |
| 5.50854 | 0.999 |
| 5.5101 | 0.999 |
| 5.51165 | 0.999 |
| 5.51321 | 0.999 |
| 5.51477 | 0.999 |
| 5.51632 | 0.999 |
| 5.51788 | 0.999 |
| 5.51944 | 0.999 |
| 5.52099 | 0.999 |
| 5.52255 | 0.999 |
| 5.5241 | 0.999 |
| 5.52566 | 0.999 |
| 5.52722 | 0.999 |
| 5.52877 | 0.999 |
| 5.53033 | 0.999 |
| 5.53188 | 0.999 |
| 5.53344 | 0.999 |
| 5.535 | 0.999 |
| 5.53655 | 0.999 |
| 5.53811 | 0.999 |
| 5.53967 | 0.999 |
| 5.54122 | 0.999 |
| 5.54278 | 0.999 |
| 5.54433 | 0.999 |
| 5.54589 | 0.999 |
| 5.54745 | 0.999 |
| 5.549 | 0.999 |
| 5.55056 | 0.999 |
| 5.55211 | 0.999 |
| 5.55367 | 0.999 |
| 5.55523 | 0.999 |
| 5.55678 | 0.999 |
| 5.55834 | 0.999 |
| 5.5599 | 0.999 |
| 5.56145 | 0.999 |
| 5.56301 | 0.999 |
| 5.56456 | 0.999 |
| 5.56612 | 0.999 |
| 5.56768 | 0.999 |
| 5.56923 | 0.999 |
| 5.57079 | 0.999 |
| 5.57234 | 0.999 |
| 5.5739 | 0.999 |
| 5.57546 | 0.999 |
| 5.57701 | 0.999 |
| 5.57857 | 0.999 |
| 5.58013 | 0.999 |
| 5.58168 | 0.999 |
| 5.58324 | 0.999 |
| 5.58479 | 0.999 |
| 5.58635 | 0.999 |
| 5.58791 | 0.999 |
| 5.58946 | 0.999 |
| 5.59102 | 0.999 |
| 5.59257 | 0.999 |
| 5.59413 | 0.999 |
| 5.59569 | 0.999 |
| 5.59724 | 0.999 |
| 5.5988 | 0.999 |
| 5.60036 | 0.999 |
| 5.60191 | 0.999 |
| 5.60347 | 0.999 |
| 5.60502 | 0.999 |
| 5.60658 | 0.999 |
| 5.60814 | 0.999 |
| 5.60969 | 0.999 |
| 5.61125 | 0.999 |
| 5.6128 | 0.999 |
| 5.614359999999999 | 0.999 |
| 5.61592 | 0.999 |
| 5.61747 | 0.999 |
| 5.61903 | 0.999 |
| 5.62059 | 0.999 |
| 5.62214 | 0.999 |
| 5.6237 | 0.999 |
| 5.62525 | 0.999 |
| 5.62681 | 0.999 |
| 5.62837 | 0.999 |
| 5.62992 | 0.999 |
| 5.63148 | 0.999 |
| 5.63303 | 0.999 |
| 5.63459 | 0.999 |
| 5.63615 | 0.999 |
| 5.6377 | 0.999 |
| 5.63926 | 0.999 |
| 5.64082 | 0.999 |
| 5.64237 | 0.999 |
| 5.64393 | 0.999 |
| 5.64548 | 0.999 |
| 5.64704 | 0.999 |
| 5.6486 | 0.999 |
| 5.65015 | 0.999 |
| 5.651709999999999 | 0.999 |
| 5.65326 | 0.999 |
| 5.65482 | 0.999 |
| 5.65638 | 0.999 |
| 5.65793 | 0.999 |
| 5.65949 | 0.999 |
| 5.66105 | 0.999 |
| 5.6626 | 0.999 |
| 5.66416 | 0.999 |
| 5.66571 | 0.999 |
| 5.66727 | 0.999 |
| 5.66883 | 0.999 |
| 5.67038 | 0.999 |
| 5.67194 | 0.999 |
| 5.67349 | 0.999 |
| 5.67505 | 0.999 |
| 5.67661 | 0.999 |
| 5.67816 | 0.999 |
| 5.67972 | 0.999 |
| 5.68128 | 0.999 |
| 5.68283 | 0.999 |
| 5.68439 | 0.999 |
| 5.68594 | 0.999 |
| 5.6875 | 0.999 |
| 5.689059999999999 | 0.999 |
| 5.69061 | 0.999 |
| 5.69217 | 0.999 |
| 5.69372 | 0.999 |
| 5.69528 | 0.999 |
| 5.69684 | 0.999 |
| 5.69839 | 0.999 |
| 5.69995 | 0.999 |
| 5.70151 | 0.999 |
| 5.70306 | 0.999 |
| 5.70462 | 0.999 |
| 5.70617 | 0.999 |
| 5.70773 | 0.999 |
| 5.70929 | 0.999 |
| 5.71084 | 0.999 |
| 5.7124 | 0.999 |
| 5.71395 | 0.999 |
| 5.71551 | 0.999 |
| 5.71707 | 0.999 |
| 5.71862 | 0.999 |
| 5.72018 | 0.999 |
| 5.72174 | 0.999 |
| 5.72329 | 0.999 |
| 5.72485 | 0.999 |
| 5.7264 | 0.999 |
| 5.72796 | 0.999 |
| 5.72952 | 0.999 |
| 5.73107 | 0.999 |
| 5.73263 | 0.999 |
| 5.73418 | 0.999 |
| 5.73574 | 0.999 |
| 5.7373 | 0.999 |
| 5.73885 | 0.999 |
| 5.74041 | 0.999 |
| 5.74197 | 0.999 |
| 5.74352 | 0.999 |
| 5.74508 | 0.999 |
| 5.74663 | 0.999 |
| 5.74819 | 0.999 |
| 5.74975 | 0.999 |
| 5.7513 | 0.999 |
| 5.75286 | 0.999 |
| 5.75441 | 0.999 |
| 5.75597 | 0.999 |
| 5.75753 | 0.999 |
| 5.75908 | 0.999 |
| 5.76064 | 0.999 |
| 5.7622 | 0.999 |
| 5.76375 | 0.999 |
| 5.76531 | 0.999 |
| 5.76686 | 0.999 |
| 5.76842 | 0.999 |
| 5.76998 | 0.999 |
| 5.77153 | 0.999 |
| 5.77309 | 0.999 |
| 5.77464 | 0.999 |
| 5.7762 | 0.999 |
| 5.77776 | 0.999 |
| 5.77931 | 0.999 |
| 5.78087 | 0.999 |
| 5.78243 | 0.999 |
| 5.78398 | 0.999 |
| 5.78554 | 0.999 |
| 5.78709 | 0.999 |
| 5.78865 | 0.999 |
| 5.79021 | 0.999 |
| 5.79176 | 0.999 |
| 5.793319999999999 | 0.999 |
| 5.79487 | 0.999 |
| 5.79643 | 0.999 |
| 5.79799 | 0.999 |
| 5.79954 | 0.999 |
| 5.8011 | 0.999 |
| 5.80266 | 0.999 |
| 5.80421 | 0.999 |
| 5.80577 | 0.999 |
| 5.80732 | 0.999 |
| 5.80888 | 0.999 |
| 5.81044 | 0.999 |
| 5.81199 | 0.999 |
| 5.81355 | 0.999 |
| 5.8151 | 0.999 |
| 5.81666 | 0.999 |
| 5.81822 | 0.999 |
| 5.81977 | 0.999 |
| 5.82133 | 0.999 |
| 5.82289 | 0.999 |
| 5.82444 | 0.999 |
| 5.826 | 0.999 |
| 5.82755 | 0.999 |
| 5.82911 | 0.999 |
| 5.83067 | 0.999 |
| 5.83222 | 0.999 |
| 5.83378 | 0.999 |
| 5.83533 | 0.999 |
| 5.83689 | 0.999 |
| 5.83845 | 0.999 |
| 5.84 | 0.999 |
| 5.84156 | 0.999 |
| 5.84312 | 0.999 |
| 5.84467 | 0.999 |
| 5.84623 | 0.999 |
| 5.84778 | 0.999 |
| 5.84934 | 0.999 |
| 5.8509 | 0.999 |
| 5.85245 | 0.999 |
| 5.85401 | 0.999 |
| 5.85556 | 0.999 |
| 5.85712 | 0.999 |
| 5.85868 | 0.999 |
| 5.86023 | 0.999 |
| 5.86179 | 0.999 |
| 5.86335 | 0.999 |
| 5.8649 | 0.999 |
| 5.86646 | 0.999 |
| 5.86801 | 0.999 |
| 5.86957 | 0.999 |
| 5.87113 | 0.999 |
| 5.87268 | 0.999 |
| 5.87424 | 0.999 |
| 5.87579 | 0.999 |
| 5.87735 | 0.999 |
| 5.87891 | 0.999 |
| 5.88046 | 0.999 |
| 5.88202 | 0.999 |
| 5.88358 | 0.999 |
| 5.88513 | 0.999 |
| 5.88669 | 0.999 |
| 5.88824 | 0.999 |
| 5.8898 | 0.999 |
| 5.89136 | 0.999 |
| 5.89291 | 0.999 |
| 5.89447 | 0.999 |
| 5.89602 | 0.999 |
| 5.89758 | 0.999 |
| 5.89914 | 0.999 |
| 5.90069 | 0.999 |
| 5.90225 | 0.999 |
| 5.90381 | 0.999 |
| 5.90536 | 0.999 |
| 5.90692 | 0.999 |
| 5.90847 | 0.999 |
| 5.91003 | 0.999 |
| 5.91159 | 0.999 |
| 5.91314 | 0.999 |
| 5.9147 | 0.999 |
| 5.91626 | 0.999 |
| 5.91781 | 0.999 |
| 5.91937 | 0.999 |
| 5.92092 | 0.999 |
| 5.92248 | 0.999 |
| 5.92404 | 0.999 |
| 5.92559 | 0.999 |
| 5.92715 | 0.999 |
| 5.9287 | 0.999 |
| 5.93026 | 0.999 |
| 5.93182 | 0.999 |
| 5.93337 | 0.999 |
| 5.93493 | 0.999 |
| 5.93649 | 0.999 |
| 5.93804 | 0.999 |
| 5.9396 | 0.999 |
| 5.94115 | 0.999 |
| 5.94271 | 0.999 |
| 5.94427 | 0.999 |
| 5.94582 | 0.999 |
| 5.94738 | 0.999 |
| 5.94893 | 0.999 |
| 5.95049 | 0.999 |
| 5.95205 | 0.999 |
| 5.9536 | 0.999 |
| 5.95516 | 0.999 |
| 5.95672 | 0.999 |
| 5.95827 | 0.999 |
| 5.95983 | 0.999 |
| 5.96138 | 0.999 |
| 5.96294 | 0.999 |
| 5.9645 | 0.999 |
| 5.96605 | 0.999 |
| 5.96761 | 0.999 |
| 5.96916 | 0.999 |
| 5.97072 | 0.999 |
| 5.97228 | 0.999 |
| 5.97383 | 0.999 |
| 5.97539 | 0.999 |
| 5.97695 | 0.999 |
| 5.9785 | 0.999 |
| 5.98006 | 0.999 |
| 5.98161 | 0.999 |
| 5.98317 | 0.999 |
| 5.98473 | 0.999 |
| 5.98628 | 0.999 |
| 5.98784 | 0.999 |
| 5.98939 | 0.999 |
| 5.99095 | 0.999 |
| 5.99251 | 0.999 |
| 5.99406 | 0.999 |
| 5.99562 | 0.999 |
| 5.99718 | 0.999 |
| 5.99873 | 0.999 |
| 6.00029 | 0.999 |
| 6.00184 | 0.999 |
| 6.0034 | 0.999 |
| 6.00496 | 0.999 |
| 6.00651 | 0.999 |
| 6.00807 | 0.999 |
| 6.00962 | 0.999 |
| 6.01118 | 0.999 |
| 6.01274 | 0.999 |
| 6.01429 | 0.999 |
| 6.01585 | 0.999 |
| 6.01741 | 0.999 |
| 6.01896 | 0.999 |
| 6.02052 | 0.999 |
| 6.02207 | 0.999 |
| 6.02363 | 0.999 |
| 6.02519 | 0.999 |
| 6.02674 | 0.999 |
| 6.0283 | 0.999 |
| 6.02985 | 0.999 |
| 6.03141 | 0.999 |
| 6.03297 | 0.999 |
| 6.03452 | 0.999 |
| 6.03608 | 0.999 |
| 6.03764 | 0.999 |
| 6.03919 | 0.999 |
| 6.04075 | 0.999 |
| 6.0423 | 0.999 |
| 6.04386 | 0.999 |
| 6.04542 | 0.999 |
| 6.04697 | 0.999 |
| 6.04853 | 0.999 |
| 6.05008 | 0.999 |
| 6.05164 | 0.999 |
| 6.0532 | 0.999 |
| 6.05475 | 0.999 |
| 6.05631 | 0.999 |
| 6.05787 | 0.999 |
| 6.05942 | 0.999 |
| 6.06098 | 0.999 |
| 6.06253 | 0.999 |
| 6.06409 | 0.999 |
| 6.06565 | 0.999 |
| 6.0672 | 0.999 |
| 6.06876 | 0.999 |
| 6.07031 | 0.999 |
| 6.07187 | 0.999 |
| 6.07343 | 0.999 |
| 6.07498 | 0.999 |
| 6.07654 | 0.999 |
| 6.0781 | 0.999 |
| 6.07965 | 0.999 |
| 6.08121 | 0.999 |
| 6.08276 | 0.999 |
| 6.08432 | 0.999 |
| 6.08588 | 0.999 |
| 6.08743 | 0.999 |
| 6.08899 | 0.999 |
| 6.09054 | 0.999 |
| 6.0921 | 0.999 |
| 6.09366 | 0.999 |
| 6.09521 | 0.999 |
| 6.09677 | 0.999 |
| 6.09833 | 0.999 |
| 6.09988 | 0.999 |
| 6.10144 | 0.999 |
| 6.10299 | 0.999 |
| 6.10455 | 0.999 |
| 6.10611 | 0.999 |
| 6.10766 | 0.999 |
| 6.10922 | 0.999 |
| 6.11077 | 0.999 |
| 6.11233 | 0.999 |
| 6.11389 | 0.999 |
| 6.11544 | 0.999 |
| 6.117 | 0.999 |
| 6.11856 | 0.999 |
| 6.12011 | 0.999 |
| 6.12167 | 0.999 |
| 6.12322 | 0.999 |
| 6.12478 | 0.999 |
| 6.12634 | 0.999 |
| 6.12789 | 0.999 |
| 6.12945 | 0.999 |
| 6.131 | 0.999 |
| 6.13256 | 0.999 |
| 6.13412 | 0.999 |
| 6.13567 | 0.999 |
| 6.13723 | 0.999 |
| 6.13879 | 0.999 |
| 6.14034 | 0.999 |
| 6.1419 | 0.999 |
| 6.14345 | 0.999 |
| 6.14501 | 0.999 |
| 6.14657 | 0.999 |
| 6.14812 | 0.999 |
| 6.14968 | 0.999 |
| 6.15123 | 0.999 |
| 6.15279 | 0.999 |
| 6.15435 | 0.999 |
| 6.1559 | 0.999 |
| 6.15746 | 0.999 |
| 6.15902 | 0.999 |
| 6.16057 | 0.999 |
| 6.16213 | 0.999 |
| 6.16368 | 0.999 |
| 6.16524 | 0.999 |
| 6.1668 | 0.999 |
| 6.16835 | 0.999 |
| 6.16991 | 0.999 |
| 6.17146 | 0.999 |
| 6.17302 | 0.999 |
| 6.17458 | 0.999 |
| 6.17613 | 0.999 |
| 6.17769 | 0.999 |
| 6.17925 | 0.999 |
| 6.1808 | 0.999 |
| 6.18236 | 0.999 |
| 6.18391 | 0.999 |
| 6.18547 | 0.999 |
| 6.18703 | 0.999 |
| 6.18858 | 0.999 |
| 6.19014 | 0.999 |
| 6.19169 | 0.999 |
| 6.19325 | 0.999 |
| 6.19481 | 0.999 |
| 6.19636 | 0.999 |
| 6.19792 | 0.999 |
| 6.19948 | 0.999 |
| 6.20103 | 0.999 |
| 6.20259 | 0.999 |
| 6.20414 | 0.999 |
| 6.2057 | 0.999 |
| 6.20726 | 0.999 |
| 6.20881 | 0.999 |
| 6.21037 | 0.999 |
| 6.21192 | 0.999 |
| 6.21348 | 0.999 |
| 6.21504 | 0.999 |
| 6.21659 | 0.999 |
| 6.21815 | 0.999 |
| 6.21971 | 0.999 |
| 6.22126 | 0.999 |
| 6.22282 | 0.999 |
| 6.22437 | 0.999 |
| 6.22593 | 0.999 |
| 6.22749 | 0.999 |
| 6.22904 | 0.999 |
| 6.2306 | 0.999 |
| 6.23215 | 0.999 |
| 6.23371 | 0.999 |
| 6.23527 | 0.999 |
| 6.23682 | 0.999 |
| 6.23838 | 0.999 |
| 6.23994 | 0.999 |
| 6.24149 | 0.999 |
| 6.24305 | 0.999 |
| 6.2446 | 0.999 |
| 6.24616 | 0.999 |
| 6.24772 | 0.999 |
| 6.24927 | 0.999 |
| 6.25083 | 0.999 |
| 6.25238 | 0.999 |
| 6.25394 | 0.999 |
| 6.2555 | 0.999 |
| 6.25705 | 0.999 |
| 6.25861 | 0.999 |
| 6.26017 | 0.999 |
| 6.26172 | 0.999 |
| 6.26328 | 0.999 |
| 6.26483 | 0.999 |
| 6.26639 | 0.999 |
| 6.26795 | 0.999 |
| 6.2695 | 0.999 |
| 6.27106 | 0.999 |
| 6.27261 | 0.999 |
| 6.27417 | 0.999 |
| 6.27573 | 0.999 |
| 6.27728 | 0.999 |
| 6.27884 | 0.999 |
| 6.2804 | 0.999 |
| 6.28195 | 0.999 |
| 6.28351 | 0.999 |
| 6.28506 | 0.999 |
| 6.28662 | 0.999 |
| 6.28818 | 0.999 |
| 6.28973 | 0.999 |
| 6.29129 | 0.999 |
| 6.29284 | 0.999 |
| 6.2944 | 0.999 |
| 6.29596 | 0.999 |
| 6.29751 | 0.999 |
| 6.29907 | 0.999 |
| 6.30063 | 0.999 |
| 6.30218 | 0.999 |
| 6.30374 | 0.999 |
| 6.30529 | 0.999 |
| 6.30685 | 0.999 |
| 6.30841 | 0.999 |
| 6.30996 | 0.999 |
| 6.31152 | 0.999 |
| 6.31307 | 0.999 |
| 6.31463 | 0.999 |
| 6.31619 | 0.999 |
| 6.31774 | 0.999 |
| 6.3193 | 0.999 |
| 6.32086 | 0.999 |
| 6.32241 | 0.999 |
| 6.32397 | 0.999 |
| 6.32552 | 0.999 |
| 6.32708 | 0.999 |
| 6.32864 | 0.999 |
| 6.33019 | 0.999 |
| 6.33175 | 0.999 |
| 6.3333 | 0.999 |
| 6.33486 | 0.999 |
| 6.33642 | 0.999 |
| 6.33797 | 0.999 |
| 6.33953 | 0.999 |
| 6.34109 | 0.999 |
| 6.34264 | 0.999 |
| 6.3442 | 0.999 |
| 6.34575 | 0.999 |
| 6.34731 | 0.999 |
| 6.34887 | 0.999 |
| 6.35042 | 0.999 |
| 6.35198 | 0.999 |
| 6.35354 | 0.999 |
| 6.35509 | 0.999 |
| 6.35665 | 0.999 |
| 6.3582 | 0.999 |
| 6.35976 | 0.999 |
| 6.36132 | 0.999 |
| 6.36287 | 0.999 |
| 6.36443 | 0.999 |
| 6.36598 | 0.999 |
| 6.36754 | 0.999 |
| 6.3691 | 0.999 |
| 6.37065 | 0.999 |
| 6.37221 | 0.999 |
| 6.37377 | 0.999 |
| 6.37532 | 0.999 |
| 6.37688 | 0.999 |
| 6.37843 | 0.999 |
| 6.37999 | 0.999 |
| 6.38155 | 0.999 |
| 6.3831 | 0.999 |
| 6.38466 | 0.999 |
| 6.38621 | 0.999 |
| 6.38777 | 0.999 |
| 6.38933 | 1 |
| 6.39088 | 1 |
| 6.39244 | 1 |
| 6.394 | 1 |
| 6.39555 | 1 |
| 6.39711 | 1 |
| 6.398659999999999 | 1 |
| 6.40022 | 1 |
| 6.40178 | 1 |
| 6.40333 | 1 |
| 6.40489 | 1 |
| 6.40644 | 1 |
| 6.408 | 1 |
| 6.40956 | 1 |
| 6.41111 | 1 |
| 6.41267 | 1 |
| 6.41423 | 1 |
| 6.41578 | 1 |
| 6.41734 | 1 |
| 6.41889 | 1 |
| 6.42045 | 1 |
| 6.42201 | 1 |
| 6.42356 | 1 |
| 6.42512 | 1 |
| 6.42667 | 1 |
| 6.42823 | 1 |
| 6.42979 | 1 |
| 6.43134 | 1 |
| 6.4329 | 1 |
| 6.43446 | 1 |
| 6.43601 | 1 |
| 6.43757 | 1 |
| 6.43912 | 1 |
| 6.44068 | 1 |
| 6.44224 | 1 |
| 6.44379 | 1 |
| 6.44535 | 1 |
| 6.4469 | 1 |
| 6.44846 | 1 |
| 6.45002 | 1 |
| 6.45157 | 1 |
| 6.45313 | 1 |
| 6.45469 | 1 |
| 6.45624 | 1 |
| 6.4578 | 1 |
| 6.45935 | 1 |
| 6.46091 | 1 |
| 6.46247 | 1 |
| 6.46402 | 1 |
| 6.46558 | 1 |
| 6.46713 | 1 |
| 6.46869 | 1 |
| 6.47025 | 1 |
| 6.4718 | 1 |
| 6.47336 | 1 |
| 6.47492 | 1 |
| 6.47647 | 1 |
| 6.47803 | 1 |
| 6.47958 | 1 |
| 6.48114 | 1 |
| 6.4827 | 1 |
| 6.48425 | 1 |
| 6.48581 | 1 |
| 6.48736 | 1 |
| 6.48892 | 1 |
| 6.49048 | 1 |
| 6.49203 | 1 |
| 6.49359 | 1 |
| 6.49515 | 1 |
| 6.4967 | 1 |
| 6.49826 | 1 |
| 6.49981 | 1 |
| 6.50137 | 1 |
| 6.50293 | 1 |
| 6.50448 | 1 |
| 6.50604 | 1 |
| 6.50759 | 1 |
| 6.50915 | 1 |
| 6.51071 | 1 |
| 6.51226 | 1 |
| 6.51382 | 1 |
| 6.51538 | 1 |
| 6.51693 | 1 |
| 6.51849 | 1 |
| 6.52004 | 1 |
| 6.5216 | 1 |
| 6.52316 | 1 |
| 6.52471 | 1 |
| 6.52627 | 1 |
| 6.52782 | 1 |
| 6.52938 | 1 |
| 6.53094 | 1 |
| 6.53249 | 1 |
| 6.53405 | 1 |
| 6.53561 | 1 |
| 6.53716 | 1 |
| 6.53872 | 1 |
| 6.54027 | 1 |
| 6.54183 | 1 |
| 6.54339 | 1 |
| 6.54494 | 1 |
| 6.5465 | 1 |
| 6.54805 | 1 |
| 6.54961 | 1 |
| 6.55117 | 1 |
| 6.55272 | 1 |
| 6.55428 | 1 |
| 6.55584 | 1 |
| 6.55739 | 1 |
| 6.55895 | 1 |
| 6.5605 | 1 |
| 6.56206 | 1 |
| 6.56362 | 1 |
| 6.56517 | 1 |
| 6.56673 | 1 |
| 6.56828 | 1 |
| 6.56984 | 1 |
| 6.5714 | 1 |
| 6.57295 | 1 |
| 6.57451 | 1 |
| 6.57607 | 1 |
| 6.57762 | 1 |
| 6.57918 | 1 |
| 6.58073 | 1 |
| 6.58229 | 1 |
| 6.58385 | 1 |
| 6.5854 | 1 |
| 6.58696 | 1 |
| 6.58851 | 1 |
| 6.59007 | 1 |
| 6.59163 | 1 |
| 6.59318 | 1 |
| 6.59474 | 1 |
| 6.5963 | 1 |
| 6.59785 | 1 |
| 6.59941 | 1 |
| 6.60096 | 1 |
| 6.60252 | 1 |
| 6.60408 | 1 |
| 6.60563 | 1 |
| 6.60719 | 1 |
| 6.60874 | 1 |
| 6.6103 | 1 |
| 6.61186 | 1 |
| 6.61341 | 1 |
| 6.614969999999999 | 1 |
| 6.61653 | 1 |
| 6.61808 | 1 |
| 6.61964 | 1 |
| 6.62119 | 1 |
| 6.62275 | 1 |
| 6.62431 | 1 |
| 6.62586 | 1 |
| 6.62742 | 1 |
| 6.62897 | 1 |
| 6.63053 | 1 |
| 6.63209 | 1 |
| 6.63364 | 1 |
| 6.6352 | 1 |
| 6.63676 | 1 |
| 6.63831 | 1 |
| 6.63987 | 1 |
| 6.64142 | 1 |
| 6.64298 | 1 |
| 6.64454 | 1 |
| 6.64609 | 1 |
| 6.64765 | 1 |
| 6.6492 | 1 |
| 6.65076 | 1 |
| 6.652319999999999 | 1 |
| 6.65387 | 1 |
| 6.65543 | 1 |
| 6.65699 | 1 |
| 6.65854 | 1 |
| 6.6601 | 1 |
| 6.66165 | 1 |
| 6.66321 | 1 |
| 6.66477 | 1 |
| 6.66632 | 1 |
| 6.66788 | 1 |
| 6.66943 | 1 |
| 6.67099 | 1 |
| 6.67255 | 1 |
| 6.6741 | 1 |
| 6.67566 | 1 |
| 6.67722 | 1 |
| 6.67877 | 1 |
| 6.68033 | 1 |
| 6.681879999999999 | 1 |
| 6.68344 | 1 |
| 6.685 | 1 |
| 6.68655 | 1 |
| 6.68811 | 1 |
| 6.68966 | 1 |
| 6.69122 | 1 |
| 6.69278 | 1 |
| 6.69433 | 1 |
| 6.69589 | 1 |
| 6.69745 | 1 |
| 6.699 | 1 |
| 6.70056 | 1 |
| 6.70211 | 1 |
| 6.70367 | 1 |
| 6.70523 | 1 |
| 6.70678 | 1 |
| 6.70834 | 1 |
| 6.70989 | 1 |
| 6.71145 | 1 |
| 6.71301 | 1 |
| 6.71456 | 1 |
| 6.71612 | 1 |
| 6.71768 | 1 |
| 6.71923 | 1 |
| 6.72079 | 1 |
| 6.72234 | 1 |
| 6.7239 | 1 |
| 6.72546 | 1 |
| 6.72701 | 1 |
| 6.72857 | 1 |
| 6.73012 | 1 |
| 6.73168 | 1 |
| 6.73324 | 1 |
| 6.73479 | 1 |
| 6.73635 | 1 |
| 6.73791 | 1 |
| 6.73946 | 1 |
| 6.74102 | 1 |
| 6.74257 | 1 |
| 6.74413 | 1 |
| 6.74569 | 1 |
| 6.74724 | 1 |
| 6.7488 | 1 |
| 6.75035 | 1 |
| 6.75191 | 1 |
| 6.75347 | 1 |
| 6.75502 | 1 |
| 6.75658 | 1 |
| 6.75814 | 1 |
| 6.75969 | 1 |
| 6.76125 | 1 |
| 6.7628 | 1 |
| 6.76436 | 1 |
| 6.76592 | 1 |
| 6.76747 | 1 |
| 6.76903 | 1 |
| 6.77059 | 1 |
| 6.77214 | 1 |
| 6.7737 | 1 |
| 6.77525 | 1 |
| 6.77681 | 1 |
| 6.77837 | 1 |
| 6.77992 | 1 |
| 6.78148 | 1 |
| 6.78303 | 1 |
| 6.78459 | 1 |
| 6.78615 | 1 |
| 6.7877 | 1 |
| 6.78926 | 1 |
| 6.79082 | 1 |
| 6.79237 | 1 |
| 6.793929999999999 | 1 |
| 6.79548 | 1 |
| 6.79704 | 1 |
| 6.7986 | 1 |
| 6.80015 | 1 |
| 6.80171 | 1 |
| 6.80326 | 1 |
| 6.80482 | 1 |
| 6.80638 | 1 |
| 6.80793 | 1 |
| 6.80949 | 1 |
| 6.81105 | 1 |
| 6.8126 | 1 |
| 6.81416 | 1 |
| 6.81571 | 1 |
| 6.81727 | 1 |
| 6.81883 | 1 |
| 6.82038 | 1 |
| 6.82194 | 1 |
| 6.82349 | 1 |
| 6.82505 | 1 |
| 6.82661 | 1 |
| 6.82816 | 1 |
| 6.82972 | 1 |
| 6.83128 | 1 |
| 6.83283 | 1 |
| 6.83439 | 1 |
| 6.83594 | 1 |
| 6.8375 | 1 |
| 6.83906 | 1 |
| 6.84061 | 1 |
| 6.84217 | 1 |
| 6.84372 | 1 |
| 6.84528 | 1 |
| 6.84684 | 1 |
| 6.84839 | 1 |
| 6.84995 | 1 |
| 6.85151 | 1 |
| 6.85306 | 1 |
| 6.85462 | 1 |
| 6.85617 | 1 |
| 6.85773 | 1 |
| 6.85929 | 1 |
| 6.86084 | 1 |
| 6.8624 | 1 |
| 6.86395 | 1 |
| 6.86551 | 1 |
| 6.86707 | 1 |
| 6.86862 | 1 |
| 6.87018 | 1 |
| 6.87174 | 1 |
| 6.87329 | 1 |
| 6.87485 | 1 |
| 6.8764 | 1 |
| 6.87796 | 1 |
| 6.87952 | 1 |
| 6.88107 | 1 |
| 6.88263 | 1 |
| 6.88418 | 1 |
| 6.88574 | 1 |
| 6.8873 | 1 |
| 6.88885 | 1 |
| 6.89041 | 1 |
| 6.89197 | 1 |
| 6.89352 | 1 |
| 6.89508 | 1 |
| 6.89663 | 1 |
| 6.89819 | 1 |
| 6.89975 | 1 |
| 6.9013 | 1 |
| 6.90286 | 1 |
| 6.90441 | 1 |
| 6.90597 | 1 |
| 6.90753 | 1 |
| 6.90908 | 1 |
| 6.91064 | 1 |
| 6.9122 | 1 |
| 6.91375 | 1 |
| 6.91531 | 1 |
| 6.91686 | 1 |
| 6.91842 | 1 |
| 6.91998 | 1 |
| 6.92153 | 1 |
| 6.92309 | 1 |
| 6.92464 | 1 |
| 6.9262 | 1 |
| 6.92776 | 1 |
| 6.92931 | 1 |
| 6.93087 | 1 |
| 6.93243 | 1 |
| 6.93398 | 1 |
| 6.93554 | 1 |
| 6.93709 | 1 |
| 6.93865 | 1 |
| 6.94021 | 1 |
| 6.94176 | 1 |
| 6.94332 | 1 |
| 6.94487 | 1 |
| 6.94643 | 1 |
| 6.94799 | 1 |
| 6.94954 | 1 |
| 6.9511 | 1 |
| 6.95266 | 1 |
| 6.95421 | 1 |
| 6.95577 | 1 |
| 6.95732 | 1 |
| 6.95888 | 1 |
| 6.96044 | 1 |
| 6.96199 | 1 |
| 6.96355 | 1 |
| 6.9651 | 1 |
| 6.96666 | 1 |
| 6.96822 | 1 |
| 6.96977 | 1 |
| 6.97133 | 1 |
| 6.97289 | 1 |
| 6.97444 | 1 |
| 6.976 | 1 |
| 6.97755 | 1 |
| 6.97911 | 1 |
| 6.98067 | 1 |
| 6.98222 | 1 |
| 6.98378 | 1 |
| 6.98533 | 1 |
| 6.98689 | 1 |
| 6.98845 | 1 |
| 6.99 | 1 |
| 6.99156 | 1 |
| 6.99312 | 1 |
| 6.99467 | 1 |
| 6.99623 | 1 |
| 6.99778 | 1 |
| 6.99934 | 1 |
| 7.0009 | 1 |
| 7.00245 | 1 |
| 7.00401 | 1 |
| 7.00556 | 1 |
| 7.00712 | 1 |
| 7.00868 | 1 |
| 7.01023 | 1 |
| 7.01179 | 1 |
| 7.01335 | 1 |
| 7.0149 | 1 |
| 7.01646 | 1 |
| 7.01801 | 1 |
| 7.01957 | 1 |
| 7.02113 | 1 |
| 7.02268 | 1 |
| 7.02424 | 1 |
| 7.02579 | 1 |
| 7.02735 | 1 |
| 7.02891 | 1 |
| 7.03046 | 1 |
| 7.03202 | 1 |
| 7.03358 | 1 |
| 7.03513 | 1 |
| 7.03669 | 1 |
| 7.03824 | 1 |
| 7.0398 | 1 |
| 7.04136 | 1 |
| 7.04291 | 1 |
| 7.04447 | 1 |
| 7.04602 | 1 |
| 7.04758 | 1 |
| 7.04914 | 1 |
| 7.05069 | 1 |
| 7.05225 | 1 |
| 7.05381 | 1 |
| 7.05536 | 1 |
| 7.05692 | 1 |
| 7.05847 | 1 |
| 7.06003 | 1 |
| 7.06159 | 1 |
| 7.06314 | 1 |
| 7.0647 | 1 |
| 7.06625 | 1 |
| 7.06781 | 1 |
| 7.06937 | 1 |
| 7.07092 | 1 |
| 7.07248 | 1 |
| 7.07404 | 1 |
| 7.07559 | 1 |
| 7.07715 | 1 |
| 7.0787 | 1 |
| 7.08026 | 1 |
| 7.08182 | 1 |
| 7.08337 | 1 |
| 7.08493 | 1 |
| 7.08648 | 1 |
| 7.08804 | 1 |
| 7.0896 | 1 |
| 7.09115 | 1 |
| 7.09271 | 1 |
| 7.09427 | 1 |
| 7.09582 | 1 |
| 7.09738 | 1 |
| 7.09893 | 1 |
| 7.10049 | 1 |
| 7.10205 | 1 |
| 7.1036 | 1 |
| 7.10516 | 1 |
| 7.10671 | 1 |
| 7.10827 | 1 |
| 7.10983 | 1 |
| 7.11138 | 1 |
| 7.11294 | 1 |
| 7.1145 | 1 |
| 7.11605 | 1 |
| 7.11761 | 1 |
| 7.11916 | 1 |
| 7.12072 | 1 |
| 7.12228 | 1 |
| 7.12383 | 1 |
| 7.12539 | 1 |
| 7.12694 | 1 |
| 7.1285 | 1 |
| 7.13006 | 1 |
| 7.13161 | 1 |
| 7.13317 | 1 |
| 7.13473 | 1 |
| 7.13628 | 1 |
| 7.13784 | 1 |
| 7.13939 | 1 |
| 7.14095 | 1 |
| 7.14251 | 1 |
| 7.14406 | 1 |
| 7.14562 | 1 |
| 7.14717 | 1 |
| 7.14873 | 1 |
| 7.15029 | 1 |
| 7.15184 | 1 |
| 7.1534 | 1 |
| 7.15496 | 1 |
| 7.15651 | 1 |
| 7.15807 | 1 |
| 7.15962 | 1 |
| 7.16118 | 1 |
| 7.16274 | 1 |
| 7.16429 | 1 |
| 7.16585 | 1 |
| 7.1674 | 1 |
| 7.16896 | 1 |
| 7.17052 | 1 |
| 7.17207 | 1 |
| 7.17363 | 1 |
| 7.17519 | 1 |
| 7.17674 | 1 |
| 7.1783 | 1 |
| 7.17985 | 1 |
| 7.18141 | 1 |
| 7.18297 | 1 |
| 7.18452 | 1 |
| 7.18608 | 1 |
| 7.18763 | 1 |
| 7.18919 | 1 |
| 7.19075 | 1 |
| 7.1923 | 1 |
| 7.19386 | 1 |
| 7.19542 | 1 |
| 7.19697 | 1 |
| 7.19853 | 1 |
| 7.20008 | 1 |
| 7.20164 | 1 |
| 7.2032 | 1 |
| 7.20475 | 1 |
| 7.20631 | 1 |
| 7.20787 | 1 |
| 7.20942 | 1 |
| 7.21098 | 1 |
| 7.21253 | 1 |
| 7.21409 | 1 |
| 7.21565 | 1 |
| 7.2172 | 1 |
| 7.21876 | 1 |
| 7.22031 | 1 |
| 7.22187 | 1 |
| 7.22343 | 1 |
| 7.22498 | 1 |
| 7.22654 | 1 |
| 7.2281 | 1 |
| 7.22965 | 1 |
| 7.23121 | 1 |
| 7.23276 | 1 |
| 7.23432 | 1 |
| 7.23588 | 1 |
| 7.23743 | 1 |
| 7.23899 | 1 |
| 7.24054 | 1 |
| 7.2421 | 1 |
| 7.24366 | 1 |
| 7.24521 | 1 |
| 7.24677 | 1 |
| 7.24833 | 1 |
| 7.24988 | 1 |
| 7.25144 | 1 |
| 7.25299 | 1 |
| 7.25455 | 1 |
| 7.25611 | 1 |
| 7.25766 | 1 |
| 7.25922 | 1 |
| 7.26077 | 1 |
| 7.26233 | 1 |
| 7.26389 | 1 |
| 7.26544 | 1 |
| 7.267 | 1 |
| 7.26856 | 1 |
| 7.27011 | 1 |
| 7.27167 | 1 |
| 7.27322 | 1 |
| 7.27478 | 1 |
| 7.27634 | 1 |
| 7.27789 | 1 |
| 7.27945 | 1 |
| 7.281 | 1 |
| 7.28256 | 1 |
| 7.28412 | 1 |
| 7.28567 | 1 |
| 7.28723 | 1 |
| 7.28879 | 1 |
| 7.29034 | 1 |
| 7.2919 | 1 |
| 7.29345 | 1 |
| 7.29501 | 1 |
| 7.29657 | 1 |
| 7.29812 | 1 |
| 7.29968 | 1 |
| 7.30123 | 1 |
| 7.30279 | 1 |
| 7.30435 | 1 |
| 7.3059 | 1 |
| 7.30746 | 1 |
| 7.30902 | 1 |
| 7.31057 | 1 |
| 7.31213 | 1 |
| 7.31368 | 1 |
| 7.31524 | 1 |
| 7.3168 | 1 |
| 7.31835 | 1 |
| 7.31991 | 1 |
| 7.32146 | 1 |
| 7.32302 | 1 |
| 7.32458 | 1 |
| 7.32613 | 1 |
| 7.32769 | 1 |
| 7.32925 | 1 |
| 7.3308 | 1 |
| 7.33236 | 1 |
| 7.33391 | 1 |
| 7.33547 | 1 |
| 7.33703 | 1 |
| 7.33858 | 1 |
| 7.34014 | 1 |
| 7.34169 | 1 |
| 7.34325 | 1 |
| 7.34481 | 1 |
| 7.34636 | 1 |
| 7.34792 | 1 |
| 7.34948 | 1 |
| 7.35103 | 1 |
| 7.35259 | 1 |
| 7.35414 | 1 |
| 7.3557 | 1 |
| 7.35726 | 1 |
| 7.35881 | 1 |
| 7.36037 | 1 |
| 7.36192 | 1 |
| 7.36348 | 1 |
| 7.36504 | 1 |
| 7.36659 | 1 |
| 7.36815 | 1 |
| 7.36971 | 1 |
| 7.37126 | 1 |
| 7.37282 | 1 |
| 7.37437 | 1 |
| 7.37593 | 1 |
| 7.37749 | 1 |
| 7.37904 | 1 |
| 7.3806 | 1 |
| 7.38215 | 1 |
| 7.38371 | 1 |
| 7.38527 | 1 |
| 7.38682 | 1 |
| 7.38838 | 1 |
| 7.38994 | 1 |
| 7.39149 | 1 |
| 7.39305 | 1 |
| 7.3946 | 1 |
| 7.39616 | 1 |
| 7.39772 | 1 |
| 7.39927 | 1 |
| 7.40083 | 1 |
| 7.40238 | 1 |
| 7.40394 | 1 |
| 7.4055 | 1 |
| 7.40705 | 1 |
| 7.40861 | 1 |
| 7.41017 | 1 |
| 7.41172 | 1 |
| 7.41328 | 1 |
| 7.41483 | 1 |
| 7.41639 | 1 |
| 7.41795 | 1 |
| 7.4195 | 1 |
| 7.42106 | 1 |
| 7.42261 | 1 |
| 7.42417 | 1 |
| 7.42573 | 1 |
| 7.42728 | 1 |
| 7.42884 | 1 |
| 7.4304 | 1 |
| 7.43195 | 1 |
| 7.43351 | 1 |
| 7.43506 | 1 |
| 7.43662 | 1 |
| 7.43818 | 1 |
| 7.43973 | 1 |
| 7.44129 | 1 |
| 7.44284 | 1 |
| 7.4444 | 1 |
| 7.44596 | 1 |
| 7.44751 | 1 |
| 7.44907 | 1 |
| 7.45063 | 1 |
| 7.45218 | 1 |
| 7.45374 | 1 |
| 7.45529 | 1 |
| 7.45685 | 1 |
| 7.45841 | 1 |
| 7.45996 | 1 |
| 7.46152 | 1 |
| 7.46307 | 1 |
| 7.46463 | 1 |
| 7.46619 | 1 |
| 7.46774 | 1 |
| 7.4693 | 1 |
| 7.47086 | 1 |
| 7.47241 | 1 |
| 7.47397 | 1 |
| 7.47552 | 1 |
| 7.47708 | 1 |
| 7.47864 | 1 |
| 7.48019 | 1 |
| 7.48175 | 1 |
| 7.4833 | 1 |
| 7.48486 | 1 |
| 7.48642 | 1 |
| 7.48797 | 1 |
| 7.48953 | 1 |
| 7.49109 | 1 |
| 7.49264 | 1 |
| 7.4942 | 1 |
| 7.49575 | 1 |
| 7.49731 | 1 |
| 7.49887 | 1 |
| 7.50042 | 1 |
| 7.50198 | 1 |
| 7.50353 | 1 |
| 7.50509 | 1 |
| 7.50665 | 1 |
| 7.5082 | 1 |
| 7.50976 | 1 |
| 7.51132 | 1 |
| 7.51287 | 1 |
| 7.51443 | 1 |
| 7.51598 | 1 |
| 7.51754 | 1 |
| 7.5191 | 1 |
| 7.52065 | 1 |
| 7.52221 | 1 |
| 7.52376 | 1 |
| 7.52532 | 1 |
| 7.52688 | 1 |
| 7.52843 | 1 |
| 7.52999 | 1 |
| 7.53155 | 1 |
| 7.5331 | 1 |
| 7.53466 | 1 |
| 7.53621 | 1 |
| 7.53777 | 1 |
| 7.53933 | 1 |
| 7.54088 | 1 |
| 7.54244 | 1 |
| 7.54399 | 1 |
| 7.54555 | 1 |
| 7.54711 | 1 |
| 7.54866 | 1 |
| 7.55022 | 1 |
| 7.55178 | 1 |
| 7.55333 | 1 |
| 7.55489 | 1 |
| 7.55644 | 1 |
| 7.558 | 1 |
| 7.55956 | 1 |
| 7.56111 | 1 |
| 7.56267 | 1 |
| 7.56422 | 1 |
| 7.56578 | 1 |
| 7.56734 | 1 |
| 7.56889 | 1 |
| 7.57045 | 1 |
| 7.57201 | 1 |
| 7.57356 | 1 |
| 7.57512 | 1 |
| 7.57667 | 1 |
| 7.57823 | 1 |
| 7.57979 | 1 |
| 7.58134 | 1 |
| 7.5829 | 1 |
| 7.58445 | 1 |
| 7.58601 | 1 |
| 7.58757 | 1 |
| 7.58912 | 1 |
| 7.59068 | 1 |
| 7.59224 | 1 |
| 7.59379 | 1 |
| 7.59535 | 1 |
| 7.5969 | 1 |
| 7.59846 | 1 |
| 7.60002 | 1 |
| 7.60157 | 1 |
| 7.60313 | 1 |
| 7.60468 | 1 |
| 7.60624 | 1 |
| 7.6078 | 1 |
| 7.60935 | 1 |
| 7.61091 | 1 |
| 7.61247 | 1 |
| 7.61402 | 1 |
| 7.615579999999999 | 1 |
| 7.61713 | 1 |
| 7.61869 | 1 |
| 7.62025 | 1 |
| 7.6218 | 1 |
| 7.62336 | 1 |
| 7.62491 | 1 |
| 7.62647 | 1 |
| 7.62803 | 1 |
| 7.62958 | 1 |
| 7.63114 | 1 |
| 7.6327 | 1 |
| 7.63425 | 1 |
| 7.63581 | 1 |
| 7.63736 | 1 |
| 7.63892 | 1 |
| 7.64048 | 1 |
| 7.64203 | 1 |
| 7.64359 | 1 |
| 7.64515 | 1 |
| 7.6467 | 1 |
| 7.64826 | 1 |
| 7.64981 | 1 |
| 7.65137 | 1 |
| 7.652929999999999 | 1 |
| 7.65448 | 1 |
| 7.65604 | 1 |
| 7.65759 | 1 |
| 7.65915 | 1 |
| 7.66071 | 1 |
| 7.66226 | 1 |
| 7.66382 | 1 |
| 7.66538 | 1 |
| 7.66693 | 1 |
| 7.66849 | 1 |
| 7.67004 | 1 |
| 7.6716 | 1 |
| 7.67316 | 1 |
| 7.67471 | 1 |
| 7.67627 | 1 |
| 7.67782 | 1 |
| 7.67938 | 1 |
| 7.68094 | 1 |
| 7.682489999999999 | 1 |
| 7.68405 | 1 |
| 7.68561 | 1 |
| 7.68716 | 1 |
| 7.68872 | 1 |
| 7.69027 | 1 |
| 7.69183 | 1 |
| 7.69339 | 1 |
| 7.69494 | 1 |
| 7.6965 | 1 |
| 7.69805 | 1 |
| 7.69961 | 1 |
| 7.70117 | 1 |
| 7.70272 | 1 |
| 7.70428 | 1 |
| 7.70584 | 1 |
| 7.70739 | 1 |
| 7.70895 | 1 |
| 7.7105 | 1 |
| 7.71206 | 1 |
| 7.71362 | 1 |
| 7.71517 | 1 |
| 7.71673 | 1 |
| 7.71828 | 1 |
| 7.71984 | 1 |
| 7.7214 | 1 |
| 7.72295 | 1 |
| 7.72451 | 1 |
| 7.72607 | 1 |
| 7.72762 | 1 |
| 7.72918 | 1 |
| 7.73073 | 1 |
| 7.73229 | 1 |
| 7.73385 | 1 |
| 7.7354 | 1 |
| 7.73696 | 1 |
| 7.73851 | 1 |
| 7.74007 | 1 |
| 7.74163 | 1 |
| 7.74318 | 1 |
| 7.74474 | 1 |
| 7.7463 | 1 |
| 7.74785 | 1 |
| 7.74941 | 1 |
| 7.75096 | 1 |
| 7.75252 | 1 |
| 7.75408 | 1 |
| 7.75563 | 1 |
| 7.75719 | 1 |
| 7.75874 | 1 |
| 7.7603 | 1 |
| 7.76186 | 1 |
| 7.76341 | 1 |
| 7.76497 | 1 |
| 7.76653 | 1 |
| 7.76808 | 1 |
| 7.76964 | 1 |
| 7.77119 | 1 |
| 7.77275 | 1 |
| 7.77431 | 1 |
| 7.77586 | 1 |
| 7.77742 | 1 |
| 7.77897 | 1 |
| 7.78053 | 1 |
| 7.78209 | 1 |
| 7.78364 | 1 |
| 7.7852 | 1 |
| 7.78676 | 1 |
| 7.78831 | 1 |
| 7.78987 | 1 |
| 7.791419999999999 | 1 |
| 7.79298 | 1 |
| 7.794539999999999 | 1 |
| 7.79609 | 1 |
| 7.79765 | 1 |
| 7.7992 | 1 |
| 7.80076 | 1 |
| 7.80232 | 1 |
| 7.80387 | 1 |
| 7.80543 | 1 |
| 7.80699 | 1 |
| 7.80854 | 1 |
| 7.8101 | 1 |
| 7.81165 | 1 |
| 7.81321 | 1 |
| 7.81477 | 1 |
| 7.81632 | 1 |
| 7.81788 | 1 |
| 7.81943 | 1 |
| 7.82099 | 1 |
| 7.82255 | 1 |
| 7.8241 | 1 |
| 7.82566 | 1 |
| 7.82722 | 1 |
| 7.82877 | 1 |
| 7.83033 | 1 |
| 7.83188 | 1 |
| 7.83344 | 1 |
| 7.835 | 1 |
| 7.83655 | 1 |
| 7.83811 | 1 |
| 7.83966 | 1 |
| 7.84122 | 1 |
| 7.84278 | 1 |
| 7.84433 | 1 |
| 7.84589 | 1 |
| 7.84745 | 1 |
| 7.849 | 1 |
| 7.85056 | 1 |
| 7.85211 | 1 |
| 7.85367 | 1 |
| 7.85523 | 1 |
| 7.85678 | 1 |
| 7.85834 | 1 |
| 7.85989 | 1 |
| 7.86145 | 1 |
| 7.86301 | 1 |
| 7.86456 | 1 |
| 7.866119999999999 | 1 |
| 7.86768 | 1 |
| 7.86923 | 1 |
| 7.87079 | 1 |
| 7.87234 | 1 |
| 7.8739 | 1 |
| 7.87546 | 1 |
| 7.87701 | 1 |
| 7.87857 | 1 |
| 7.88012 | 1 |
| 7.88168 | 1 |
| 7.88324 | 1 |
| 7.88479 | 1 |
| 7.88635 | 1 |
| 7.88791 | 1 |
| 7.88946 | 1 |
| 7.89102 | 1 |
| 7.89257 | 1 |
| 7.89413 | 1 |
| 7.89569 | 1 |
| 7.89724 | 1 |
| 7.8988 | 1 |
| 7.90035 | 1 |
| 7.90191 | 1 |
| 7.90347 | 1 |
| 7.90502 | 1 |
| 7.90658 | 1 |
| 7.90814 | 1 |
| 7.90969 | 1 |
| 7.91125 | 1 |
| 7.9128 | 1 |
| 7.91436 | 1 |
| 7.91592 | 1 |
| 7.91747 | 1 |
| 7.91903 | 1 |
| 7.92058 | 1 |
| 7.92214 | 1 |
| 7.9237 | 1 |
| 7.92525 | 1 |
| 7.92681 | 1 |
| 7.92837 | 1 |
| 7.92992 | 1 |
| 7.93148 | 1 |
| 7.93303 | 1 |
| 7.93459 | 1 |
| 7.93615 | 1 |
| 7.9377 | 1 |
| 7.93926 | 1 |
| 7.94081 | 1 |
| 7.94237 | 1 |
| 7.94393 | 1 |
| 7.94548 | 1 |
| 7.94704 | 1 |
| 7.9486 | 1 |
| 7.95015 | 1 |
| 7.95171 | 1 |
| 7.95326 | 1 |
| 7.95482 | 1 |
| 7.95638 | 1 |
| 7.95793 | 1 |
| 7.95949 | 1 |
| 7.96104 | 1 |
| 7.9626 | 1 |
| 7.96416 | 1 |
| 7.96571 | 1 |
| 7.96727 | 1 |
| 7.96883 | 1 |
| 7.97038 | 1 |
| 7.97194 | 1 |
| 7.97349 | 1 |
| 7.97505 | 1 |
| 7.97661 | 1 |
| 7.97816 | 1 |
| 7.97972 | 1 |
| 7.98127 | 1 |
| 7.98283 | 1 |
| 7.98439 | 1 |
| 7.98594 | 1 |
| 7.9875 | 1 |
| 7.98906 | 1 |
| 7.99061 | 1 |
| 7.99217 | 1 |
| 7.99372 | 1 |
| 7.99528 | 1 |
| 7.99684 | 1 |
| 7.99839 | 1 |
| 7.99995 | 1 |
| 8.0015 | 1 |
| 8.00306 | 1 |
| 8.00462 | 1 |
| 8.00617 | 1 |
| 8.00773 | 1 |
| 8.00929 | 1 |
| 8.01084 | 1 |
| 8.0124 | 1 |
| 8.01395 | 1 |
| 8.01551 | 1 |
| 8.01707 | 1 |
| 8.01862 | 1 |
| 8.02018 | 1 |
| 8.02173 | 1 |
| 8.02329 | 1 |
| 8.02485 | 1 |
| 8.0264 | 1 |
| 8.02796 | 1 |
| 8.02952 | 1 |
| 8.03107 | 1 |
| 8.03263 | 1 |
| 8.03418 | 1 |
| 8.03574 | 1 |
| 8.0373 | 1 |
| 8.03885 | 1 |
| 8.04041 | 1 |
| 8.04196 | 1 |
| 8.04352 | 1 |
| 8.04508 | 1 |
| 8.04663 | 1 |
| 8.04819 | 1 |
| 8.04975 | 1 |
| 8.0513 | 1 |
| 8.05286 | 1 |
| 8.05441 | 1 |
| 8.05597 | 1 |
| 8.05753 | 1 |
| 8.05908 | 1 |
| 8.06064 | 1 |
| 8.0622 | 1 |
| 8.06375 | 1 |
| 8.06531 | 1 |
| 8.06686 | 1 |
| 8.06842 | 1 |
| 8.06998 | 1 |
| 8.07153 | 1 |
| 8.07309 | 1 |
| 8.07464 | 1 |
| 8.0762 | 1 |
| 8.07776 | 1 |
| 8.07931 | 1 |
| 8.08087 | 1 |
| 8.08243 | 1 |
| 8.08398 | 1 |
| 8.08554 | 1 |
| 8.08709 | 1 |
| 8.08865 | 1 |
| 8.09021 | 1 |
| 8.09176 | 1 |
| 8.09332 | 1 |
| 8.09487 | 1 |
| 8.09643 | 1 |
| 8.09799 | 1 |
| 8.09954 | 1 |
| 8.1011 | 1 |
| 8.10266 | 1 |
| 8.10421 | 1 |
| 8.10577 | 1 |
| 8.10732 | 1 |
| 8.10888 | 1 |
| 8.11044 | 1 |
| 8.11199 | 1 |
| 8.11355 | 1 |
| 8.1151 | 1 |
| 8.11666 | 1 |
| 8.11822 | 1 |
| 8.11977 | 1 |
| 8.12133 | 1 |
| 8.12289 | 1 |
| 8.12444 | 1 |
| 8.126 | 1 |
| 8.12755 | 1 |
| 8.12911 | 1 |
| 8.13067 | 1 |
| 8.13222 | 1 |
| 8.13378 | 1 |
| 8.13533 | 1 |
| 8.13689 | 1 |
| 8.13845 | 1 |
| 8.14 | 1 |
| 8.14156 | 1 |
| 8.14312 | 1 |
| 8.14467 | 1 |
| 8.14623 | 1 |
| 8.14778 | 1 |
| 8.14934 | 1 |
| 8.1509 | 1 |
| 8.15245 | 1 |
| 8.15401 | 1 |
| 8.15556 | 1 |
| 8.15712 | 1 |
| 8.15868 | 1 |
| 8.16023 | 1 |
| 8.16179 | 1 |
| 8.16335 | 1 |
| 8.1649 | 1 |
| 8.16646 | 1 |
| 8.16801 | 1 |
| 8.16957 | 1 |
| 8.17113 | 1 |
| 8.17268 | 1 |
| 8.17424 | 1 |
| 8.17579 | 1 |
| 8.17735 | 1 |
| 8.17891 | 1 |
| 8.18046 | 1 |
| 8.18202 | 1 |
| 8.18358 | 1 |
| 8.18513 | 1 |
| 8.18669 | 1 |
| 8.18824 | 1 |
| 8.1898 | 1 |
| 8.19136 | 1 |
| 8.19291 | 1 |
| 8.19447 | 1 |
| 8.19602 | 1 |
| 8.19758 | 1 |
| 8.19914 | 1 |
| 8.20069 | 1 |
| 8.20225 | 1 |
| 8.20381 | 1 |
| 8.20536 | 1 |
| 8.20692 | 1 |
| 8.20847 | 1 |
| 8.21003 | 1 |
| 8.21159 | 1 |
| 8.21314 | 1 |
| 8.2147 | 1 |
| 8.21625 | 1 |
| 8.21781 | 1 |
| 8.21937 | 1 |
| 8.22092 | 1 |
| 8.22248 | 1 |
| 8.22404 | 1 |
| 8.22559 | 1 |
| 8.22715 | 1 |
| 8.2287 | 1 |
| 8.23026 | 1 |
| 8.23182 | 1 |
| 8.23337 | 1 |
| 8.23493 | 1 |
| 8.23648 | 1 |
| 8.23804 | 1 |
| 8.2396 | 1 |
| 8.24115 | 1 |
| 8.24271 | 1 |
| 8.24427 | 1 |
| 8.24582 | 1 |
| 8.24738 | 1 |
| 8.24893 | 1 |
| 8.25049 | 1 |
| 8.25205 | 1 |
| 8.2536 | 1 |
| 8.25516 | 1 |
| 8.25671 | 1 |
| 8.25827 | 1 |
| 8.25983 | 1 |
| 8.26138 | 1 |
| 8.26294 | 1 |
| 8.2645 | 1 |
| 8.26605 | 1 |
| 8.26761 | 1 |
| 8.26916 | 1 |
| 8.27072 | 1 |
| 8.27228 | 1 |
| 8.27383 | 1 |
| 8.27539 | 1 |
| 8.27694 | 1 |
| 8.2785 | 1 |
| 8.28006 | 1 |
| 8.28161 | 1 |
| 8.28317 | 1 |
| 8.28473 | 1 |
| 8.28628 | 1 |
| 8.28784 | 1 |
| 8.28939 | 1 |
| 8.29095 | 1 |
| 8.29251 | 1 |
| 8.29406 | 1 |
| 8.29562 | 1 |
| 8.29717 | 1 |
| 8.29873 | 1 |
| 8.30029 | 1 |
| 8.30184 | 1 |
| 8.3034 | 1 |
| 8.30496 | 1 |
| 8.30651 | 1 |
| 8.30807 | 1 |
| 8.30962 | 1 |
| 8.31118 | 1 |
| 8.31274 | 1 |
| 8.31429 | 1 |
| 8.31585 | 1 |
| 8.3174 | 1 |
| 8.31896 | 1 |
| 8.32052 | 1 |
| 8.32207 | 1 |
| 8.32363 | 1 |
| 8.32519 | 1 |
| 8.32674 | 1 |
| 8.3283 | 1 |
| 8.32985 | 1 |
| 8.33141 | 1 |
| 8.33297 | 1 |
| 8.33452 | 1 |
| 8.33608 | 1 |
| 8.33763 | 1 |
| 8.33919 | 1 |
| 8.34075 | 1 |
| 8.3423 | 1 |
| 8.34386 | 1 |
| 8.34542 | 1 |
| 8.34697 | 1 |
| 8.34853 | 1 |
| 8.35008 | 1 |
| 8.35164 | 1 |
| 8.3532 | 1 |
| 8.35475 | 1 |
| 8.35631 | 1 |
| 8.35786 | 1 |
| 8.35942 | 1 |
| 8.36098 | 1 |
| 8.36253 | 1 |
| 8.36409 | 1 |
| 8.36565 | 1 |
| 8.3672 | 1 |
| 8.36876 | 1 |
| 8.37031 | 1 |
| 8.37187 | 1 |
| 8.37343 | 1 |
| 8.37498 | 1 |
| 8.37654 | 1 |
| 8.37809 | 1 |
| 8.37965 | 1 |
| 8.38121 | 1 |
| 8.38276 | 1 |
| 8.38432 | 1 |
| 8.38588 | 1 |
| 8.38743 | 1 |
| 8.38899 | 1 |
| 8.39054 | 1 |
| 8.3921 | 1 |
| 8.39366 | 1 |
| 8.39521 | 1 |
| 8.39677 | 1 |
| 8.39832 | 1 |
| 8.39988 | 1 |
| 8.40144 | 1 |
| 8.40299 | 1 |
| 8.40455 | 1 |
| 8.40611 | 1 |
| 8.40766 | 1 |
| 8.40922 | 1 |
| 8.41077 | 1 |
| 8.41233 | 1 |
| 8.41389 | 1 |
| 8.41544 | 1 |
| 8.417 | 1 |
| 8.41855 | 1 |
| 8.42011 | 1 |
| 8.42167 | 1 |
| 8.42322 | 1 |
| 8.42478 | 1 |
| 8.42634 | 1 |
| 8.42789 | 1 |
| 8.42945 | 1 |
| 8.431 | 1 |
| 8.43256 | 1 |
| 8.43412 | 1 |
| 8.43567 | 1 |
| 8.43723 | 1 |
| 8.43878 | 1 |
| 8.44034 | 1 |
| 8.4419 | 1 |
| 8.44345 | 1 |
| 8.44501 | 1 |
| 8.44657 | 1 |
| 8.44812 | 1 |
| 8.44968 | 1 |
| 8.45123 | 1 |
| 8.45279 | 1 |
| 8.45435 | 1 |
| 8.4559 | 1 |
| 8.45746 | 1 |
| 8.45901 | 1 |
| 8.46057 | 1 |
| 8.46213 | 1 |
| 8.46368 | 1 |
| 8.46524 | 1 |
| 8.4668 | 1 |
| 8.46835 | 1 |
| 8.46991 | 1 |
| 8.47146 | 1 |
| 8.47302 | 1 |
| 8.47458 | 1 |
| 8.47613 | 1 |
| 8.47769 | 1 |
| 8.47924 | 1 |
| 8.4808 | 1 |
| 8.48236 | 1 |
| 8.48391 | 1 |
| 8.48547 | 1 |
| 8.48703 | 1 |
| 8.48858 | 1 |
| 8.49014 | 1 |
| 8.49169 | 1 |
| 8.49325 | 1 |
| 8.49481 | 1 |
| 8.49636 | 1 |
| 8.49792 | 1 |
| 8.49948 | 1 |
| 8.50103 | 1 |
| 8.50259 | 1 |
| 8.50414 | 1 |
| 8.5057 | 1 |
| 8.50726 | 1 |
| 8.50881 | 1 |
| 8.51037 | 1 |
| 8.51192 | 1 |
| 8.51348 | 1 |
| 8.51504 | 1 |
| 8.51659 | 1 |
| 8.51815 | 1 |
| 8.51971 | 1 |
| 8.52126 | 1 |
| 8.52282 | 1 |
| 8.52437 | 1 |
| 8.52593 | 1 |
| 8.52749 | 1 |
| 8.52904 | 1 |
| 8.5306 | 1 |
| 8.53215 | 1 |
| 8.53371 | 1 |
| 8.53527 | 1 |
| 8.53682 | 1 |
| 8.53838 | 1 |
| 8.53994 | 1 |
| 8.54149 | 1 |
| 8.54305 | 1 |
| 8.5446 | 1 |
| 8.54616 | 1 |
| 8.54772 | 1 |
| 8.54927 | 1 |
| 8.55083 | 1 |
| 8.55238 | 1 |
| 8.55394 | 1 |
| 8.5555 | 1 |
| 8.55705 | 1 |
| 8.55861 | 1 |
| 8.56017 | 1 |
| 8.56172 | 1 |
| 8.56328 | 1 |
| 8.56483 | 1 |
| 8.56639 | 1 |
| 8.56795 | 1 |
| 8.5695 | 1 |
| 8.57106 | 1 |
| 8.57261 | 1 |
| 8.57417 | 1 |
| 8.57573 | 1 |
| 8.57728 | 1 |
| 8.57884 | 1 |
| 8.5804 | 1 |
| 8.58195 | 1 |
| 8.58351 | 1 |
| 8.58506 | 1 |
| 8.58662 | 1 |
| 8.58818 | 1 |
| 8.58973 | 1 |
| 8.59129 | 1 |
| 8.59284 | 1 |
| 8.5944 | 1 |
| 8.59596 | 1 |
| 8.59751 | 1 |
| 8.59907 | 1 |
| 8.60063 | 1 |
| 8.60218 | 1 |
| 8.60374 | 1 |
| 8.60529 | 1 |
| 8.60685 | 1 |
| 8.60841 | 1 |
| 8.60996 | 1 |
| 8.61152 | 1 |
| 8.61307 | 1 |
| 8.61463 | 1 |
| 8.61619 | 1 |
| 8.61774 | 1 |
| 8.6193 | 1 |
| 8.62086 | 1 |
| 8.62241 | 1 |
| 8.62397 | 1 |
| 8.62552 | 1 |
| 8.62708 | 1 |
| 8.62864 | 1 |
| 8.63019 | 1 |
| 8.63175 | 1 |
| 8.6333 | 1 |
| 8.63486 | 1 |
| 8.63642 | 1 |
| 8.63797 | 1 |
| 8.63953 | 1 |
| 8.64109 | 1 |
| 8.64264 | 1 |
| 8.6442 | 1 |
| 8.64575 | 1 |
| 8.64731 | 1 |
| 8.64887 | 1 |
| 8.65042 | 1 |
| 8.65198 | 1 |
| 8.65353 | 1 |
| 8.65509 | 1 |
| 8.65665 | 1 |
| 8.6582 | 1 |
| 8.65976 | 1 |
| 8.66132 | 1 |
| 8.66287 | 1 |
| 8.66443 | 1 |
| 8.66598 | 1 |
| 8.66754 | 1 |
| 8.6691 | 1 |
| 8.67065 | 1 |
| 8.67221 | 1 |
| 8.67376 | 1 |
| 8.67532 | 1 |
| 8.67688 | 1 |
| 8.67843 | 1 |
| 8.67999 | 1 |
| 8.68155 | 1 |
| 8.6831 | 1 |
| 8.68466 | 1 |
| 8.68621 | 1 |
| 8.68777 | 1 |
| 8.68933 | 1 |
| 8.69088 | 1 |
| 8.69244 | 1 |
| 8.69399 | 1 |
| 8.69555 | 1 |
| 8.69711 | 1 |
| 8.69866 | 1 |
| 8.70022 | 1 |
| 8.70178 | 1 |
| 8.70333 | 1 |
| 8.70489 | 1 |
| 8.70644 | 1 |
| 8.708 | 1 |
| 8.70956 | 1 |
| 8.71111 | 1 |
| 8.71267 | 1 |
| 8.71422 | 1 |
| 8.71578 | 1 |
| 8.71734 | 1 |
| 8.71889 | 1 |
| 8.72045 | 1 |
| 8.72201 | 1 |
| 8.72356 | 1 |
| 8.72512 | 1 |
| 8.72667 | 1 |
| 8.72823 | 1 |
| 8.72979 | 1 |
| 8.73134 | 1 |
| 8.7329 | 1 |
| 8.73445 | 1 |
| 8.73601 | 1 |
| 8.73757 | 1 |
| 8.73912 | 1 |
| 8.74068 | 1 |
| 8.74224 | 1 |
| 8.74379 | 1 |
| 8.74535 | 1 |
| 8.7469 | 1 |
| 8.74846 | 1 |
| 8.75002 | 1 |
| 8.75157 | 1 |
| 8.75313 | 1 |
| 8.75468 | 1 |
| 8.75624 | 1 |
| 8.7578 | 1 |
| 8.75935 | 1 |
| 8.76091 | 1 |
| 8.76247 | 1 |
| 8.76402 | 1 |
| 8.76558 | 1 |
| 8.76713 | 1 |
| 8.76869 | 1 |
| 8.77025 | 1 |
| 8.7718 | 1 |
| 8.77336 | 1 |
| 8.77491 | 1 |
| 8.77647 | 1 |
| 8.77803 | 1 |
| 8.77958 | 1 |
| 8.78114 | 1 |
| 8.7827 | 1 |
| 8.78425 | 1 |
| 8.78581 | 1 |
| 8.78736 | 1 |
| 8.78892 | 1 |
| 8.79048 | 1 |
| 8.79203 | 1 |
| 8.79359 | 1 |
| 8.79514 | 1 |
| 8.7967 | 1 |
| 8.79826 | 1 |
| 8.79981 | 1 |
| 8.80137 | 1 |
| 8.80293 | 1 |
| 8.80448 | 1 |
| 8.80604 | 1 |
| 8.80759 | 1 |
| 8.80915 | 1 |
| 8.81071 | 1 |
| 8.81226 | 1 |
| 8.81382 | 1 |
| 8.81537 | 1 |
| 8.81693 | 1 |
| 8.81849 | 1 |
| 8.82004 | 1 |
| 8.8216 | 1 |
| 8.82316 | 1 |
| 8.82471 | 1 |
| 8.82627 | 1 |
| 8.82782 | 1 |
| 8.82938 | 1 |
| 8.83094 | 1 |
| 8.83249 | 1 |
| 8.83405 | 1 |
| 8.8356 | 1 |
| 8.83716 | 1 |
| 8.83872 | 1 |
| 8.84027 | 1 |
| 8.84183 | 1 |
| 8.84339 | 1 |
| 8.84494 | 1 |
| 8.8465 | 1 |
| 8.84805 | 1 |
| 8.84961 | 1 |
| 8.85117 | 1 |
| 8.85272 | 1 |
| 8.85428 | 1 |
| 8.85583 | 1 |
| 8.85739 | 1 |
| 8.85895 | 1 |
| 8.8605 | 1 |
| 8.86206 | 1 |
| 8.86362 | 1 |
| 8.86517 | 1 |
| 8.86673 | 1 |
| 8.86828 | 1 |
| 8.86984 | 1 |
| 8.8714 | 1 |
| 8.87295 | 1 |
| 8.87451 | 1 |
| 8.87606 | 1 |
| 8.87762 | 1 |
| 8.87918 | 1 |
| 8.88073 | 1 |
| 8.88229 | 1 |
| 8.88385 | 1 |
| 8.8854 | 1 |
| 8.88696 | 1 |
| 8.88851 | 1 |
| 8.89007 | 1 |
| 8.89163 | 1 |
| 8.89318 | 1 |
| 8.89474 | 1 |
| 8.89629 | 1 |
| 8.89785 | 1 |
| 8.89941 | 1 |
| 8.90096 | 1 |
| 8.90252 | 1 |
| 8.90408 | 1 |
| 8.90563 | 1 |
| 8.90719 | 1 |
| 8.90874 | 1 |
| 8.9103 | 1 |
| 8.91186 | 1 |
| 8.91341 | 1 |
| 8.91497 | 1 |
| 8.91653 | 1 |
| 8.91808 | 1 |
| 8.91964 | 1 |
| 8.92119 | 1 |
| 8.92275 | 1 |
| 8.92431 | 1 |
| 8.92586 | 1 |
| 8.92742 | 1 |
| 8.92897 | 1 |
| 8.93053 | 1 |
| 8.93209 | 1 |
| 8.93364 | 1 |
| 8.9352 | 1 |
| 8.93676 | 1 |
| 8.93831 | 1 |
| 8.93987 | 1 |
| 8.94142 | 1 |
| 8.94298 | 1 |
| 8.94454 | 1 |
| 8.94609 | 1 |
| 8.94765 | 1 |
| 8.9492 | 1 |
| 8.95076 | 1 |
| 8.95232 | 1 |
| 8.95387 | 1 |
| 8.95543 | 1 |
| 8.95699 | 1 |
| 8.95854 | 1 |
| 8.9601 | 1 |
| 8.96165 | 1 |
| 8.96321 | 1 |
| 8.96477 | 1 |
| 8.96632 | 1 |
| 8.96788 | 1 |
| 8.96943 | 1 |
| 8.97099 | 1 |
| 8.97255 | 1 |
| 8.9741 | 1 |
| 8.97566 | 1 |
| 8.97722 | 1 |
| 8.97877 | 1 |
| 8.98033 | 1 |
| 8.98188 | 1 |
| 8.98344 | 1 |
| 8.985 | 1 |
| 8.98655 | 1 |
| 8.98811 | 1 |
| 8.98966 | 1 |
| 8.99122 | 1 |
| 8.99278 | 1 |
| 8.99433 | 1 |
| 8.99589 | 1 |
| 8.99745 | 1 |
| 8.999 | 1 |
| 9.00056 | 1 |
| 9.00211 | 1 |
| 9.00367 | 1 |
| 9.00523 | 1 |
| 9.00678 | 1 |
| 9.00834 | 1 |
| 9.00989 | 1 |
| 9.01145 | 1 |
| 9.01301 | 1 |
| 9.01456 | 1 |
| 9.01612 | 1 |
| 9.01768 | 1 |
| 9.01923 | 1 |
| 9.02079 | 1 |
| 9.02234 | 1 |
| 9.0239 | 1 |
| 9.02546 | 1 |
| 9.02701 | 1 |
| 9.02857 | 1 |
| 9.03012 | 1 |
| 9.03168 | 1 |
| 9.03324 | 1 |
| 9.03479 | 1 |
| 9.03635 | 1 |
| 9.03791 | 1 |
| 9.03946 | 1 |
| 9.04102 | 1 |
| 9.04257 | 1 |
| 9.04413 | 1 |
| 9.04569 | 1 |
| 9.04724 | 1 |
| 9.0488 | 1 |
| 9.05035 | 1 |
| 9.05191 | 1 |
| 9.05347 | 1 |
| 9.05502 | 1 |
| 9.05658 | 1 |
| 9.05814 | 1 |
| 9.05969 | 1 |
| 9.06125 | 1 |
| 9.0628 | 1 |
| 9.06436 | 1 |
| 9.06592 | 1 |
| 9.06747 | 1 |
| 9.06903 | 1 |
| 9.07058 | 1 |
| 9.07214 | 1 |
| 9.0737 | 1 |
| 9.07525 | 1 |
| 9.07681 | 1 |
| 9.07837 | 1 |
| 9.07992 | 1 |
| 9.08148 | 1 |
| 9.08303 | 1 |
| 9.08459 | 1 |
| 9.08615 | 1 |
| 9.0877 | 1 |
| 9.08926 | 1 |
| 9.09081 | 1 |
| 9.09237 | 1 |
| 9.09393 | 1 |
| 9.09548 | 1 |
| 9.09704 | 1 |
| 9.0986 | 1 |
| 9.10015 | 1 |
| 9.10171 | 1 |
| 9.10326 | 1 |
| 9.10482 | 1 |
| 9.10638 | 1 |
| 9.10793 | 1 |
| 9.10949 | 1 |
| 9.11104 | 1 |
| 9.1126 | 1 |
| 9.11416 | 1 |
| 9.11571 | 1 |
| 9.11727 | 1 |
| 9.11883 | 1 |
| 9.12038 | 1 |
| 9.12194 | 1 |
| 9.12349 | 1 |
| 9.12505 | 1 |
| 9.12661 | 1 |
| 9.12816 | 1 |
| 9.12972 | 1 |
| 9.13127 | 1 |
| 9.13283 | 1 |
| 9.13439 | 1 |
| 9.13594 | 1 |
| 9.1375 | 1 |
| 9.13906 | 1 |
| 9.14061 | 1 |
| 9.14217 | 1 |
| 9.14372 | 1 |
| 9.14528 | 1 |
| 9.14684 | 1 |
| 9.14839 | 1 |
| 9.14995 | 1 |
| 9.1515 | 1 |
| 9.15306 | 1 |
| 9.15462 | 1 |
| 9.15617 | 1 |
| 9.15773 | 1 |
| 9.15929 | 1 |
| 9.16084 | 1 |
| 9.1624 | 1 |
| 9.16395 | 1 |
| 9.16551 | 1 |
| 9.16707 | 1 |
| 9.16862 | 1 |
| 9.17018 | 1 |
| 9.17173 | 1 |
| 9.17329 | 1 |
| 9.17485 | 1 |
| 9.1764 | 1 |
| 9.17796 | 1 |
| 9.17952 | 1 |
| 9.18107 | 1 |
| 9.18263 | 1 |
| 9.18418 | 1 |
| 9.18574 | 1 |
| 9.1873 | 1 |
| 9.18885 | 1 |
| 9.19041 | 1 |
| 9.19196 | 1 |
| 9.19352 | 1 |
| 9.19508 | 1 |
| 9.19663 | 1 |
| 9.19819 | 1 |
| 9.19975 | 1 |
| 9.2013 | 1 |
| 9.20286 | 1 |
| 9.20441 | 1 |
| 9.20597 | 1 |
| 9.20753 | 1 |
| 9.20908 | 1 |
| 9.21064 | 1 |
| 9.21219 | 1 |
| 9.21375 | 1 |
| 9.21531 | 1 |
| 9.21686 | 1 |
| 9.21842 | 1 |
| 9.21998 | 1 |
| 9.22153 | 1 |
| 9.22309 | 1 |
| 9.22464 | 1 |
| 9.2262 | 1 |
| 9.22776 | 1 |
| 9.22931 | 1 |
| 9.23087 | 1 |
| 9.23242 | 1 |
| 9.23398 | 1 |
| 9.23554 | 1 |
| 9.23709 | 1 |
| 9.23865 | 1 |
| 9.24021 | 1 |
| 9.24176 | 1 |
| 9.24332 | 1 |
| 9.24487 | 1 |
| 9.24643 | 1 |
| 9.24799 | 1 |
| 9.24954 | 1 |
| 9.2511 | 1 |
| 9.25265 | 1 |
| 9.25421 | 1 |
| 9.25577 | 1 |
| 9.25732 | 1 |
| 9.25888 | 1 |
| 9.26044 | 1 |
| 9.26199 | 1 |
| 9.26355 | 1 |
| 9.2651 | 1 |
| 9.26666 | 1 |
| 9.26822 | 1 |
| 9.26977 | 1 |
| 9.27133 | 1 |
| 9.27288 | 1 |
| 9.27444 | 1 |
| 9.276 | 1 |
| 9.27755 | 1 |
| 9.27911 | 1 |
| 9.28067 | 1 |
| 9.28222 | 1 |
| 9.28378 | 1 |
| 9.28533 | 1 |
| 9.28689 | 1 |
| 9.28845 | 1 |
| 9.29 | 1 |
| 9.29156 | 1 |
| 9.29311 | 1 |
| 9.29467 | 1 |
| 9.29623 | 1 |
| 9.29778 | 1 |
| 9.29934 | 1 |
| 9.3009 | 1 |
| 9.30245 | 1 |
| 9.30401 | 1 |
| 9.30556 | 1 |
| 9.30712 | 1 |
| 9.30868 | 1 |
| 9.31023 | 1 |
| 9.31179 | 1 |
| 9.31334 | 1 |
| 9.3149 | 1 |
| 9.31646 | 1 |
| 9.31801 | 1 |
| 9.31957 | 1 |
| 9.32113 | 1 |
| 9.32268 | 1 |
| 9.32424 | 1 |
| 9.32579 | 1 |
| 9.32735 | 1 |
| 9.32891 | 1 |
| 9.33046 | 1 |
| 9.33202 | 1 |
| 9.33357 | 1 |
| 9.33513 | 1 |
| 9.33669 | 1 |
| 9.33824 | 1 |
| 9.3398 | 1 |
| 9.34136 | 1 |
| 9.34291 | 1 |
| 9.34447 | 1 |
| 9.34602 | 1 |
| 9.34758 | 1 |
| 9.34914 | 1 |
| 9.35069 | 1 |
| 9.35225 | 1 |
| 9.35381 | 1 |
| 9.35536 | 1 |
| 9.35692 | 1 |
| 9.35847 | 1 |
| 9.36003 | 1 |
| 9.36159 | 1 |
| 9.36314 | 1 |
| 9.3647 | 1 |
| 9.36625 | 1 |
| 9.36781 | 1 |
| 9.36937 | 1 |
| 9.37092 | 1 |
| 9.37248 | 1 |
| 9.37404 | 1 |
| 9.37559 | 1 |
| 9.37715 | 1 |
| 9.3787 | 1 |
| 9.38026 | 1 |
| 9.38182 | 1 |
| 9.38337 | 1 |
| 9.38493 | 1 |
| 9.38648 | 1 |
| 9.38804 | 1 |
| 9.3896 | 1 |
| 9.39115 | 1 |
| 9.39271 | 1 |
| 9.39427 | 1 |
| 9.39582 | 1 |
| 9.39738 | 1 |
| 9.39893 | 1 |
| 9.40049 | 1 |
| 9.40205 | 1 |
| 9.4036 | 1 |
| 9.40516 | 1 |
| 9.40671 | 1 |
| 9.40827 | 1 |
| 9.40983 | 1 |
| 9.41138 | 1 |
| 9.41294 | 1 |
| 9.4145 | 1 |
| 9.41605 | 1 |
| 9.41761 | 1 |
| 9.41916 | 1 |
| 9.42072 | 1 |
| 9.42228 | 1 |
| 9.42383 | 1 |
| 9.42539 | 1 |
| 9.42694 | 1 |
| 9.4285 | 1 |
| 9.43006 | 1 |
| 9.43161 | 1 |
| 9.43317 | 1 |
| 9.43473 | 1 |
| 9.43628 | 1 |
| 9.43784 | 1 |
| 9.43939 | 1 |
| 9.44095 | 1 |
| 9.44251 | 1 |
| 9.44406 | 1 |
| 9.44562 | 1 |
| 9.44717 | 1 |
| 9.44873 | 1 |
| 9.45029 | 1 |
| 9.45184 | 1 |
| 9.4534 | 1 |
| 9.45496 | 1 |
| 9.45651 | 1 |
| 9.45807 | 1 |
| 9.45962 | 1 |
| 9.46118 | 1 |
| 9.46274 | 1 |
| 9.46429 | 1 |
| 9.46585 | 1 |
| 9.4674 | 1 |
| 9.46896 | 1 |
| 9.47052 | 1 |
| 9.47207 | 1 |
| 9.47363 | 1 |
| 9.47519 | 1 |
| 9.47674 | 1 |
| 9.4783 | 1 |
| 9.47985 | 1 |
| 9.48141 | 1 |
| 9.48297 | 1 |
| 9.48452 | 1 |
| 9.48608 | 1 |
| 9.48763 | 1 |
| 9.48919 | 1 |
| 9.49075 | 1 |
| 9.4923 | 1 |
| 9.49386 | 1 |
| 9.49542 | 1 |
| 9.49697 | 1 |
| 9.49853 | 1 |
| 9.50008 | 1 |
| 9.50164 | 1 |
| 9.5032 | 1 |
| 9.50475 | 1 |
| 9.50631 | 1 |
| 9.50786 | 1 |
| 9.50942 | 1 |
| 9.51098 | 1 |
| 9.51253 | 1 |
| 9.51409 | 1 |
| 9.51565 | 1 |
| 9.5172 | 1 |
| 9.51876 | 1 |
| 9.52031 | 1 |
| 9.52187 | 1 |
| 9.52343 | 1 |
| 9.52498 | 1 |
| 9.52654 | 1 |
| 9.52809 | 1 |
| 9.52965 | 1 |
| 9.53121 | 1 |
| 9.53276 | 1 |
| 9.53432 | 1 |
| 9.53588 | 1 |
| 9.53743 | 1 |
| 9.53899 | 1 |
| 9.54054 | 1 |
| 9.5421 | 1 |
| 9.54366 | 1 |
| 9.54521 | 1 |
| 9.54677 | 1 |
| 9.54832 | 1 |
| 9.54988 | 1 |
| 9.55144 | 1 |
| 9.55299 | 1 |
| 9.55455 | 1 |
| 9.55611 | 1 |
| 9.55766 | 1 |
| 9.55922 | 1 |
| 9.56077 | 1 |
| 9.56233 | 1 |
| 9.56389 | 1 |
| 9.56544 | 1 |
| 9.567 | 1 |
| 9.56855 | 1 |
| 9.57011 | 1 |
| 9.57167 | 1 |
| 9.57322 | 1 |
| 9.57478 | 1 |
| 9.57634 | 1 |
| 9.57789 | 1 |
| 9.57945 | 1 |
| 9.581 | 1 |
| 9.58256 | 1 |
| 9.58412 | 1 |
| 9.58567 | 1 |
| 9.58723 | 1 |
| 9.58878 | 1 |
| 9.59034 | 1 |
| 9.5919 | 1 |
| 9.59345 | 1 |
| 9.59501 | 1 |
| 9.59657 | 1 |
| 9.59812 | 1 |
| 9.59968 | 1 |
| 9.60123 | 1 |
| 9.60279 | 1 |
| 9.60435 | 1 |
| 9.6059 | 1 |
| 9.60746 | 1 |
| 9.60901 | 1 |
| 9.61057 | 1 |
| 9.61213 | 1 |
| 9.61368 | 1 |
| 9.61524 | 1 |
| 9.6168 | 1 |
| 9.61835 | 1 |
| 9.61991 | 1 |
| 9.62146 | 1 |
| 9.62302 | 1 |
| 9.62458 | 1 |
| 9.62613 | 1 |
| 9.62769 | 1 |
| 9.62924 | 1 |
| 9.6308 | 1 |
| 9.63236 | 1 |
| 9.63391 | 1 |
| 9.63547 | 1 |
| 9.63703 | 1 |
| 9.63858 | 1 |
| 9.64014 | 1 |
| 9.64169 | 1 |
| 9.64325 | 1 |
| 9.64481 | 1 |
| 9.64636 | 1 |
| 9.64792 | 1 |
| 9.64947 | 1 |
| 9.65103 | 1 |
| 9.65259 | 1 |
| 9.65414 | 1 |
| 9.6557 | 1 |
| 9.65726 | 1 |
| 9.65881 | 1 |
| 9.66037 | 1 |
| 9.66192 | 1 |
| 9.66348 | 1 |
| 9.66504 | 1 |
| 9.66659 | 1 |
| 9.66815 | 1 |
| 9.6697 | 1 |
| 9.67126 | 1 |
| 9.67282 | 1 |
| 9.67437 | 1 |
| 9.67593 | 1 |
| 9.67749 | 1 |
| 9.67904 | 1 |
| 9.6806 | 1 |
| 9.68215 | 1 |
| 9.68371 | 1 |
| 9.68527 | 1 |
| 9.68682 | 1 |
| 9.68838 | 1 |
| 9.68993 | 1 |
| 9.69149 | 1 |
| 9.69305 | 1 |
| 9.6946 | 1 |
| 9.69616 | 1 |
| 9.69772 | 1 |
| 9.69927 | 1 |
| 9.70083 | 1 |
| 9.70238 | 1 |
| 9.70394 | 1 |
| 9.7055 | 1 |
| 9.70705 | 1 |
| 9.70861 | 1 |
| 9.71016 | 1 |
| 9.71172 | 1 |
| 9.71328 | 1 |
| 9.71483 | 1 |
| 9.71639 | 1 |
| 9.71795 | 1 |
| 9.7195 | 1 |
| 9.72106 | 1 |
| 9.72261 | 1 |
| 9.72417 | 1 |
| 9.72573 | 1 |
| 9.72728 | 1 |
| 9.72884 | 1 |
| 9.73039 | 1 |
| 9.73195 | 1 |
| 9.73351 | 1 |
| 9.73506 | 1 |
| 9.73662 | 1 |
| 9.73818 | 1 |
| 9.73973 | 1 |
| 9.74129 | 1 |
| 9.74284 | 1 |
| 9.7444 | 1 |
| 9.74596 | 1 |
| 9.74751 | 1 |
| 9.74907 | 1 |
| 9.75062 | 1 |
| 9.75218 | 1 |
| 9.75374 | 1 |
| 9.75529 | 1 |
| 9.75685 | 1 |
| 9.75841 | 1 |
| 9.75996 | 1 |
| 9.76152 | 1 |
| 9.76307 | 1 |
| 9.76463 | 1 |
| 9.76619 | 1 |
| 9.76774 | 1 |
| 9.7693 | 1 |
| 9.77085 | 1 |
| 9.77241 | 1 |
| 9.77397 | 1 |
| 9.77552 | 1 |
| 9.77708 | 1 |
| 9.77864 | 1 |
| 9.78019 | 1 |
| 9.78175 | 1 |
| 9.7833 | 1 |
| 9.78486 | 1 |
| 9.78642 | 1 |
| 9.78797 | 1 |
| 9.78953 | 1 |
| 9.79109 | 1 |
| 9.79264 | 1 |
| 9.7942 | 1 |
| 9.79575 | 1 |
| 9.79731 | 1 |
| 9.79887 | 1 |
| 9.80042 | 1 |
| 9.80198 | 1 |
| 9.80353 | 1 |
| 9.80509 | 1 |
| 9.80665 | 1 |
| 9.8082 | 1 |
| 9.80976 | 1 |
| 9.81132 | 1 |
| 9.81287 | 1 |
| 9.81443 | 1 |
| 9.81598 | 1 |
| 9.81754 | 1 |
| 9.8191 | 1 |
| 9.82065 | 1 |
| 9.82221 | 1 |
| 9.82376 | 1 |
| 9.82532 | 1 |
| 9.82688 | 1 |
| 9.82843 | 1 |
| 9.82999 | 1 |
| 9.83155 | 1 |
| 9.8331 | 1 |
| 9.83466 | 1 |
| 9.83621 | 1 |
| 9.83777 | 1 |
| 9.83933 | 1 |
| 9.84088 | 1 |
| 9.84244 | 1 |
| 9.84399 | 1 |
| 9.84555 | 1 |
| 9.84711 | 1 |
| 9.84866 | 1 |
| 9.85022 | 1 |
| 9.85178 | 1 |
| 9.85333 | 1 |
| 9.85489 | 1 |
| 9.85644 | 1 |
| 9.858 | 1 |
| 9.85956 | 1 |
| 9.86111 | 1 |
| 9.86267 | 1 |
| 9.86422 | 1 |
| 9.86578 | 1 |
| 9.86734 | 1 |
| 9.86889 | 1 |
| 9.87045 | 1 |
| 9.87201 | 1 |
| 9.87356 | 1 |
| 9.87512 | 1 |
| 9.87667 | 1 |
| 9.87823 | 1 |
| 9.87979 | 1 |
| 9.88134 | 1 |
| 9.8829 | 1 |
| 9.88445 | 1 |
| 9.88601 | 1 |
| 9.88757 | 1 |
| 9.88912 | 1 |
| 9.89068 | 1 |
| 9.89224 | 1 |
| 9.89379 | 1 |
| 9.89535 | 1 |
| 9.8969 | 1 |
| 9.89846 | 1 |
| 9.90002 | 1 |
| 9.90157 | 1 |
| 9.90313 | 1 |
| 9.90468 | 1 |
| 9.90624 | 1 |
| 9.9078 | 1 |
| 9.90935 | 1 |
| 9.91091 | 1 |
| 9.91247 | 1 |
| 9.91402 | 1 |
| 9.91558 | 1 |
| 9.91713 | 1 |
| 9.91869 | 1 |
| 9.92025 | 1 |
| 9.9218 | 1 |
| 9.92336 | 1 |
| 9.92491 | 1 |
| 9.92647 | 1 |
| 9.92803 | 1 |
| 9.92958 | 1 |
| 9.93114 | 1 |
| 9.9327 | 1 |
| 9.93425 | 1 |
| 9.93581 | 1 |
| 9.93736 | 1 |
| 9.93892 | 1 |
| 9.94048 | 1 |
| 9.94203 | 1 |
| 9.94359 | 1 |
| 9.94514 | 1 |
| 9.9467 | 1 |
| 9.94826 | 1 |
| 9.94981 | 1 |
| 9.95137 | 1 |
| 9.95293 | 1 |
| 9.95448 | 1 |
| 9.95604 | 1 |
| 9.95759 | 1 |
| 9.95915 | 1 |
| 9.96071 | 1 |
| 9.96226 | 1 |
| 9.96382 | 1 |
| 9.96537 | 1 |
| 9.96693 | 1 |
| 9.96849 | 1 |
| 9.97004 | 1 |
| 9.9716 | 1 |
| 9.97316 | 1 |
| 9.97471 | 1 |
| 9.97627 | 1 |
| 9.97782 | 1 |
| 9.97938 | 1 |
| 9.98094 | 1 |
| 9.98249 | 1 |
| 9.98405 | 1 |
| 9.9856 | 1 |
| 9.98716 | 1 |
| 9.98872 | 1 |
| 9.99027 | 1 |
| 9.99183 | 1 |
| 9.99339 | 1 |
| 9.99494 | 1 |
| 9.9965 | 1 |
| 9.99805 | 1 |
| 9.99961 | 1 |
| 10.00117 | 1 |
| 10.00272 | 1 |
| 10.00428 | 1 |
| 10.00583 | 1 |
| 10.00739 | 1 |
| 10.00895 | 1 |
| 10.0105 | 1 |
| 10.01206 | 1 |
| 10.01362 | 1 |
| 10.01517 | 1 |
| 10.01673 | 1 |
| 10.01828 | 1 |
| 10.01984 | 1 |
| 10.0214 | 1 |
| 10.02295 | 1 |
| 10.02451 | 1 |
| 10.02606 | 1 |
| 10.02762 | 1 |
| 10.02918 | 1 |
| 10.03073 | 1 |
| 10.03229 | 1 |
| 10.03385 | 1 |
| 10.0354 | 1 |
| 10.03696 | 1 |
| 10.03851 | 1 |
| 10.04007 | 1 |
| 10.04163 | 1 |
| 10.04318 | 1 |
| 10.04474 | 1 |
| 10.04629 | 1 |
| 10.04785 | 1 |
| 10.04941 | 1 |
| 10.05096 | 1 |
| 10.05252 | 1 |
| 10.05408 | 1 |
| 10.05563 | 1 |
| 10.05719 | 1 |
| 10.05874 | 1 |
| 10.0603 | 1 |
| 10.06186 | 1 |
| 10.06341 | 1 |
| 10.06497 | 1 |
| 10.06652 | 1 |
| 10.06808 | 1 |
| 10.06964 | 1 |
| 10.07119 | 1 |
| 10.07275 | 1 |
| 10.07431 | 1 |
| 10.07586 | 1 |
| 10.07742 | 1 |
| 10.07897 | 1 |
| 10.08053 | 1 |
| 10.08209 | 1 |
| 10.08364 | 1 |
| 10.0852 | 1 |
| 10.08675 | 1 |
| 10.08831 | 1 |
| 10.08987 | 1 |
| 10.09142 | 1 |
| 10.09298 | 1 |
| 10.09454 | 1 |
| 10.09609 | 1 |
| 10.09765 | 1 |
| 10.0992 | 1 |
| 10.10076 | 1 |
| 10.10232 | 1 |
| 10.10387 | 1 |
| 10.10543 | 1 |
| 10.10698 | 1 |
| 10.10854 | 1 |
| 10.1101 | 1 |
| 10.11165 | 1 |
| 10.11321 | 1 |
| 10.11477 | 1 |
| 10.11632 | 1 |
| 10.11788 | 1 |
| 10.11943 | 1 |
| 10.12099 | 1 |
| 10.12255 | 1 |
| 10.1241 | 1 |
| 10.12566 | 1 |
| 10.12721 | 1 |
| 10.12877 | 1 |
| 10.13033 | 1 |
| 10.13188 | 1 |
| 10.13344 | 1 |
| 10.135 | 1 |
| 10.13655 | 1 |
| 10.13811 | 1 |
| 10.13966 | 1 |
| 10.14122 | 1 |
| 10.14278 | 1 |
| 10.14433 | 1 |
| 10.14589 | 1 |
| 10.14744 | 1 |
| 10.149 | 1 |
| 10.15056 | 1 |
| 10.15211 | 1 |
| 10.15367 | 1 |
| 10.15523 | 1 |
| 10.15678 | 1 |
| 10.15834 | 1 |
| 10.15989 | 1 |
| 10.16145 | 1 |
| 10.16301 | 1 |
| 10.16456 | 1 |
| 10.16612 | 1 |
| 10.16767 | 1 |
| 10.16923 | 1 |
| 10.17079 | 1 |
| 10.17234 | 1 |
| 10.1739 | 1 |
| 10.17546 | 1 |
| 10.17701 | 1 |
| 10.17857 | 1 |
| 10.18012 | 1 |
| 10.18168 | 1 |
| 10.18324 | 1 |
| 10.18479 | 1 |
| 10.18635 | 1 |
| 10.1879 | 1 |
| 10.18946 | 1 |
| 10.19102 | 1 |
| 10.19257 | 1 |
| 10.19413 | 1 |
| 10.19569 | 1 |
| 10.19724 | 1 |
| 10.1988 | 1 |
| 10.20035 | 1 |
| 10.20191 | 1 |
| 10.20347 | 1 |
| 10.20502 | 1 |
| 10.20658 | 1 |
| 10.20814 | 1 |
| 10.20969 | 1 |
| 10.21125 | 1 |
| 10.2128 | 1 |
| 10.21436 | 1 |
| 10.21592 | 1 |
| 10.21747 | 1 |
| 10.21903 | 1 |
| 10.22058 | 1 |
| 10.22214 | 1 |
| 10.2237 | 1 |
| 10.22525 | 1 |
| 10.22681 | 1 |
| 10.22837 | 1 |
| 10.22992 | 1 |
| 10.23148 | 1 |
| 10.23303 | 1 |
| 10.23459 | 1 |
| 10.23615 | 1 |
| 10.2377 | 1 |
| 10.23926 | 1 |
| 10.24081 | 1 |
| 10.24237 | 1 |
| 10.24393 | 1 |
| 10.24548 | 1 |
| 10.24704 | 1 |
| 10.2486 | 1 |
| 10.25015 | 1 |
| 10.25171 | 1 |
| 10.25326 | 1 |
| 10.25482 | 1 |
| 10.25638 | 1 |
| 10.25793 | 1 |
| 10.25949 | 1 |
| 10.26104 | 1 |
| 10.2626 | 1 |
| 10.26416 | 1 |
| 10.26571 | 1 |
| 10.26727 | 1 |
| 10.26883 | 1 |
| 10.27038 | 1 |
| 10.27194 | 1 |
| 10.27349 | 1 |
| 10.27505 | 1 |
| 10.27661 | 1 |
| 10.27816 | 1 |
| 10.27972 | 1 |
| 10.28127 | 1 |
| 10.28283 | 1 |
| 10.28439 | 1 |
| 10.28594 | 1 |
| 10.2875 | 1 |
| 10.28906 | 1 |
| 10.29061 | 1 |
| 10.29217 | 1 |
| 10.29372 | 1 |
| 10.29528 | 1 |
| 10.29684 | 1 |
| 10.29839 | 1 |
| 10.29995 | 1 |
| 10.3015 | 1 |
| 10.30306 | 1 |
| 10.30462 | 1 |
| 10.30617 | 1 |
| 10.30773 | 1 |
| 10.30929 | 1 |
| 10.31084 | 1 |
| 10.3124 | 1 |
| 10.31395 | 1 |
| 10.31551 | 1 |
| 10.31707 | 1 |
| 10.31862 | 1 |
| 10.32018 | 1 |
| 10.32173 | 1 |
| 10.32329 | 1 |
| 10.32485 | 1 |
| 10.3264 | 1 |
| 10.32796 | 1 |
| 10.32952 | 1 |
| 10.33107 | 1 |
| 10.33263 | 1 |
| 10.33418 | 1 |
| 10.33574 | 1 |
| 10.3373 | 1 |
| 10.33885 | 1 |
| 10.34041 | 1 |
| 10.34196 | 1 |
| 10.34352 | 1 |
| 10.34508 | 1 |
| 10.34663 | 1 |
| 10.34819 | 1 |
| 10.34975 | 1 |
| 10.3513 | 1 |
| 10.35286 | 1 |
| 10.35441 | 1 |
| 10.35597 | 1 |
| 10.35753 | 1 |
| 10.35908 | 1 |
| 10.36064 | 1 |
| 10.36219 | 1 |
| 10.36375 | 1 |
| 10.36531 | 1 |
| 10.36686 | 1 |
| 10.36842 | 1 |
| 10.36998 | 1 |
| 10.37153 | 1 |
| 10.37309 | 1 |
| 10.37464 | 1 |
| 10.3762 | 1 |
| 10.37776 | 1 |
| 10.37931 | 1 |
| 10.38087 | 1 |
| 10.38242 | 1 |
| 10.38398 | 1 |
| 10.38554 | 1 |
| 10.38709 | 1 |
| 10.38865 | 1 |
| 10.39021 | 1 |
| 10.39176 | 1 |
| 10.39332 | 1 |
| 10.39487 | 1 |
| 10.39643 | 1 |
| 10.39799 | 1 |
| 10.39954 | 1 |
| 10.4011 | 1 |
| 10.40265 | 1 |
| 10.40421 | 1 |
| 10.40577 | 1 |
| 10.40732 | 1 |
| 10.40888 | 1 |
| 10.41044 | 1 |
| 10.41199 | 1 |
| 10.41355 | 1 |
| 10.4151 | 1 |
| 10.41666 | 1 |
| 10.41822 | 1 |
| 10.41977 | 1 |
| 10.42133 | 1 |
| 10.42288 | 1 |
| 10.42444 | 1 |
| 10.426 | 1 |
| 10.42755 | 1 |
| 10.42911 | 1 |
| 10.43067 | 1 |
| 10.43222 | 1 |
| 10.43378 | 1 |
| 10.43533 | 1 |
| 10.43689 | 1 |
| 10.43845 | 1 |
| 10.44 | 1 |
| 10.44156 | 1 |
| 10.44311 | 1 |
| 10.44467 | 1 |
| 10.44623 | 1 |
| 10.44778 | 1 |
| 10.44934 | 1 |
| 10.4509 | 1 |
| 10.45245 | 1 |
| 10.45401 | 1 |
| 10.45556 | 1 |
| 10.45712 | 1 |
| 10.45868 | 1 |
| 10.46023 | 1 |
| 10.46179 | 1 |
| 10.46334 | 1 |
| 10.4649 | 1 |
| 10.46646 | 1 |
| 10.46801 | 1 |
| 10.46957 | 1 |
| 10.47113 | 1 |
| 10.47268 | 1 |
| 10.47424 | 1 |
| 10.47579 | 1 |
| 10.47735 | 1 |
| 10.47891 | 1 |
| 10.48046 | 1 |
| 10.48202 | 1 |
| 10.48357 | 1 |
| 10.48513 | 1 |
| 10.48669 | 1 |
| 10.48824 | 1 |
| 10.4898 | 1 |
| 10.49136 | 1 |
| 10.49291 | 1 |
| 10.49447 | 1 |
| 10.49602 | 1 |
| 10.49758 | 1 |
| 10.49914 | 1 |
| 10.50069 | 1 |
| 10.50225 | 1 |
| 10.5038 | 1 |
| 10.50536 | 1 |
| 10.50692 | 1 |
| 10.50847 | 1 |
| 10.51003 | 1 |
| 10.51159 | 1 |
| 10.51314 | 1 |
| 10.5147 | 1 |
| 10.51625 | 1 |
| 10.51781 | 1 |
| 10.51937 | 1 |
| 10.52092 | 1 |
| 10.52248 | 1 |
| 10.52403 | 1 |
| 10.52559 | 1 |
| 10.52715 | 1 |
| 10.5287 | 1 |
| 10.53026 | 1 |
| 10.53182 | 1 |
| 10.53337 | 1 |
| 10.53493 | 1 |
| 10.53648 | 1 |
| 10.53804 | 1 |
| 10.5396 | 1 |
| 10.54115 | 1 |
| 10.54271 | 1 |
| 10.54426 | 1 |
| 10.54582 | 1 |
| 10.54738 | 1 |
| 10.54893 | 1 |
| 10.55049 | 1 |
| 10.55205 | 1 |
| 10.5536 | 1 |
| 10.55516 | 1 |
| 10.55671 | 1 |
| 10.55827 | 1 |
| 10.55983 | 1 |
| 10.56138 | 1 |
| 10.56294 | 1 |
| 10.56449 | 1 |
| 10.56605 | 1 |
| 10.56761 | 1 |
| 10.56916 | 1 |
| 10.57072 | 1 |
| 10.57228 | 1 |
| 10.57383 | 1 |
| 10.57539 | 1 |
| 10.57694 | 1 |
| 10.5785 | 1 |
| 10.58006 | 1 |
| 10.58161 | 1 |
| 10.58317 | 1 |
| 10.58472 | 1 |
| 10.58628 | 1 |
| 10.58784 | 1 |
| 10.58939 | 1 |
| 10.59095 | 1 |
| 10.59251 | 1 |
| 10.59406 | 1 |
| 10.59562 | 1 |
| 10.59717 | 1 |
| 10.59873 | 1 |
| 10.60029 | 1 |
| 10.60184 | 1 |
| 10.6034 | 1 |
| 10.60495 | 1 |
| 10.60651 | 1 |
| 10.60807 | 1 |
| 10.60962 | 1 |
| 10.61118 | 1 |
| 10.61274 | 1 |
| 10.61429 | 1 |
| 10.61585 | 1 |
| 10.6174 | 1 |
| 10.61896 | 1 |
| 10.62052 | 1 |
| 10.62207 | 1 |
| 10.62363 | 1 |
| 10.62518 | 1 |
| 10.62674 | 1 |
| 10.6283 | 1 |
| 10.62985 | 1 |
| 10.63141 | 1 |
| 10.63297 | 1 |
| 10.63452 | 1 |
| 10.63608 | 1 |
| 10.63763 | 1 |
| 10.63919 | 1 |
| 10.64075 | 1 |
| 10.6423 | 1 |
| 10.64386 | 1 |
| 10.64542 | 1 |
| 10.64697 | 1 |
| 10.64853 | 1 |
| 10.65008 | 1 |
| 10.65164 | 1 |
| 10.6532 | 1 |
| 10.65475 | 1 |
| 10.65631 | 1 |
| 10.65786 | 1 |
| 10.65942 | 1 |
| 10.66098 | 1 |
| 10.66253 | 1 |
| 10.66409 | 1 |
| 10.66565 | 1 |
| 10.6672 | 1 |
| 10.66876 | 1 |
| 10.67031 | 1 |
| 10.67187 | 1 |
| 10.67343 | 1 |
| 10.67498 | 1 |
| 10.67654 | 1 |
| 10.67809 | 1 |
| 10.67965 | 1 |
| 10.68121 | 1 |
| 10.68276 | 1 |
| 10.68432 | 1 |
| 10.68588 | 1 |
| 10.68743 | 1 |
| 10.68899 | 1 |
| 10.69054 | 1 |
| 10.6921 | 1 |
| 10.69366 | 1 |
| 10.69521 | 1 |
| 10.69677 | 1 |
| 10.69832 | 1 |
| 10.69988 | 1 |
| 10.70144 | 1 |
| 10.70299 | 1 |
| 10.70455 | 1 |
| 10.70611 | 1 |
| 10.70766 | 1 |
| 10.70922 | 1 |
| 10.71077 | 1 |
| 10.71233 | 1 |
| 10.71389 | 1 |
| 10.71544 | 1 |
| 10.717 | 1 |
| 10.71855 | 1 |
| 10.72011 | 1 |
| 10.72167 | 1 |
| 10.72322 | 1 |
| 10.72478 | 1 |
| 10.72634 | 1 |
| 10.72789 | 1 |
| 10.72945 | 1 |
| 10.731 | 1 |
| 10.73256 | 1 |
| 10.73412 | 1 |
| 10.73567 | 1 |
| 10.73723 | 1 |
| 10.73878 | 1 |
| 10.74034 | 1 |
| 10.7419 | 1 |
| 10.74345 | 1 |
| 10.74501 | 1 |
| 10.74657 | 1 |
| 10.74812 | 1 |
| 10.74968 | 1 |
| 10.75123 | 1 |
| 10.75279 | 1 |
| 10.75435 | 1 |
| 10.7559 | 1 |
| 10.75746 | 1 |
| 10.75901 | 1 |
| 10.76057 | 1 |
| 10.76213 | 1 |
| 10.76368 | 1 |
| 10.76524 | 1 |
| 10.7668 | 1 |
| 10.76835 | 1 |
| 10.76991 | 1 |
| 10.77146 | 1 |
| 10.77302 | 1 |
| 10.77458 | 1 |
| 10.77613 | 1 |
| 10.77769 | 1 |
| 10.77924 | 1 |
| 10.7808 | 1 |
| 10.78236 | 1 |
| 10.78391 | 1 |
| 10.78547 | 1 |
| 10.78703 | 1 |
| 10.78858 | 1 |
| 10.79014 | 1 |
| 10.79169 | 1 |
| 10.79325 | 1 |
| 10.79481 | 1 |
| 10.79636 | 1 |
| 10.79792 | 1 |
| 10.79947 | 1 |
| 10.80103 | 1 |
| 10.80259 | 1 |
| 10.80414 | 1 |
| 10.8057 | 1 |
| 10.80726 | 1 |
| 10.80881 | 1 |
| 10.81037 | 1 |
| 10.81192 | 1 |
| 10.81348 | 1 |
| 10.81504 | 1 |
| 10.81659 | 1 |
| 10.81815 | 1 |
| 10.8197 | 1 |
| 10.82126 | 1 |
| 10.82282 | 1 |
| 10.82437 | 1 |
| 10.82593 | 1 |
| 10.82749 | 1 |
| 10.82904 | 1 |
| 10.8306 | 1 |
| 10.83215 | 1 |
| 10.83371 | 1 |
| 10.83527 | 1 |
| 10.83682 | 1 |
| 10.83838 | 1 |
| 10.83993 | 1 |
| 10.84149 | 1 |
| 10.84305 | 1 |
| 10.8446 | 1 |
| 10.84616 | 1 |
| 10.84772 | 1 |
| 10.84927 | 1 |
| 10.85083 | 1 |
| 10.85238 | 1 |
| 10.85394 | 1 |
| 10.8555 | 1 |
| 10.85705 | 1 |
| 10.85861 | 1 |
| 10.86016 | 1 |
| 10.86172 | 1 |
| 10.86328 | 1 |
| 10.86483 | 1 |
| 10.86639 | 1 |
| 10.86795 | 1 |
| 10.8695 | 1 |
| 10.87106 | 1 |
| 10.87261 | 1 |
| 10.87417 | 1 |
| 10.87573 | 1 |
| 10.87728 | 1 |
| 10.87884 | 1 |
| 10.88039 | 1 |
| 10.88195 | 1 |
| 10.88351 | 1 |
| 10.88506 | 1 |
| 10.88662 | 1 |
| 10.88818 | 1 |
| 10.88973 | 1 |
| 10.89129 | 1 |
| 10.89284 | 1 |
| 10.8944 | 1 |
| 10.89596 | 1 |
| 10.89751 | 1 |
| 10.89907 | 1 |
| 10.90062 | 1 |
| 10.90218 | 1 |
| 10.90374 | 1 |
| 10.90529 | 1 |
| 10.90685 | 1 |
| 10.90841 | 1 |
| 10.90996 | 1 |
| 10.91152 | 1 |
| 10.91307 | 1 |
| 10.91463 | 1 |
| 10.91619 | 1 |
| 10.91774 | 1 |
| 10.9193 | 1 |
| 10.92085 | 1 |
| 10.92241 | 1 |
| 10.92397 | 1 |
| 10.92552 | 1 |
| 10.92708 | 1 |
| 10.92864 | 1 |
| 10.93019 | 1 |
| 10.93175 | 1 |
| 10.9333 | 1 |
| 10.93486 | 1 |
| 10.93642 | 1 |
| 10.93797 | 1 |
| 10.93953 | 1 |
| 10.94108 | 1 |
| 10.94264 | 1 |
| 10.9442 | 1 |
| 10.94575 | 1 |
| 10.94731 | 1 |
| 10.94887 | 1 |
| 10.95042 | 1 |
| 10.95198 | 1 |
| 10.95353 | 1 |
| 10.95509 | 1 |
| 10.95665 | 1 |
| 10.9582 | 1 |
| 10.95976 | 1 |
| 10.96131 | 1 |
| 10.96287 | 1 |
| 10.96443 | 1 |
| 10.96598 | 1 |
| 10.96754 | 1 |
| 10.9691 | 1 |
| 10.97065 | 1 |
| 10.97221 | 1 |
| 10.97376 | 1 |
| 10.97532 | 1 |
| 10.97688 | 1 |
| 10.97843 | 1 |
| 10.97999 | 1 |
| 10.98154 | 1 |
| 10.9831 | 1 |
| 10.98466 | 1 |
| 10.98621 | 1 |
| 10.98777 | 1 |
| 10.98933 | 1 |
| 10.99088 | 1 |
| 10.99244 | 1 |
| 10.99399 | 1 |
| 10.99555 | 1 |
| 10.99711 | 1 |
| 10.99866 | 1 |
| 11.00022 | 1 |
| 11.00177 | 1 |
| 11.00333 | 1 |
| 11.00489 | 1 |
| 11.00644 | 1 |
| 11.008 | 1 |
| 11.00956 | 1 |
| 11.01111 | 1 |
| 11.01267 | 1 |
| 11.01422 | 1 |
| 11.01578 | 1 |
| 11.01734 | 1 |
| 11.01889 | 1 |
| 11.02045 | 1 |
| 11.022 | 1 |
| 11.02356 | 1 |
| 11.02512 | 1 |
| 11.02667 | 1 |
| 11.02823 | 1 |
| 11.02979 | 1 |
| 11.03134 | 1 |
| 11.0329 | 1 |
| 11.03445 | 1 |
| 11.03601 | 1 |
| 11.03757 | 1 |
| 11.03912 | 1 |
| 11.04068 | 1 |
| 11.04223 | 1 |
| 11.04379 | 1 |
| 11.04535 | 1 |
| 11.0469 | 1 |
| 11.04846 | 1 |
| 11.05002 | 1 |
| 11.05157 | 1 |
| 11.05313 | 1 |
| 11.05468 | 1 |
| 11.05624 | 1 |
| 11.0578 | 1 |
| 11.05935 | 1 |
| 11.06091 | 1 |
| 11.06247 | 1 |
| 11.06402 | 1 |
| 11.06558 | 1 |
| 11.06713 | 1 |
| 11.06869 | 1 |
| 11.07025 | 1 |
| 11.0718 | 1 |
| 11.07336 | 1 |
| 11.07491 | 1 |
| 11.07647 | 1 |
| 11.07803 | 1 |
| 11.07958 | 1 |
| 11.08114 | 1 |
| 11.0827 | 1 |
| 11.08425 | 1 |
| 11.08581 | 1 |
| 11.08736 | 1 |
| 11.08892 | 1 |
| 11.09048 | 1 |
| 11.09203 | 1 |
| 11.09359 | 1 |
| 11.09514 | 1 |
| 11.0967 | 1 |
| 11.09826 | 1 |
| 11.09981 | 1 |
| 11.10137 | 1 |
| 11.10293 | 1 |
| 11.10448 | 1 |
| 11.10604 | 1 |
| 11.10759 | 1 |
| 11.10915 | 1 |
| 11.11071 | 1 |
| 11.11226 | 1 |
| 11.11382 | 1 |
| 11.11537 | 1 |
| 11.11693 | 1 |
| 11.11849 | 1 |
| 11.12004 | 1 |
| 11.1216 | 1 |
| 11.12316 | 1 |
| 11.12471 | 1 |
| 11.12627 | 1 |
| 11.12782 | 1 |
| 11.12938 | 1 |
| 11.13094 | 1 |
| 11.13249 | 1 |
| 11.13405 | 1 |
| 11.1356 | 1 |
| 11.13716 | 1 |
| 11.13872 | 1 |
| 11.14027 | 1 |
| 11.14183 | 1 |
| 11.14339 | 1 |
| 11.14494 | 1 |
| 11.1465 | 1 |
| 11.14805 | 1 |
| 11.14961 | 1 |
| 11.15117 | 1 |
| 11.15272 | 1 |
| 11.15428 | 1 |
| 11.15583 | 1 |
| 11.15739 | 1 |
| 11.15895 | 1 |
| 11.1605 | 1 |
| 11.16206 | 1 |
| 11.16362 | 1 |
| 11.16517 | 1 |
| 11.16673 | 1 |
| 11.16828 | 1 |
| 11.16984 | 1 |
| 11.1714 | 1 |
| 11.17295 | 1 |
| 11.17451 | 1 |
| 11.17606 | 1 |
| 11.17762 | 1 |
| 11.17918 | 1 |
| 11.18073 | 1 |
| 11.18229 | 1 |
| 11.18385 | 1 |
| 11.1854 | 1 |
| 11.18696 | 1 |
| 11.18851 | 1 |
| 11.19007 | 1 |
| 11.19163 | 1 |
| 11.19318 | 1 |
| 11.19474 | 1 |
| 11.19629 | 1 |
| 11.19785 | 1 |
| 11.19941 | 1 |
| 11.20096 | 1 |
| 11.20252 | 1 |
| 11.20408 | 1 |
| 11.20563 | 1 |
| 11.20719 | 1 |
| 11.20874 | 1 |
| 11.2103 | 1 |
| 11.21186 | 1 |
| 11.21341 | 1 |
| 11.21497 | 1 |
| 11.21652 | 1 |
| 11.21808 | 1 |
| 11.21964 | 1 |
| 11.22119 | 1 |
| 11.22275 | 1 |
| 11.22431 | 1 |
| 11.22586 | 1 |
| 11.22742 | 1 |
| 11.22897 | 1 |
| 11.23053 | 1 |
| 11.23209 | 1 |
| 11.23364 | 1 |
| 11.2352 | 1 |
| 11.23675 | 1 |
| 11.23831 | 1 |
| 11.23987 | 1 |
| 11.24142 | 1 |
| 11.24298 | 1 |
| 11.24454 | 1 |
| 11.24609 | 1 |
| 11.24765 | 1 |
| 11.2492 | 1 |
| 11.25076 | 1 |
| 11.25232 | 1 |
| 11.25387 | 1 |
| 11.25543 | 1 |
| 11.25698 | 1 |
| 11.25854 | 1 |
| 11.2601 | 1 |
| 11.26165 | 1 |
| 11.26321 | 1 |
| 11.26477 | 1 |
| 11.26632 | 1 |
| 11.26788 | 1 |
| 11.26943 | 1 |
| 11.27099 | 1 |
| 11.27255 | 1 |
| 11.2741 | 1 |
| 11.27566 | 1 |
| 11.27721 | 1 |
| 11.27877 | 1 |
| 11.28033 | 1 |
| 11.28188 | 1 |
| 11.28344 | 1 |
| 11.285 | 1 |
| 11.28655 | 1 |
| 11.28811 | 1 |
| 11.28966 | 1 |
| 11.29122 | 1 |
| 11.29278 | 1 |
| 11.29433 | 1 |
| 11.29589 | 1 |
| 11.29744 | 1 |
| 11.299 | 1 |
| 11.30056 | 1 |
| 11.30211 | 1 |
| 11.30367 | 1 |
| 11.30523 | 1 |
| 11.30678 | 1 |
| 11.30834 | 1 |
| 11.30989 | 1 |
| 11.31145 | 1 |
| 11.31301 | 1 |
| 11.31456 | 1 |
| 11.31612 | 1 |
| 11.31767 | 1 |
| 11.31923 | 1 |
| 11.32079 | 1 |
| 11.32234 | 1 |
| 11.3239 | 1 |
| 11.32546 | 1 |
| 11.32701 | 1 |
| 11.32857 | 1 |
| 11.33012 | 1 |
| 11.33168 | 1 |
| 11.33324 | 1 |
| 11.33479 | 1 |
| 11.33635 | 1 |
| 11.3379 | 1 |
| 11.33946 | 1 |
| 11.34102 | 1 |
| 11.34257 | 1 |
| 11.34413 | 1 |
| 11.34569 | 1 |
| 11.34724 | 1 |
| 11.3488 | 1 |
| 11.35035 | 1 |
| 11.35191 | 1 |
| 11.35347 | 1 |
| 11.35502 | 1 |
| 11.35658 | 1 |
| 11.35813 | 1 |
| 11.35969 | 1 |
| 11.36125 | 1 |
| 11.3628 | 1 |
| 11.36436 | 1 |
| 11.36592 | 1 |
| 11.36747 | 1 |
| 11.36903 | 1 |
| 11.37058 | 1 |
| 11.37214 | 1 |
| 11.3737 | 1 |
| 11.37525 | 1 |
| 11.37681 | 1 |
| 11.37836 | 1 |
| 11.37992 | 1 |
| 11.38148 | 1 |
| 11.38303 | 1 |
| 11.38459 | 1 |
| 11.38615 | 1 |
| 11.3877 | 1 |
| 11.38926 | 1 |
| 11.39081 | 1 |
| 11.39237 | 1 |
| 11.39393 | 1 |
| 11.39548 | 1 |
| 11.39704 | 1 |
| 11.39859 | 1 |
| 11.40015 | 1 |
| 11.40171 | 1 |
| 11.40326 | 1 |
| 11.40482 | 1 |
| 11.40638 | 1 |
| 11.40793 | 1 |
| 11.40949 | 1 |
| 11.41104 | 1 |
| 11.4126 | 1 |
| 11.41416 | 1 |
| 11.41571 | 1 |
| 11.41727 | 1 |
| 11.41882 | 1 |
| 11.42038 | 1 |
| 11.42194 | 1 |
| 11.42349 | 1 |
| 11.42505 | 1 |
| 11.42661 | 1 |
| 11.42816 | 1 |
| 11.42972 | 1 |
| 11.43127 | 1 |
| 11.43283 | 1 |
| 11.43439 | 1 |
| 11.43594 | 1 |
| 11.4375 | 1 |
| 11.43905 | 1 |
| 11.44061 | 1 |
| 11.44217 | 1 |
| 11.44372 | 1 |
| 11.44528 | 1 |
| 11.44684 | 1 |
| 11.44839 | 1 |
| 11.44995 | 1 |
| 11.4515 | 1 |
| 11.45306 | 1 |
| 11.45462 | 1 |
| 11.45617 | 1 |
| 11.45773 | 1 |
| 11.45928 | 1 |
| 11.46084 | 1 |
| 11.4624 | 1 |
| 11.46395 | 1 |
| 11.46551 | 1 |
| 11.46707 | 1 |
| 11.46862 | 1 |
| 11.47018 | 1 |
| 11.47173 | 1 |
| 11.47329 | 1 |
| 11.47485 | 1 |
| 11.4764 | 1 |
| 11.47796 | 1 |
| 11.47951 | 1 |
| 11.48107 | 1 |
| 11.48263 | 1 |
| 11.48418 | 1 |
| 11.48574 | 1 |
| 11.4873 | 1 |
| 11.48885 | 1 |
| 11.49041 | 1 |
| 11.49196 | 1 |
| 11.49352 | 1 |
| 11.49508 | 1 |
| 11.49663 | 1 |
| 11.49819 | 1 |
| 11.49975 | 1 |
| 11.5013 | 1 |
| 11.50286 | 1 |
| 11.50441 | 1 |
| 11.50597 | 1 |
| 11.50753 | 1 |
| 11.50908 | 1 |
| 11.51064 | 1 |
| 11.51219 | 1 |
| 11.51375 | 1 |
| 11.51531 | 1 |
| 11.51686 | 1 |
| 11.51842 | 1 |
| 11.51998 | 1 |
| 11.52153 | 1 |
| 11.52309 | 1 |
| 11.52464 | 1 |
| 11.5262 | 1 |
| 11.52776 | 1 |
| 11.52931 | 1 |
| 11.53087 | 1 |
| 11.53242 | 1 |
| 11.53398 | 1 |
| 11.53554 | 1 |
| 11.53709 | 1 |
| 11.53865 | 1 |
| 11.54021 | 1 |
| 11.54176 | 1 |
| 11.54332 | 1 |
| 11.54487 | 1 |
| 11.54643 | 1 |
| 11.54799 | 1 |
| 11.54954 | 1 |
| 11.5511 | 1 |
| 11.55265 | 1 |
| 11.55421 | 1 |
| 11.55577 | 1 |
| 11.55732 | 1 |
| 11.55888 | 1 |
| 11.56044 | 1 |
| 11.56199 | 1 |
| 11.56355 | 1 |
| 11.5651 | 1 |
| 11.56666 | 1 |
| 11.56822 | 1 |
| 11.56977 | 1 |
| 11.57133 | 1 |
| 11.57288 | 1 |
| 11.57444 | 1 |
| 11.576 | 1 |
| 11.57755 | 1 |
| 11.57911 | 1 |
| 11.58067 | 1 |
| 11.58222 | 1 |
| 11.58378 | 1 |
| 11.58533 | 1 |
| 11.58689 | 1 |
| 11.58845 | 1 |
| 11.59 | 1 |
| 11.59156 | 1 |
| 11.59311 | 1 |
| 11.59467 | 1 |
| 11.59623 | 1 |
| 11.59778 | 1 |
| 11.59934 | 1 |
| 11.6009 | 1 |
| 11.60245 | 1 |
| 11.60401 | 1 |
| 11.60556 | 1 |
| 11.60712 | 1 |
| 11.60868 | 1 |
| 11.61023 | 1 |
| 11.61179 | 1 |
| 11.61334 | 1 |
| 11.6149 | 1 |
| 11.61646 | 1 |
| 11.61801 | 1 |
| 11.61957 | 1 |
| 11.62113 | 1 |
| 11.62268 | 1 |
| 11.62424 | 1 |
| 11.62579 | 1 |
| 11.62735 | 1 |
| 11.62891 | 1 |
| 11.63046 | 1 |
| 11.63202 | 1 |
| 11.63357 | 1 |
| 11.63513 | 1 |
| 11.63669 | 1 |
| 11.63824 | 1 |
| 11.6398 | 1 |
| 11.64136 | 1 |
| 11.64291 | 1 |
| 11.64447 | 1 |
| 11.64602 | 1 |
| 11.64758 | 1 |
| 11.64914 | 1 |
| 11.65069 | 1 |
| 11.65225 | 1 |
| 11.6538 | 1 |
| 11.65536 | 1 |
| 11.65692 | 1 |
| 11.65847 | 1 |
| 11.66003 | 1 |
| 11.66159 | 1 |
| 11.66314 | 1 |
| 11.6647 | 1 |
| 11.66625 | 1 |
| 11.66781 | 1 |
| 11.66937 | 1 |
| 11.67092 | 1 |
| 11.67248 | 1 |
| 11.67403 | 1 |
| 11.67559 | 1 |
| 11.67715 | 1 |
| 11.6787 | 1 |
| 11.68026 | 1 |
| 11.68182 | 1 |
| 11.68337 | 1 |
| 11.68493 | 1 |
| 11.68648 | 1 |
| 11.68804 | 1 |
| 11.6896 | 1 |
| 11.69115 | 1 |
| 11.69271 | 1 |
| 11.69426 | 1 |
| 11.69582 | 1 |
| 11.69738 | 1 |
| 11.69893 | 1 |
| 11.70049 | 1 |
| 11.70205 | 1 |
| 11.7036 | 1 |
| 11.70516 | 1 |
| 11.70671 | 1 |
| 11.70827 | 1 |
| 11.70983 | 1 |
| 11.71138 | 1 |
| 11.71294 | 1 |
| 11.71449 | 1 |
| 11.71605 | 1 |
| 11.71761 | 1 |
| 11.71916 | 1 |
| 11.72072 | 1 |
| 11.72228 | 1 |
| 11.72383 | 1 |
| 11.72539 | 1 |
| 11.72694 | 1 |
| 11.7285 | 1 |
| 11.73006 | 1 |
| 11.73161 | 1 |
| 11.73317 | 1 |
| 11.73472 | 1 |
| 11.73628 | 1 |
| 11.73784 | 1 |
| 11.73939 | 1 |
| 11.74095 | 1 |
| 11.74251 | 1 |
| 11.74406 | 1 |
| 11.74562 | 1 |
| 11.74717 | 1 |
| 11.74873 | 1 |
| 11.75029 | 1 |
| 11.75184 | 1 |
| 11.7534 | 1 |
| 11.75495 | 1 |
| 11.75651 | 1 |
| 11.75807 | 1 |
| 11.75962 | 1 |
| 11.76118 | 1 |
| 11.76274 | 1 |
| 11.76429 | 1 |
| 11.76585 | 1 |
| 11.7674 | 1 |
| 11.76896 | 1 |
| 11.77052 | 1 |
| 11.77207 | 1 |
| 11.77363 | 1 |
| 11.77518 | 1 |
| 11.77674 | 1 |
| 11.7783 | 1 |
| 11.77985 | 1 |
| 11.78141 | 1 |
| 11.78297 | 1 |
| 11.78452 | 1 |
| 11.78608 | 1 |
| 11.78763 | 1 |
| 11.78919 | 1 |
| 11.79075 | 1 |
| 11.7923 | 1 |
| 11.79386 | 1 |
| 11.79541 | 1 |
| 11.79697 | 1 |
| 11.79853 | 1 |
| 11.80008 | 1 |
| 11.80164 | 1 |
| 11.8032 | 1 |
| 11.80475 | 1 |
| 11.80631 | 1 |
| 11.80786 | 1 |
| 11.80942 | 1 |
| 11.81098 | 1 |
| 11.81253 | 1 |
| 11.81409 | 1 |
| 11.81564 | 1 |
| 11.8172 | 1 |
| 11.81876 | 1 |
| 11.82031 | 1 |
| 11.82187 | 1 |
| 11.82343 | 1 |
| 11.82498 | 1 |
| 11.82654 | 1 |
| 11.82809 | 1 |
| 11.82965 | 1 |
| 11.83121 | 1 |
| 11.83276 | 1 |
| 11.83432 | 1 |
| 11.83587 | 1 |
| 11.83743 | 1 |
| 11.83899 | 1 |
| 11.84054 | 1 |
| 11.8421 | 1 |
| 11.84366 | 1 |
| 11.84521 | 1 |
| 11.84677 | 1 |
| 11.84832 | 1 |
| 11.84988 | 1 |
| 11.85144 | 1 |
| 11.85299 | 1 |
| 11.85455 | 1 |
| 11.8561 | 1 |
| 11.85766 | 1 |
| 11.85922 | 1 |
| 11.86077 | 1 |
| 11.86233 | 1 |
| 11.86389 | 1 |
| 11.86544 | 1 |
| 11.867 | 1 |
| 11.86855 | 1 |
| 11.87011 | 1 |
| 11.87167 | 1 |
| 11.87322 | 1 |
| 11.87478 | 1 |
| 11.87633 | 1 |
| 11.87789 | 1 |
| 11.87945 | 1 |
| 11.881 | 1 |
| 11.88256 | 1 |
| 11.88412 | 1 |
| 11.88567 | 1 |
| 11.88723 | 1 |
| 11.88878 | 1 |
| 11.89034 | 1 |
| 11.8919 | 1 |
| 11.89345 | 1 |
| 11.89501 | 1 |
| 11.89656 | 1 |
| 11.89812 | 1 |
| 11.89968 | 1 |
| 11.90123 | 1 |
| 11.90279 | 1 |
| 11.90435 | 1 |
| 11.9059 | 1 |
| 11.90746 | 1 |
| 11.90901 | 1 |
| 11.91057 | 1 |
| 11.91213 | 1 |
| 11.91368 | 1 |
| 11.91524 | 1 |
| 11.91679 | 1 |
| 11.91835 | 1 |
| 11.91991 | 1 |
| 11.92146 | 1 |
| 11.92302 | 1 |
| 11.92458 | 1 |
| 11.92613 | 1 |
| 11.92769 | 1 |
| 11.92924 | 1 |
| 11.9308 | 1 |
| 11.93236 | 1 |
| 11.93391 | 1 |
| 11.93547 | 1 |
| 11.93703 | 1 |
| 11.93858 | 1 |
| 11.94014 | 1 |
| 11.94169 | 1 |
| 11.94325 | 1 |
| 11.94481 | 1 |
| 11.94636 | 1 |
| 11.94792 | 1 |
| 11.94947 | 1 |
| 11.95103 | 1 |
| 11.95259 | 1 |
| 11.95414 | 1 |
| 11.9557 | 1 |
| 11.95726 | 1 |
| 11.95881 | 1 |
| 11.96037 | 1 |
| 11.96192 | 1 |
| 11.96348 | 1 |
| 11.96504 | 1 |
| 11.96659 | 1 |
| 11.96815 | 1 |
| 11.9697 | 1 |
| 11.97126 | 1 |
| 11.97282 | 1 |
| 11.97437 | 1 |
| 11.97593 | 1 |
| 11.97749 | 1 |
| 11.97904 | 1 |
| 11.9806 | 1 |
| 11.98215 | 1 |
| 11.98371 | 1 |
| 11.98527 | 1 |
| 11.98682 | 1 |
| 11.98838 | 1 |
| 11.98993 | 1 |
| 11.99149 | 1 |
| 11.99305 | 1 |
| 11.9946 | 1 |
| 11.99616 | 1 |
| 11.99772 | 1 |
| 11.99927 | 1 |
| 12.00083 | 1 |
| 12.00238 | 1 |
| 12.00394 | 1 |
| 12.0055 | 1 |
| 12.00705 | 1 |
| 12.00861 | 1 |
| 12.01016 | 1 |
| 12.01172 | 1 |
| 12.01328 | 1 |
| 12.01483 | 1 |
| 12.01639 | 1 |
| 12.01795 | 1 |
| 12.0195 | 1 |
| 12.02106 | 1 |
| 12.02261 | 1 |
| 12.02417 | 1 |
| 12.02573 | 1 |
| 12.02728 | 1 |
| 12.02884 | 1 |
| 12.03039 | 1 |
| 12.03195 | 1 |
| 12.03351 | 1 |
| 12.03506 | 1 |
| 12.03662 | 1 |
| 12.03818 | 1 |
| 12.03973 | 1 |
| 12.04129 | 1 |
| 12.04284 | 1 |
| 12.0444 | 1 |
| 12.04596 | 1 |
| 12.04751 | 1 |
| 12.04907 | 1 |
| 12.05062 | 1 |
| 12.05218 | 1 |
| 12.05374 | 1 |
| 12.05529 | 1 |
| 12.05685 | 1 |
| 12.05841 | 1 |
| 12.05996 | 1 |
| 12.06152 | 1 |
| 12.06307 | 1 |
| 12.06463 | 1 |
| 12.06619 | 1 |
| 12.06774 | 1 |
| 12.0693 | 1 |
| 12.07085 | 1 |
| 12.07241 | 1 |
| 12.07397 | 1 |
| 12.07552 | 1 |
| 12.07708 | 1 |
| 12.07864 | 1 |
| 12.08019 | 1 |
| 12.08175 | 1 |
| 12.0833 | 1 |
| 12.08486 | 1 |
| 12.08642 | 1 |
| 12.08797 | 1 |
| 12.08953 | 1 |
| 12.09108 | 1 |
| 12.09264 | 1 |
| 12.0942 | 1 |
| 12.09575 | 1 |
| 12.09731 | 1 |
| 12.09887 | 1 |
| 12.10042 | 1 |
| 12.10198 | 1 |
| 12.10353 | 1 |
| 12.10509 | 1 |
| 12.10665 | 1 |
| 12.1082 | 1 |
| 12.10976 | 1 |
| 12.11131 | 1 |
| 12.11287 | 1 |
| 12.11443 | 1 |
| 12.11598 | 1 |
| 12.11754 | 1 |
| 12.1191 | 1 |
| 12.12065 | 1 |
| 12.12221 | 1 |
| 12.12376 | 1 |
| 12.12532 | 1 |
| 12.12688 | 1 |
| 12.12843 | 1 |
| 12.12999 | 1 |
| 12.13154 | 1 |
| 12.1331 | 1 |
| 12.13466 | 1 |
| 12.13621 | 1 |
| 12.13777 | 1 |
| 12.13933 | 1 |
| 12.14088 | 1 |
| 12.14244 | 1 |
| 12.14399 | 1 |
| 12.14555 | 1 |
| 12.14711 | 1 |
| 12.14866 | 1 |
| 12.15022 | 1 |
| 12.15177 | 1 |
| 12.15333 | 1 |
| 12.15489 | 1 |
| 12.15644 | 1 |
| 12.158 | 1 |
| 12.15956 | 1 |
| 12.16111 | 1 |
| 12.16267 | 1 |
| 12.16422 | 1 |
| 12.16578 | 1 |
| 12.16734 | 1 |
| 12.16889 | 1 |
| 12.17045 | 1 |
| 12.172 | 1 |
| 12.17356 | 1 |
| 12.17512 | 1 |
| 12.17667 | 1 |
| 12.17823 | 1 |
| 12.17979 | 1 |
| 12.18134 | 1 |
| 12.1829 | 1 |
| 12.18445 | 1 |
| 12.18601 | 1 |
| 12.18757 | 1 |
| 12.18912 | 1 |
| 12.19068 | 1 |
| 12.19223 | 1 |
| 12.19379 | 1 |
| 12.19535 | 1 |
| 12.1969 | 1 |
| 12.19846 | 1 |
| 12.20002 | 1 |
| 12.20157 | 1 |
| 12.20313 | 1 |
| 12.20468 | 1 |
| 12.20624 | 1 |
| 12.2078 | 1 |
| 12.20935 | 1 |
| 12.21091 | 1 |
| 12.21246 | 1 |
| 12.21402 | 1 |
| 12.21558 | 1 |
| 12.21713 | 1 |
| 12.21869 | 1 |
| 12.22025 | 1 |
| 12.2218 | 1 |
| 12.22336 | 1 |
| 12.22491 | 1 |
| 12.22647 | 1 |
| 12.22803 | 1 |
| 12.22958 | 1 |
| 12.23114 | 1 |
| 12.23269 | 1 |
| 12.23425 | 1 |
| 12.23581 | 1 |
| 12.23736 | 1 |
| 12.23892 | 1 |
| 12.24048 | 1 |
| 12.24203 | 1 |
| 12.24359 | 1 |
| 12.24514 | 1 |
| 12.2467 | 1 |
| 12.24826 | 1 |
| 12.24981 | 1 |
| 12.25137 | 1 |
| 12.25292 | 1 |
| 12.25448 | 1 |
| 12.25604 | 1 |
| 12.25759 | 1 |
| 12.25915 | 1 |
| 12.26071 | 1 |
| 12.26226 | 1 |
| 12.26382 | 1 |
| 12.26537 | 1 |
| 12.26693 | 1 |
| 12.26849 | 1 |
| 12.27004 | 1 |
| 12.2716 | 1 |
| 12.27315 | 1 |
| 12.27471 | 1 |
| 12.27627 | 1 |
| 12.27782 | 1 |
| 12.27938 | 1 |
| 12.28094 | 1 |
| 12.28249 | 1 |
| 12.28405 | 1 |
| 12.2856 | 1 |
| 12.28716 | 1 |
| 12.28872 | 1 |
| 12.29027 | 1 |
| 12.29183 | 1 |
| 12.29338 | 1 |
| 12.29494 | 1 |
| 12.2965 | 1 |
| 12.29805 | 1 |
| 12.29961 | 1 |
| 12.30117 | 1 |
| 12.30272 | 1 |
| 12.30428 | 1 |
| 12.30583 | 1 |
| 12.30739 | 1 |
| 12.30895 | 1 |
| 12.3105 | 1 |
| 12.31206 | 1 |
| 12.31361 | 1 |
| 12.31517 | 1 |
| 12.31673 | 1 |
| 12.31828 | 1 |
| 12.31984 | 1 |
| 12.3214 | 1 |
| 12.32295 | 1 |
| 12.32451 | 1 |
| 12.32606 | 1 |
| 12.32762 | 1 |
| 12.32918 | 1 |
| 12.33073 | 1 |
| 12.33229 | 1 |
| 12.33384 | 1 |
| 12.3354 | 1 |
| 12.33696 | 1 |
| 12.33851 | 1 |
| 12.34007 | 1 |
| 12.34163 | 1 |
| 12.34318 | 1 |
| 12.34474 | 1 |
| 12.34629 | 1 |
| 12.34785 | 1 |
| 12.34941 | 1 |
| 12.35096 | 1 |
| 12.35252 | 1 |
| 12.35408 | 1 |
| 12.35563 | 1 |
| 12.35719 | 1 |
| 12.35874 | 1 |
| 12.3603 | 1 |
| 12.36186 | 1 |
| 12.36341 | 1 |
| 12.36497 | 1 |
| 12.36652 | 1 |
| 12.36808 | 1 |
| 12.36964 | 1 |
| 12.37119 | 1 |
| 12.37275 | 1 |
| 12.37431 | 1 |
| 12.37586 | 1 |
| 12.37742 | 1 |
| 12.37897 | 1 |
| 12.38053 | 1 |
| 12.38209 | 1 |
| 12.38364 | 1 |
| 12.3852 | 1 |
| 12.38675 | 1 |
| 12.38831 | 1 |
| 12.38987 | 1 |
| 12.39142 | 1 |
| 12.39298 | 1 |
| 12.39454 | 1 |
| 12.39609 | 1 |
| 12.39765 | 1 |
| 12.3992 | 1 |
| 12.40076 | 1 |
| 12.40232 | 1 |
| 12.40387 | 1 |
| 12.40543 | 1 |
| 12.40698 | 1 |
| 12.40854 | 1 |
| 12.4101 | 1 |
| 12.41165 | 1 |
| 12.41321 | 1 |
| 12.41477 | 1 |
| 12.41632 | 1 |
| 12.41788 | 1 |
| 12.41943 | 1 |
| 12.42099 | 1 |
| 12.42255 | 1 |
| 12.4241 | 1 |
| 12.42566 | 1 |
| 12.42721 | 1 |
| 12.42877 | 1 |
| 12.43033 | 1 |
| 12.43188 | 1 |
| 12.43344 | 1 |
| 12.435 | 1 |
| 12.43655 | 1 |
| 12.43811 | 1 |
| 12.43966 | 1 |
| 12.44122 | 1 |
| 12.44278 | 1 |
| 12.44433 | 1 |
| 12.44589 | 1 |
| 12.44744 | 1 |
| 12.449 | 1 |
| 12.45056 | 1 |
| 12.45211 | 1 |
| 12.45367 | 1 |
| 12.45523 | 1 |
| 12.45678 | 1 |
| 12.45834 | 1 |
| 12.45989 | 1 |
| 12.46145 | 1 |
| 12.46301 | 1 |
| 12.46456 | 1 |
| 12.46612 | 1 |
| 12.46767 | 1 |
| 12.46923 | 1 |
| 12.47079 | 1 |
| 12.47234 | 1 |
| 12.4739 | 1 |
| 12.47546 | 1 |
| 12.47701 | 1 |
| 12.47857 | 1 |
| 12.48012 | 1 |
| 12.48168 | 1 |
| 12.48324 | 1 |
| 12.48479 | 1 |
| 12.48635 | 1 |
| 12.4879 | 1 |
| 12.48946 | 1 |
| 12.49102 | 1 |
| 12.49257 | 1 |
| 12.49413 | 1 |
| 12.49569 | 1 |
| 12.49724 | 1 |
| 12.4988 | 1 |
| 12.50035 | 1 |
| 12.50191 | 1 |
| 12.50347 | 1 |
| 12.50502 | 1 |
| 12.50658 | 1 |
| 12.50813 | 1 |
| 12.50969 | 1 |
| 12.51125 | 1 |
| 12.5128 | 1 |
| 12.51436 | 1 |
| 12.51592 | 1 |
| 12.51747 | 1 |
| 12.51903 | 1 |
| 12.52058 | 1 |
| 12.52214 | 1 |
| 12.5237 | 1 |
| 12.52525 | 1 |
| 12.52681 | 1 |
| 12.52836 | 1 |
| 12.52992 | 1 |
| 12.53148 | 1 |
| 12.53303 | 1 |
| 12.53459 | 1 |
| 12.53615 | 1 |
| 12.5377 | 1 |
| 12.53926 | 1 |
| 12.54081 | 1 |
| 12.54237 | 1 |
| 12.54393 | 1 |
| 12.54548 | 1 |
| 12.54704 | 1 |
| 12.54859 | 1 |
| 12.55015 | 1 |
| 12.55171 | 1 |
| 12.55326 | 1 |
| 12.55482 | 1 |
| 12.55638 | 1 |
| 12.55793 | 1 |
| 12.55949 | 1 |
| 12.56104 | 1 |
| 12.5626 | 1 |
| 12.56416 | 1 |
| 12.56571 | 1 |
| 12.56727 | 1 |
| 12.56882 | 1 |
| 12.57038 | 1 |
| 12.57194 | 1 |
| 12.57349 | 1 |
| 12.57505 | 1 |
| 12.57661 | 1 |
| 12.57816 | 1 |
| 12.57972 | 1 |
| 12.58127 | 1 |
| 12.58283 | 1 |
| 12.58439 | 1 |
| 12.58594 | 1 |
| 12.5875 | 1 |
| 12.58905 | 1 |
| 12.59061 | 1 |
| 12.59217 | 1 |
| 12.59372 | 1 |
| 12.59528 | 1 |
| 12.59684 | 1 |
| 12.59839 | 1 |
| 12.59995 | 1 |
| 12.6015 | 1 |
| 12.60306 | 1 |
| 12.60462 | 1 |
| 12.60617 | 1 |
| 12.60773 | 1 |
| 12.60928 | 1 |
| 12.61084 | 1 |
| 12.6124 | 1 |
| 12.61395 | 1 |
| 12.61551 | 1 |
| 12.61707 | 1 |
| 12.61862 | 1 |
| 12.62018 | 1 |
| 12.62173 | 1 |
| 12.62329 | 1 |
| 12.62485 | 1 |
| 12.6264 | 1 |
| 12.62796 | 1 |
| 12.62951 | 1 |
| 12.63107 | 1 |
| 12.63263 | 1 |
| 12.63418 | 1 |
| 12.63574 | 1 |
| 12.6373 | 1 |
| 12.63885 | 1 |
| 12.64041 | 1 |
| 12.64196 | 1 |
| 12.64352 | 1 |
| 12.64508 | 1 |
| 12.64663 | 1 |
| 12.64819 | 1 |
| 12.64974 | 1 |
| 12.6513 | 1 |
| 12.65286 | 1 |
| 12.65441 | 1 |
| 12.65597 | 1 |
| 12.65753 | 1 |
| 12.65908 | 1 |
| 12.66064 | 1 |
| 12.66219 | 1 |
| 12.66375 | 1 |
| 12.66531 | 1 |
| 12.66686 | 1 |
| 12.66842 | 1 |
| 12.66997 | 1 |
| 12.67153 | 1 |
| 12.67309 | 1 |
| 12.67464 | 1 |
| 12.6762 | 1 |
| 12.67776 | 1 |
| 12.67931 | 1 |
| 12.68087 | 1 |
| 12.68242 | 1 |
| 12.68398 | 1 |
| 12.68554 | 1 |
| 12.68709 | 1 |
| 12.68865 | 1 |
| 12.6902 | 1 |
| 12.69176 | 1 |
| 12.69332 | 1 |
| 12.69487 | 1 |
| 12.69643 | 1 |
| 12.69799 | 1 |
| 12.69954 | 1 |
| 12.7011 | 1 |
| 12.70265 | 1 |
| 12.70421 | 1 |
| 12.70577 | 1 |
| 12.70732 | 1 |
| 12.70888 | 1 |
| 12.71043 | 1 |
| 12.71199 | 1 |
| 12.71355 | 1 |
| 12.7151 | 1 |
| 12.71666 | 1 |
| 12.71822 | 1 |
| 12.71977 | 1 |
| 12.72133 | 1 |
| 12.72288 | 1 |
| 12.72444 | 1 |
| 12.726 | 1 |
| 12.72755 | 1 |
| 12.72911 | 1 |
| 12.73066 | 1 |
| 12.73222 | 1 |
| 12.73378 | 1 |
| 12.73533 | 1 |
| 12.73689 | 1 |
| 12.73845 | 1 |
| 12.74 | 1 |
| 12.74156 | 1 |
| 12.74311 | 1 |
| 12.74467 | 1 |
| 12.74623 | 1 |
| 12.74778 | 1 |
| 12.74934 | 1 |
| 12.75089 | 1 |
| 12.75245 | 1 |
| 12.75401 | 1 |
| 12.75556 | 1 |
| 12.75712 | 1 |
| 12.75868 | 1 |
| 12.76023 | 1 |
| 12.76179 | 1 |
| 12.76334 | 1 |
| 12.7649 | 1 |
| 12.76646 | 1 |
| 12.76801 | 1 |
| 12.76957 | 1 |
| 12.77112 | 1 |
| 12.77268 | 1 |
| 12.77424 | 1 |
| 12.77579 | 1 |
| 12.77735 | 1 |
| 12.77891 | 1 |
| 12.78046 | 1 |
| 12.78202 | 1 |
| 12.78357 | 1 |
| 12.78513 | 1 |
| 12.78669 | 1 |
| 12.78824 | 1 |
| 12.7898 | 1 |
| 12.79136 | 1 |
| 12.79291 | 1 |
| 12.79447 | 1 |
| 12.79602 | 1 |
| 12.79758 | 1 |
| 12.79914 | 1 |
| 12.80069 | 1 |
| 12.80225 | 1 |
| 12.8038 | 1 |
| 12.80536 | 1 |
| 12.80692 | 1 |
| 12.80847 | 1 |
| 12.81003 | 1 |
| 12.81159 | 1 |
| 12.81314 | 1 |
| 12.8147 | 1 |
| 12.81625 | 1 |
| 12.81781 | 1 |
| 12.81937 | 1 |
| 12.82092 | 1 |
| 12.82248 | 1 |
| 12.82403 | 1 |
| 12.82559 | 1 |
| 12.82715 | 1 |
| 12.8287 | 1 |
| 12.83026 | 1 |
| 12.83182 | 1 |
| 12.83337 | 1 |
| 12.83493 | 1 |
| 12.83648 | 1 |
| 12.83804 | 1 |
| 12.8396 | 1 |
| 12.84115 | 1 |
| 12.84271 | 1 |
| 12.84426 | 1 |
| 12.84582 | 1 |
| 12.84738 | 1 |
| 12.84893 | 1 |
| 12.85049 | 1 |
| 12.85205 | 1 |
| 12.8536 | 1 |
| 12.85516 | 1 |
| 12.85671 | 1 |
| 12.85827 | 1 |
| 12.85983 | 1 |
| 12.86138 | 1 |
| 12.86294 | 1 |
| 12.86449 | 1 |
| 12.86605 | 1 |
| 12.86761 | 1 |
| 12.86916 | 1 |
| 12.87072 | 1 |
| 12.87228 | 1 |
| 12.87383 | 1 |
| 12.87539 | 1 |
| 12.87694 | 1 |
| 12.8785 | 1 |
| 12.88006 | 1 |
| 12.88161 | 1 |
| 12.88317 | 1 |
| 12.88472 | 1 |
| 12.88628 | 1 |
| 12.88784 | 1 |
| 12.88939 | 1 |
| 12.89095 | 1 |
| 12.89251 | 1 |
| 12.89406 | 1 |
| 12.89562 | 1 |
| 12.89717 | 1 |
| 12.89873 | 1 |
| 12.90029 | 1 |
| 12.90184 | 1 |
| 12.9034 | 1 |
| 12.90495 | 1 |
| 12.90651 | 1 |
| 12.90807 | 1 |
| 12.90962 | 1 |
| 12.91118 | 1 |
| 12.91274 | 1 |
| 12.91429 | 1 |
| 12.91585 | 1 |
| 12.9174 | 1 |
| 12.91896 | 1 |
| 12.92052 | 1 |
| 12.92207 | 1 |
| 12.92363 | 1 |
| 12.92518 | 1 |
| 12.92674 | 1 |
| 12.9283 | 1 |
| 12.92985 | 1 |
| 12.93141 | 1 |